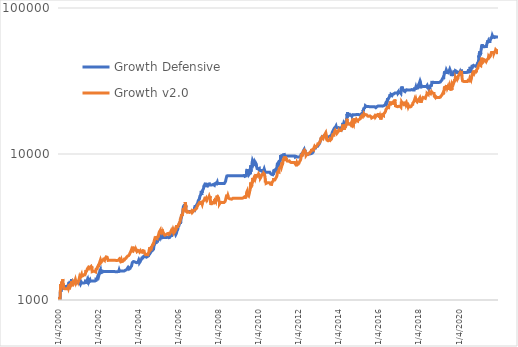
| Category | Growth Defensive | Growth v2.0  |
|---|---|---|
| 1/4/00 | 1000 | 1000 |
| 1/5/00 | 1003.036 | 1003.036 |
| 1/6/00 | 1005.294 | 1005.294 |
| 1/7/00 | 1005.06 | 1005.06 |
| 1/10/00 | 1019.551 | 1019.551 |
| 1/11/00 | 1037.263 | 1037.263 |
| 1/12/00 | 1026.501 | 1026.501 |
| 1/13/00 | 1026.954 | 1022.115 |
| 1/14/00 | 1032.608 | 1022.93 |
| 1/17/00 | 1023.44 | 1013.852 |
| 1/18/00 | 1015.754 | 1007.795 |
| 1/19/00 | 1015.568 | 1010.783 |
| 1/20/00 | 1034.936 | 1025.202 |
| 1/21/00 | 1020.52 | 1012.515 |
| 1/24/00 | 1007.949 | 1003.256 |
| 1/25/00 | 1000.638 | 992.846 |
| 1/27/00 | 1003.962 | 986.482 |
| 1/28/00 | 1035.877 | 1004.851 |
| 1/31/00 | 1011.681 | 998.544 |
| 2/1/00 | 998.548 | 999.983 |
| 2/2/00 | 1000.964 | 1006.538 |
| 2/3/00 | 988.775 | 1005.307 |
| 2/4/00 | 981.664 | 1000.814 |
| 2/7/00 | 991.341 | 1007.833 |
| 2/8/00 | 988.443 | 1011.024 |
| 2/9/00 | 997.393 | 1023.704 |
| 2/10/00 | 995.479 | 1020.842 |
| 2/11/00 | 1031.614 | 1053.531 |
| 2/14/00 | 1025.096 | 1057.264 |
| 2/15/00 | 1061.849 | 1082.846 |
| 2/16/00 | 1054.399 | 1080.925 |
| 2/17/00 | 1256.015 | 1285.806 |
| 2/18/00 | 1254.443 | 1290.288 |
| 2/21/00 | 1247.055 | 1284.836 |
| 2/22/00 | 1235.045 | 1266.466 |
| 2/23/00 | 1219.403 | 1268.23 |
| 2/24/00 | 1215.129 | 1256.827 |
| 2/25/00 | 1160.608 | 1237.536 |
| 2/28/00 | 1140.042 | 1223.905 |
| 2/29/00 | 1143.473 | 1225.102 |
| 3/1/00 | 1164.226 | 1245.711 |
| 3/2/00 | 1160.19 | 1244.124 |
| 3/3/00 | 1164.266 | 1252.529 |
| 3/6/00 | 1174.266 | 1259.044 |
| 3/7/00 | 1172.549 | 1259.177 |
| 3/8/00 | 1185.238 | 1274.489 |
| 3/9/00 | 1248.823 | 1338.648 |
| 3/10/00 | 1239.998 | 1320.71 |
| 3/13/00 | 1221.336 | 1329.579 |
| 3/14/00 | 1202.146 | 1308.362 |
| 3/15/00 | 1179.975 | 1270.431 |
| 3/16/00 | 1212.049 | 1302.504 |
| 3/17/00 | 1217.064 | 1314.364 |
| 3/20/00 | 1192.43 | 1296.609 |
| 3/21/00 | 1190.42 | 1315.158 |
| 3/22/00 | 1210.834 | 1329.492 |
| 3/23/00 | 1212.535 | 1324.609 |
| 3/24/00 | 1204.83 | 1317.545 |
| 3/27/00 | 1207.393 | 1333.15 |
| 3/28/00 | 1230.353 | 1364.961 |
| 3/29/00 | 1255.274 | 1389.19 |
| 3/30/00 | 1261.876 | 1392.548 |
| 3/31/00 | 1236.577 | 1378.398 |
| 4/3/00 | 1230.364 | 1359.225 |
| 4/4/00 | 1232.441 | 1298.787 |
| 4/5/00 | 1236.101 | 1270.415 |
| 4/6/00 | 1238.698 | 1276.308 |
| 4/7/00 | 1238.698 | 1283.265 |
| 4/10/00 | 1238.698 | 1298.486 |
| 4/11/00 | 1238.698 | 1279.275 |
| 4/12/00 | 1238.508 | 1251.778 |
| 4/13/00 | 1237.01 | 1226.87 |
| 4/14/00 | 1237.01 | 1227.103 |
| 4/17/00 | 1237.01 | 1199.176 |
| 4/18/00 | 1237.01 | 1197.257 |
| 4/19/00 | 1237.01 | 1204.24 |
| 4/20/00 | 1237.01 | 1200.465 |
| 4/26/00 | 1237.01 | 1197.986 |
| 4/27/00 | 1237.01 | 1195.097 |
| 4/28/00 | 1237.01 | 1196.443 |
| 5/1/00 | 1237.01 | 1193.445 |
| 5/2/00 | 1237.01 | 1194.721 |
| 5/3/00 | 1237.01 | 1197.196 |
| 5/4/00 | 1237.01 | 1194.197 |
| 5/5/00 | 1237.01 | 1196.743 |
| 5/8/00 | 1237.01 | 1194.568 |
| 5/9/00 | 1237.01 | 1192.698 |
| 5/10/00 | 1237.01 | 1192.998 |
| 5/11/00 | 1237.01 | 1191.952 |
| 5/12/00 | 1237.01 | 1192.475 |
| 5/15/00 | 1237.01 | 1192.475 |
| 5/16/00 | 1237.01 | 1192.475 |
| 5/17/00 | 1237.01 | 1191.428 |
| 5/18/00 | 1237.01 | 1192.998 |
| 5/19/00 | 1237.01 | 1193.521 |
| 5/22/00 | 1237.01 | 1192.475 |
| 5/23/00 | 1237.01 | 1192.475 |
| 5/24/00 | 1237.01 | 1192.998 |
| 5/25/00 | 1237.01 | 1192.998 |
| 5/26/00 | 1237.01 | 1192.475 |
| 5/29/00 | 1237.01 | 1192.998 |
| 5/30/00 | 1237.01 | 1192.475 |
| 5/31/00 | 1237.01 | 1193.521 |
| 6/1/00 | 1237.01 | 1192.998 |
| 6/2/00 | 1237.01 | 1192.998 |
| 6/5/00 | 1237.01 | 1192.998 |
| 6/6/00 | 1237.01 | 1192.998 |
| 6/7/00 | 1237.01 | 1192.998 |
| 6/8/00 | 1237.01 | 1192.998 |
| 6/9/00 | 1237.01 | 1192.998 |
| 6/13/00 | 1237.01 | 1192.998 |
| 6/14/00 | 1237.01 | 1192.998 |
| 6/15/00 | 1237.01 | 1192.998 |
| 6/16/00 | 1237.01 | 1192.998 |
| 6/19/00 | 1237.01 | 1192.998 |
| 6/20/00 | 1237.01 | 1192.998 |
| 6/21/00 | 1237.01 | 1192.998 |
| 6/22/00 | 1237.01 | 1192.998 |
| 6/23/00 | 1237.01 | 1192.998 |
| 6/26/00 | 1237.01 | 1192.998 |
| 6/27/00 | 1240.075 | 1195.947 |
| 6/28/00 | 1238.99 | 1194.901 |
| 6/29/00 | 1242.245 | 1198.04 |
| 6/30/00 | 1246.864 | 1202.488 |
| 7/3/00 | 1242.157 | 1197.942 |
| 7/4/00 | 1244.269 | 1199.971 |
| 7/5/00 | 1247.542 | 1203.126 |
| 7/6/00 | 1266.322 | 1221.223 |
| 7/7/00 | 1264.223 | 1219.195 |
| 7/10/00 | 1252.246 | 1207.647 |
| 7/11/00 | 1253.798 | 1209.146 |
| 7/12/00 | 1245.251 | 1200.907 |
| 7/13/00 | 1239.687 | 1195.544 |
| 7/14/00 | 1239.986 | 1195.827 |
| 7/17/00 | 1247.714 | 1203.273 |
| 7/18/00 | 1262.194 | 1217.234 |
| 7/19/00 | 1271.851 | 1226.546 |
| 7/20/00 | 1271.096 | 1225.82 |
| 7/21/00 | 1277.903 | 1232.383 |
| 7/24/00 | 1284.601 | 1238.841 |
| 7/25/00 | 1299.286 | 1253.004 |
| 7/26/00 | 1326.992 | 1279.725 |
| 7/27/00 | 1266.879 | 1221.741 |
| 7/28/00 | 1230.012 | 1186.176 |
| 7/31/00 | 1217.394 | 1174.006 |
| 8/1/00 | 1235.591 | 1191.56 |
| 8/2/00 | 1233.73 | 1189.764 |
| 8/3/00 | 1247.96 | 1203.483 |
| 8/4/00 | 1253.269 | 1208.603 |
| 8/7/00 | 1256.778 | 1211.985 |
| 8/8/00 | 1270.35 | 1225.072 |
| 8/9/00 | 1272.594 | 1227.24 |
| 8/10/00 | 1268.276 | 1223.073 |
| 8/11/00 | 1273.795 | 1228.399 |
| 8/14/00 | 1275.058 | 1229.62 |
| 8/15/00 | 1265.306 | 1220.215 |
| 8/16/00 | 1277.36 | 1231.839 |
| 8/17/00 | 1281.381 | 1235.714 |
| 8/18/00 | 1290.311 | 1244.315 |
| 8/21/00 | 1304.238 | 1257.746 |
| 8/22/00 | 1325.046 | 1277.805 |
| 8/23/00 | 1340.667 | 1292.867 |
| 8/24/00 | 1355.38 | 1307.062 |
| 8/25/00 | 1350.375 | 1302.24 |
| 8/28/00 | 1363.19 | 1314.608 |
| 8/29/00 | 1349.432 | 1301.339 |
| 8/30/00 | 1348.451 | 1300.393 |
| 8/31/00 | 1330.579 | 1283.16 |
| 9/1/00 | 1337.648 | 1289.985 |
| 9/4/00 | 1352.81 | 1304.606 |
| 9/5/00 | 1369.145 | 1320.359 |
| 9/6/00 | 1391.26 | 1341.686 |
| 9/7/00 | 1389.524 | 1340.018 |
| 9/8/00 | 1404.104 | 1354.085 |
| 9/11/00 | 1388.962 | 1339.478 |
| 9/12/00 | 1384.996 | 1333.801 |
| 9/13/00 | 1368.891 | 1318.822 |
| 9/14/00 | 1377.664 | 1327.652 |
| 9/15/00 | 1377.02 | 1325.082 |
| 9/18/00 | 1376.121 | 1328.111 |
| 9/19/00 | 1340.773 | 1295.185 |
| 9/20/00 | 1339.113 | 1300.618 |
| 9/21/00 | 1339.113 | 1281.749 |
| 9/22/00 | 1339.113 | 1262.334 |
| 9/25/00 | 1339.113 | 1241.358 |
| 9/26/00 | 1339.113 | 1255.956 |
| 9/27/00 | 1339.113 | 1257.59 |
| 9/28/00 | 1339.113 | 1275.503 |
| 9/29/00 | 1333.774 | 1273.13 |
| 10/2/00 | 1335.766 | 1285.334 |
| 10/3/00 | 1329.993 | 1296.278 |
| 10/4/00 | 1328.205 | 1305.65 |
| 10/5/00 | 1314.857 | 1299.66 |
| 10/6/00 | 1326.141 | 1324.797 |
| 10/9/00 | 1321.618 | 1329.645 |
| 10/10/00 | 1321.618 | 1327.309 |
| 10/11/00 | 1321.618 | 1333.831 |
| 10/12/00 | 1321.618 | 1326.594 |
| 10/13/00 | 1321.618 | 1327.752 |
| 10/16/00 | 1321.618 | 1328.826 |
| 10/17/00 | 1321.618 | 1332.28 |
| 10/18/00 | 1321.618 | 1323.485 |
| 10/19/00 | 1321.618 | 1303.222 |
| 10/20/00 | 1321.618 | 1319.859 |
| 10/23/00 | 1321.618 | 1317.955 |
| 10/24/00 | 1321.618 | 1310.437 |
| 10/25/00 | 1321.618 | 1321.753 |
| 10/26/00 | 1321.618 | 1307.59 |
| 10/27/00 | 1321.618 | 1314.051 |
| 10/30/00 | 1321.618 | 1309.943 |
| 10/31/00 | 1321.618 | 1317.461 |
| 11/1/00 | 1321.618 | 1315.053 |
| 11/2/00 | 1321.618 | 1320.443 |
| 11/3/00 | 1321.618 | 1329.46 |
| 11/6/00 | 1321.618 | 1336.368 |
| 11/7/00 | 1321.618 | 1348.137 |
| 11/8/00 | 1321.618 | 1348.714 |
| 11/9/00 | 1321.618 | 1352.863 |
| 11/10/00 | 1318.451 | 1353.385 |
| 11/13/00 | 1313.041 | 1358.533 |
| 11/14/00 | 1312.635 | 1350.425 |
| 11/15/00 | 1312.635 | 1359.847 |
| 11/16/00 | 1312.635 | 1380.058 |
| 11/17/00 | 1315.738 | 1373.664 |
| 11/20/00 | 1315.136 | 1367.486 |
| 11/21/00 | 1310.986 | 1364.129 |
| 11/22/00 | 1309.782 | 1352.387 |
| 11/23/00 | 1309.782 | 1330.084 |
| 11/24/00 | 1309.782 | 1326.635 |
| 11/27/00 | 1309.782 | 1307.399 |
| 11/28/00 | 1309.782 | 1302.211 |
| 11/29/00 | 1309.782 | 1301.442 |
| 11/30/00 | 1309.782 | 1301.151 |
| 12/1/00 | 1309.782 | 1308.731 |
| 12/4/00 | 1309.782 | 1310.097 |
| 12/5/00 | 1309.782 | 1317.244 |
| 12/6/00 | 1303.165 | 1310.802 |
| 12/7/00 | 1308.353 | 1331.808 |
| 12/8/00 | 1310.931 | 1333.527 |
| 12/11/00 | 1314.386 | 1342.311 |
| 12/12/00 | 1314.386 | 1349.482 |
| 12/13/00 | 1314.386 | 1343.883 |
| 12/14/00 | 1314.386 | 1350.309 |
| 12/15/00 | 1314.386 | 1327.373 |
| 12/18/00 | 1314.386 | 1337.944 |
| 12/19/00 | 1314.386 | 1342.663 |
| 12/20/00 | 1314.386 | 1338.064 |
| 12/21/00 | 1314.386 | 1328.605 |
| 12/22/00 | 1314.386 | 1328.047 |
| 12/27/00 | 1314.386 | 1338.446 |
| 12/28/00 | 1314.386 | 1350.651 |
| 12/29/00 | 1314.386 | 1355.938 |
| 1/2/01 | 1314.386 | 1372.54 |
| 1/3/01 | 1314.386 | 1370.428 |
| 1/4/01 | 1314.386 | 1371.98 |
| 1/5/01 | 1309.308 | 1361.367 |
| 1/8/01 | 1303.499 | 1353.46 |
| 1/9/01 | 1300.698 | 1339.861 |
| 1/10/01 | 1300.698 | 1338.699 |
| 1/11/01 | 1300.698 | 1347.287 |
| 1/12/01 | 1300.698 | 1343.675 |
| 1/15/01 | 1300.698 | 1335.371 |
| 1/16/01 | 1300.698 | 1344.322 |
| 1/17/01 | 1300.698 | 1351.952 |
| 1/18/01 | 1300.698 | 1370.916 |
| 1/19/01 | 1300.698 | 1376.613 |
| 1/22/01 | 1300.698 | 1375.755 |
| 1/23/01 | 1300.698 | 1379.633 |
| 1/24/01 | 1300.922 | 1385.025 |
| 1/25/01 | 1298.437 | 1389.675 |
| 1/29/01 | 1298.851 | 1389.753 |
| 1/30/01 | 1302.993 | 1435.679 |
| 1/31/01 | 1307.964 | 1446.406 |
| 2/1/01 | 1309.206 | 1442.849 |
| 2/2/01 | 1303.822 | 1419.131 |
| 2/5/01 | 1303.398 | 1413.413 |
| 2/6/01 | 1308.881 | 1416.126 |
| 2/7/01 | 1301.757 | 1410.354 |
| 2/8/01 | 1309.634 | 1417.1 |
| 2/9/01 | 1293.25 | 1407.412 |
| 2/12/01 | 1289.591 | 1411.898 |
| 2/13/01 | 1293.212 | 1427.592 |
| 2/14/01 | 1291.383 | 1431.896 |
| 2/15/01 | 1280.877 | 1395.801 |
| 2/16/01 | 1295.522 | 1401.455 |
| 2/19/01 | 1280.529 | 1414.266 |
| 2/20/01 | 1268.828 | 1425.463 |
| 2/21/01 | 1275.913 | 1433.589 |
| 2/22/01 | 1277.774 | 1439.523 |
| 2/23/01 | 1303.233 | 1450.902 |
| 2/26/01 | 1302.328 | 1467.644 |
| 2/27/01 | 1306.194 | 1466.026 |
| 2/28/01 | 1330.742 | 1487.233 |
| 3/1/01 | 1323.424 | 1482.493 |
| 3/2/01 | 1334.798 | 1486.464 |
| 3/5/01 | 1334.94 | 1482.485 |
| 3/6/01 | 1326.283 | 1480.206 |
| 3/7/01 | 1340.32 | 1495.391 |
| 3/8/01 | 1334.277 | 1489.213 |
| 3/9/01 | 1347.844 | 1498.496 |
| 3/12/01 | 1333.972 | 1488.24 |
| 3/13/01 | 1305.086 | 1456.11 |
| 3/14/01 | 1309.292 | 1463.373 |
| 3/15/01 | 1309.292 | 1435.525 |
| 3/16/01 | 1309.292 | 1447.426 |
| 3/19/01 | 1309.292 | 1446.092 |
| 3/20/01 | 1309.292 | 1461.99 |
| 3/21/01 | 1309.292 | 1470.641 |
| 3/22/01 | 1309.292 | 1466.742 |
| 3/23/01 | 1309.292 | 1460.32 |
| 3/26/01 | 1309.292 | 1458.419 |
| 3/27/01 | 1309.292 | 1462.575 |
| 3/28/01 | 1309.292 | 1455.722 |
| 3/29/01 | 1309.292 | 1453.483 |
| 3/30/01 | 1309.292 | 1452.38 |
| 4/2/01 | 1309.292 | 1465.615 |
| 4/3/01 | 1309.292 | 1459.121 |
| 4/4/01 | 1309.292 | 1452.22 |
| 4/5/01 | 1309.292 | 1457.365 |
| 4/6/01 | 1309.292 | 1468.305 |
| 4/9/01 | 1309.292 | 1471.857 |
| 4/10/01 | 1309.292 | 1470.098 |
| 4/11/01 | 1309.292 | 1462.996 |
| 4/12/01 | 1309.292 | 1463.84 |
| 4/17/01 | 1309.292 | 1456.772 |
| 4/18/01 | 1309.292 | 1473.61 |
| 4/19/01 | 1311.584 | 1490.897 |
| 4/20/01 | 1310.343 | 1490.769 |
| 4/23/01 | 1308.172 | 1477.579 |
| 4/24/01 | 1313.632 | 1476.159 |
| 4/26/01 | 1314.687 | 1483.552 |
| 4/27/01 | 1313.59 | 1484.03 |
| 4/30/01 | 1314.975 | 1475.445 |
| 5/1/01 | 1316.407 | 1471.961 |
| 5/2/01 | 1312.063 | 1483.899 |
| 5/3/01 | 1306.016 | 1491.19 |
| 5/4/01 | 1300.548 | 1485.486 |
| 5/7/01 | 1303.691 | 1501.116 |
| 5/8/01 | 1312.994 | 1488.914 |
| 5/9/01 | 1314.952 | 1492.649 |
| 5/10/01 | 1317.179 | 1499.043 |
| 5/11/01 | 1319.824 | 1497.177 |
| 5/14/01 | 1320.261 | 1492.661 |
| 5/15/01 | 1324.788 | 1488.771 |
| 5/16/01 | 1325.189 | 1497.256 |
| 5/17/01 | 1323.923 | 1515.977 |
| 5/18/01 | 1348.323 | 1537.899 |
| 5/21/01 | 1376.376 | 1551.297 |
| 5/22/01 | 1354.679 | 1540.837 |
| 5/23/01 | 1356.314 | 1556.921 |
| 5/24/01 | 1343.72 | 1558.285 |
| 5/25/01 | 1355.726 | 1561.789 |
| 5/28/01 | 1375.208 | 1570.099 |
| 5/29/01 | 1373.089 | 1600.323 |
| 5/30/01 | 1351.006 | 1580.917 |
| 5/31/01 | 1323.093 | 1566.208 |
| 6/1/01 | 1322.196 | 1564.46 |
| 6/4/01 | 1317.818 | 1577.559 |
| 6/5/01 | 1288.22 | 1565.592 |
| 6/6/01 | 1276.171 | 1554.445 |
| 6/7/01 | 1291.949 | 1576.502 |
| 6/8/01 | 1291.431 | 1576.414 |
| 6/12/01 | 1289.204 | 1580.913 |
| 6/13/01 | 1307.534 | 1596.02 |
| 6/14/01 | 1320.31 | 1610.503 |
| 6/15/01 | 1346.865 | 1612.983 |
| 6/18/01 | 1343.999 | 1610.941 |
| 6/19/01 | 1331.624 | 1616.364 |
| 6/20/01 | 1338.076 | 1620.479 |
| 6/21/01 | 1332.011 | 1634.561 |
| 6/22/01 | 1334.098 | 1647.986 |
| 6/25/01 | 1338.686 | 1643.207 |
| 6/26/01 | 1350.339 | 1638.09 |
| 6/27/01 | 1345.521 | 1635.508 |
| 6/28/01 | 1383.821 | 1635.599 |
| 6/29/01 | 1398.873 | 1641.277 |
| 7/2/01 | 1359.407 | 1631.919 |
| 7/3/01 | 1344.576 | 1630.17 |
| 7/4/01 | 1397.971 | 1646.4 |
| 7/5/01 | 1397.755 | 1651.338 |
| 7/6/01 | 1389.229 | 1657.873 |
| 7/9/01 | 1399.9 | 1672.208 |
| 7/10/01 | 1410.226 | 1690.708 |
| 7/11/01 | 1401.531 | 1687.513 |
| 7/12/01 | 1404.393 | 1683.47 |
| 7/13/01 | 1402.645 | 1685.021 |
| 7/16/01 | 1398.414 | 1681.337 |
| 7/17/01 | 1395.718 | 1696.731 |
| 7/18/01 | 1398.271 | 1689.712 |
| 7/19/01 | 1391.737 | 1677.013 |
| 7/20/01 | 1391.718 | 1662.218 |
| 7/23/01 | 1381.543 | 1645.893 |
| 7/24/01 | 1358.283 | 1638.83 |
| 7/25/01 | 1335.796 | 1638.519 |
| 7/26/01 | 1334.37 | 1630.027 |
| 7/27/01 | 1334.37 | 1628.636 |
| 7/30/01 | 1334.37 | 1625.78 |
| 7/31/01 | 1334.37 | 1632.934 |
| 8/1/01 | 1334.37 | 1656.513 |
| 8/2/01 | 1333.99 | 1662.524 |
| 8/3/01 | 1332.799 | 1662.824 |
| 8/6/01 | 1340.943 | 1667.034 |
| 8/7/01 | 1338.888 | 1669.992 |
| 8/8/01 | 1347.691 | 1676.81 |
| 8/9/01 | 1367.244 | 1682.806 |
| 8/10/01 | 1354.158 | 1678.845 |
| 8/13/01 | 1358.99 | 1683.201 |
| 8/14/01 | 1345.006 | 1676.815 |
| 8/15/01 | 1347.877 | 1667.527 |
| 8/16/01 | 1347.877 | 1660.028 |
| 8/17/01 | 1347.877 | 1667.387 |
| 8/20/01 | 1347.877 | 1665.108 |
| 8/21/01 | 1347.877 | 1679.702 |
| 8/22/01 | 1347.877 | 1671.66 |
| 8/23/01 | 1347.877 | 1678.099 |
| 8/24/01 | 1347.877 | 1689.847 |
| 8/27/01 | 1347.877 | 1699.877 |
| 8/28/01 | 1347.877 | 1708.915 |
| 8/29/01 | 1347.877 | 1721.714 |
| 8/30/01 | 1347.877 | 1716.641 |
| 8/31/01 | 1347.877 | 1693.862 |
| 9/3/01 | 1347.877 | 1668.836 |
| 9/4/01 | 1347.877 | 1646.278 |
| 9/5/01 | 1347.877 | 1660.765 |
| 9/6/01 | 1347.877 | 1685.831 |
| 9/7/01 | 1347.877 | 1684.85 |
| 9/10/01 | 1347.877 | 1677.031 |
| 9/11/01 | 1347.877 | 1702.46 |
| 9/12/01 | 1347.877 | 1652.372 |
| 9/13/01 | 1347.877 | 1658.72 |
| 9/14/01 | 1347.877 | 1627.751 |
| 9/17/01 | 1347.877 | 1564.245 |
| 9/18/01 | 1347.877 | 1574.69 |
| 9/19/01 | 1347.877 | 1574.69 |
| 9/20/01 | 1347.877 | 1574.69 |
| 9/21/01 | 1347.877 | 1574.69 |
| 9/24/01 | 1347.877 | 1574.69 |
| 9/25/01 | 1347.877 | 1574.69 |
| 9/26/01 | 1347.877 | 1574.69 |
| 9/27/01 | 1347.877 | 1574.69 |
| 9/28/01 | 1347.877 | 1574.69 |
| 10/1/01 | 1347.877 | 1574.69 |
| 10/2/01 | 1347.877 | 1574.69 |
| 10/3/01 | 1347.877 | 1574.69 |
| 10/4/01 | 1347.877 | 1574.69 |
| 10/5/01 | 1347.877 | 1574.69 |
| 10/8/01 | 1347.877 | 1574.69 |
| 10/9/01 | 1347.877 | 1574.69 |
| 10/10/01 | 1347.877 | 1574.69 |
| 10/11/01 | 1347.877 | 1574.69 |
| 10/12/01 | 1347.877 | 1574.69 |
| 10/15/01 | 1347.877 | 1574.69 |
| 10/16/01 | 1347.877 | 1574.69 |
| 10/17/01 | 1347.877 | 1574.69 |
| 10/18/01 | 1347.877 | 1574.69 |
| 10/19/01 | 1347.877 | 1574.69 |
| 10/22/01 | 1347.877 | 1574.69 |
| 10/23/01 | 1347.877 | 1574.69 |
| 10/24/01 | 1347.877 | 1574.69 |
| 10/25/01 | 1347.877 | 1574.69 |
| 10/26/01 | 1347.877 | 1574.69 |
| 10/29/01 | 1347.877 | 1574.69 |
| 10/30/01 | 1347.877 | 1574.69 |
| 10/31/01 | 1347.877 | 1574.69 |
| 11/1/01 | 1347.877 | 1574.69 |
| 11/2/01 | 1347.877 | 1574.69 |
| 11/5/01 | 1347.877 | 1574.69 |
| 11/6/01 | 1347.877 | 1574.69 |
| 11/7/01 | 1346.86 | 1573.534 |
| 11/8/01 | 1342.269 | 1571.602 |
| 11/9/01 | 1337.475 | 1571.602 |
| 11/12/01 | 1338.013 | 1571.602 |
| 11/13/01 | 1345.485 | 1575.323 |
| 11/14/01 | 1342.355 | 1571.647 |
| 11/15/01 | 1347.279 | 1568.619 |
| 11/16/01 | 1332.997 | 1556.539 |
| 11/19/01 | 1333.118 | 1557.755 |
| 11/20/01 | 1340.951 | 1573.237 |
| 11/21/01 | 1339.003 | 1569.764 |
| 11/22/01 | 1349.669 | 1583.453 |
| 11/23/01 | 1343.135 | 1573.959 |
| 11/26/01 | 1359.98 | 1595.612 |
| 11/27/01 | 1390.872 | 1625.439 |
| 11/28/01 | 1384.314 | 1616.526 |
| 11/29/01 | 1386.331 | 1617.005 |
| 11/30/01 | 1393.896 | 1627.847 |
| 12/3/01 | 1404.571 | 1643.378 |
| 12/4/01 | 1409.387 | 1640.256 |
| 12/5/01 | 1394.75 | 1627.13 |
| 12/6/01 | 1392.236 | 1626.14 |
| 12/7/01 | 1389.385 | 1625.962 |
| 12/10/01 | 1393.905 | 1630.639 |
| 12/11/01 | 1402.572 | 1639.862 |
| 12/12/01 | 1404.536 | 1647.03 |
| 12/13/01 | 1404.319 | 1643.337 |
| 12/14/01 | 1396.54 | 1635.486 |
| 12/17/01 | 1388 | 1634.312 |
| 12/18/01 | 1405.464 | 1642.572 |
| 12/19/01 | 1415.263 | 1658.484 |
| 12/20/01 | 1427.064 | 1673.364 |
| 12/21/01 | 1435.656 | 1685.784 |
| 12/24/01 | 1433.285 | 1672.673 |
| 12/27/01 | 1447.658 | 1679.278 |
| 12/28/01 | 1452.075 | 1690.515 |
| 12/31/01 | 1462.24 | 1697.174 |
| 1/2/02 | 1473.65 | 1709.026 |
| 1/3/02 | 1475.764 | 1705.273 |
| 1/4/02 | 1464.636 | 1690.083 |
| 1/7/02 | 1454.422 | 1680.972 |
| 1/8/02 | 1468.285 | 1696.987 |
| 1/9/02 | 1472.557 | 1698.297 |
| 1/10/02 | 1488.286 | 1704.762 |
| 1/11/02 | 1497.113 | 1715.211 |
| 1/14/02 | 1486.824 | 1709.181 |
| 1/15/02 | 1478.312 | 1709.681 |
| 1/16/02 | 1479.196 | 1719.183 |
| 1/17/02 | 1472.915 | 1703.461 |
| 1/18/02 | 1479.963 | 1714.872 |
| 1/21/02 | 1490.55 | 1729.25 |
| 1/22/02 | 1497.452 | 1726.128 |
| 1/23/02 | 1510.857 | 1746.721 |
| 1/24/02 | 1515.588 | 1765.075 |
| 1/25/02 | 1511.891 | 1752.542 |
| 1/29/02 | 1514.527 | 1754.869 |
| 1/30/02 | 1529.444 | 1770.268 |
| 1/31/02 | 1549.849 | 1804.306 |
| 2/1/02 | 1549.605 | 1810.011 |
| 2/4/02 | 1583.329 | 1832.47 |
| 2/5/02 | 1584.73 | 1825.443 |
| 2/6/02 | 1601.314 | 1833.688 |
| 2/7/02 | 1598.502 | 1842.545 |
| 2/8/02 | 1592.158 | 1834.249 |
| 2/11/02 | 1596.029 | 1838.1 |
| 2/12/02 | 1606.541 | 1855.876 |
| 2/13/02 | 1604.446 | 1845.698 |
| 2/14/02 | 1608.02 | 1859.203 |
| 2/15/02 | 1614.709 | 1877.648 |
| 2/18/02 | 1602.5 | 1896.767 |
| 2/19/02 | 1595.427 | 1877.184 |
| 2/20/02 | 1563.706 | 1855.722 |
| 2/21/02 | 1547.389 | 1844.691 |
| 2/22/02 | 1552.57 | 1840.509 |
| 2/25/02 | 1540.43 | 1834.028 |
| 2/26/02 | 1538.075 | 1834.808 |
| 2/27/02 | 1531.57 | 1811.343 |
| 2/28/02 | 1543.738 | 1831.657 |
| 3/1/02 | 1537.364 | 1819.546 |
| 3/4/02 | 1547.528 | 1817.924 |
| 3/5/02 | 1532.237 | 1811.93 |
| 3/6/02 | 1527.172 | 1816.945 |
| 3/7/02 | 1520.789 | 1824.28 |
| 3/8/02 | 1520.863 | 1818.208 |
| 3/11/02 | 1530.079 | 1819.637 |
| 3/12/02 | 1529.897 | 1818.385 |
| 3/13/02 | 1536.381 | 1840.363 |
| 3/14/02 | 1533.08 | 1836.793 |
| 3/15/02 | 1539.996 | 1826.794 |
| 3/18/02 | 1549.502 | 1832.915 |
| 3/19/02 | 1548.762 | 1845.647 |
| 3/20/02 | 1549.672 | 1857.508 |
| 3/21/02 | 1554.211 | 1863.473 |
| 3/22/02 | 1562.158 | 1870.472 |
| 3/25/02 | 1576.325 | 1888.477 |
| 3/26/02 | 1562.248 | 1884.476 |
| 3/27/02 | 1567.353 | 1880.819 |
| 3/28/02 | 1563.726 | 1887.165 |
| 4/2/02 | 1567.391 | 1876.58 |
| 4/3/02 | 1565.091 | 1885.677 |
| 4/4/02 | 1565.091 | 1886.122 |
| 4/5/02 | 1565.091 | 1888.784 |
| 4/8/02 | 1565.091 | 1877.407 |
| 4/9/02 | 1565.091 | 1901.091 |
| 4/10/02 | 1565.091 | 1906.551 |
| 4/11/02 | 1565.091 | 1911.788 |
| 4/12/02 | 1565.091 | 1904.886 |
| 4/15/02 | 1565.091 | 1901.906 |
| 4/16/02 | 1565.091 | 1903.414 |
| 4/17/02 | 1565.091 | 1890.677 |
| 4/18/02 | 1565.091 | 1886.782 |
| 4/19/02 | 1565.091 | 1886.004 |
| 4/22/02 | 1565.091 | 1893.071 |
| 4/23/02 | 1565.091 | 1899.732 |
| 4/24/02 | 1565.091 | 1899.538 |
| 4/26/02 | 1565.091 | 1890.799 |
| 4/29/02 | 1565.091 | 1870.658 |
| 4/30/02 | 1565.091 | 1875.389 |
| 5/1/02 | 1565.091 | 1883.104 |
| 5/2/02 | 1565.091 | 1905.063 |
| 5/3/02 | 1565.091 | 1905.077 |
| 5/6/02 | 1565.091 | 1928.743 |
| 5/7/02 | 1565.091 | 1916.206 |
| 5/8/02 | 1565.091 | 1920.628 |
| 5/9/02 | 1565.091 | 1911.531 |
| 5/10/02 | 1565.091 | 1919.032 |
| 5/13/02 | 1565.091 | 1927.612 |
| 5/14/02 | 1565.091 | 1927.4 |
| 5/15/02 | 1565.091 | 1921.779 |
| 5/16/02 | 1565.091 | 1923.776 |
| 5/17/02 | 1565.091 | 1938.484 |
| 5/20/02 | 1566.256 | 1953.766 |
| 5/21/02 | 1566.256 | 1952.053 |
| 5/22/02 | 1566.256 | 1963.693 |
| 5/23/02 | 1566.256 | 1960.689 |
| 5/24/02 | 1566.256 | 1960.894 |
| 5/27/02 | 1566.256 | 1968.212 |
| 5/28/02 | 1566.256 | 1951.045 |
| 5/29/02 | 1566.256 | 1973.501 |
| 5/30/02 | 1566.256 | 1973.946 |
| 5/31/02 | 1566.256 | 1968.212 |
| 6/3/02 | 1566.256 | 1982.672 |
| 6/4/02 | 1566.256 | 1971.429 |
| 6/5/02 | 1566.256 | 1978.076 |
| 6/6/02 | 1566.256 | 1981.237 |
| 6/7/02 | 1566.256 | 1976.52 |
| 6/11/02 | 1566.256 | 1965.518 |
| 6/12/02 | 1566.256 | 1960.589 |
| 6/13/02 | 1566.256 | 1967.509 |
| 6/14/02 | 1566.256 | 1969.864 |
| 6/17/02 | 1566.256 | 1963.697 |
| 6/18/02 | 1566.256 | 1959.884 |
| 6/19/02 | 1566.256 | 1965.173 |
| 6/20/02 | 1566.256 | 1969.614 |
| 6/21/02 | 1566.256 | 1961.05 |
| 6/24/02 | 1566.256 | 1949.153 |
| 6/25/02 | 1566.256 | 1916.881 |
| 6/26/02 | 1566.256 | 1894.814 |
| 6/27/02 | 1566.256 | 1896.813 |
| 6/28/02 | 1566.256 | 1901.566 |
| 7/1/02 | 1566.256 | 1893.619 |
| 7/2/02 | 1566.256 | 1890.78 |
| 7/3/02 | 1566.256 | 1867.957 |
| 7/4/02 | 1566.256 | 1872.309 |
| 7/5/02 | 1566.256 | 1872.309 |
| 7/8/02 | 1566.256 | 1872.309 |
| 7/9/02 | 1566.256 | 1872.309 |
| 7/10/02 | 1566.256 | 1872.309 |
| 7/11/02 | 1566.256 | 1872.309 |
| 7/12/02 | 1566.256 | 1872.309 |
| 7/15/02 | 1566.256 | 1872.309 |
| 7/16/02 | 1566.256 | 1872.309 |
| 7/17/02 | 1566.256 | 1872.309 |
| 7/18/02 | 1566.256 | 1872.309 |
| 7/19/02 | 1566.256 | 1872.309 |
| 7/22/02 | 1566.256 | 1872.309 |
| 7/23/02 | 1566.256 | 1872.309 |
| 7/24/02 | 1566.256 | 1872.309 |
| 7/25/02 | 1566.256 | 1872.309 |
| 7/26/02 | 1566.256 | 1872.309 |
| 7/29/02 | 1566.256 | 1872.309 |
| 7/30/02 | 1566.256 | 1872.309 |
| 7/31/02 | 1566.256 | 1872.309 |
| 8/1/02 | 1566.256 | 1872.309 |
| 8/2/02 | 1566.256 | 1872.309 |
| 8/5/02 | 1566.256 | 1872.309 |
| 8/6/02 | 1566.256 | 1872.309 |
| 8/7/02 | 1566.256 | 1872.309 |
| 8/8/02 | 1566.256 | 1872.309 |
| 8/9/02 | 1566.256 | 1872.309 |
| 8/12/02 | 1566.256 | 1872.309 |
| 8/13/02 | 1566.256 | 1872.309 |
| 8/14/02 | 1566.256 | 1872.309 |
| 8/15/02 | 1566.256 | 1872.309 |
| 8/16/02 | 1566.256 | 1872.309 |
| 8/19/02 | 1566.256 | 1872.309 |
| 8/20/02 | 1566.256 | 1872.309 |
| 8/21/02 | 1566.256 | 1872.309 |
| 8/22/02 | 1566.256 | 1872.309 |
| 8/23/02 | 1566.256 | 1872.309 |
| 8/26/02 | 1566.256 | 1872.309 |
| 8/27/02 | 1566.256 | 1872.309 |
| 8/28/02 | 1566.256 | 1872.309 |
| 8/29/02 | 1566.256 | 1872.309 |
| 8/30/02 | 1566.256 | 1872.309 |
| 9/2/02 | 1566.256 | 1872.309 |
| 9/3/02 | 1566.256 | 1872.309 |
| 9/4/02 | 1566.256 | 1872.309 |
| 9/5/02 | 1566.256 | 1872.309 |
| 9/6/02 | 1566.256 | 1872.309 |
| 9/9/02 | 1566.256 | 1872.309 |
| 9/10/02 | 1566.256 | 1872.309 |
| 9/11/02 | 1566.256 | 1872.309 |
| 9/12/02 | 1566.256 | 1872.309 |
| 9/13/02 | 1566.256 | 1872.309 |
| 9/16/02 | 1566.256 | 1872.309 |
| 9/17/02 | 1566.256 | 1872.309 |
| 9/18/02 | 1566.256 | 1872.309 |
| 9/19/02 | 1566.256 | 1872.309 |
| 9/20/02 | 1566.256 | 1872.309 |
| 9/23/02 | 1566.256 | 1872.309 |
| 9/24/02 | 1566.256 | 1872.309 |
| 9/25/02 | 1566.256 | 1872.309 |
| 9/26/02 | 1566.256 | 1872.309 |
| 9/27/02 | 1566.256 | 1872.309 |
| 9/30/02 | 1566.256 | 1872.309 |
| 10/1/02 | 1566.256 | 1872.309 |
| 10/2/02 | 1566.256 | 1872.309 |
| 10/3/02 | 1566.256 | 1872.309 |
| 10/4/02 | 1566.256 | 1872.309 |
| 10/7/02 | 1566.256 | 1872.309 |
| 10/8/02 | 1566.256 | 1872.309 |
| 10/9/02 | 1566.256 | 1872.309 |
| 10/10/02 | 1566.256 | 1872.309 |
| 10/11/02 | 1566.256 | 1872.309 |
| 10/14/02 | 1566.256 | 1872.309 |
| 10/15/02 | 1566.256 | 1872.309 |
| 10/16/02 | 1566.256 | 1872.309 |
| 10/17/02 | 1566.256 | 1872.309 |
| 10/18/02 | 1566.256 | 1872.309 |
| 10/21/02 | 1566.256 | 1872.309 |
| 10/22/02 | 1566.256 | 1872.309 |
| 10/23/02 | 1566.256 | 1872.309 |
| 10/24/02 | 1566.256 | 1872.309 |
| 10/25/02 | 1566.256 | 1872.309 |
| 10/28/02 | 1566.256 | 1872.309 |
| 10/29/02 | 1566.256 | 1872.309 |
| 10/30/02 | 1566.256 | 1872.309 |
| 10/31/02 | 1566.256 | 1872.309 |
| 11/1/02 | 1566.256 | 1872.309 |
| 11/4/02 | 1566.256 | 1872.309 |
| 11/5/02 | 1566.256 | 1872.309 |
| 11/6/02 | 1566.256 | 1872.309 |
| 11/7/02 | 1562.783 | 1868.195 |
| 11/8/02 | 1563.252 | 1867.634 |
| 11/11/02 | 1563.252 | 1864.832 |
| 11/12/02 | 1563.252 | 1862.589 |
| 11/13/02 | 1563.252 | 1862.589 |
| 11/14/02 | 1563.252 | 1862.589 |
| 11/15/02 | 1563.252 | 1861.468 |
| 11/18/02 | 1563.252 | 1861.468 |
| 11/19/02 | 1563.252 | 1860.347 |
| 11/20/02 | 1563.252 | 1861.468 |
| 11/21/02 | 1563.252 | 1863.15 |
| 11/22/02 | 1563.252 | 1867.074 |
| 11/25/02 | 1563.252 | 1865.953 |
| 11/26/02 | 1563.252 | 1864.831 |
| 11/27/02 | 1563.252 | 1867.634 |
| 11/28/02 | 1563.252 | 1868.195 |
| 11/29/02 | 1563.252 | 1866.513 |
| 12/2/02 | 1563.252 | 1867.074 |
| 12/3/02 | 1563.252 | 1867.074 |
| 12/4/02 | 1563.252 | 1865.392 |
| 12/5/02 | 1563.252 | 1867.074 |
| 12/6/02 | 1563.252 | 1864.271 |
| 12/9/02 | 1563.252 | 1864.831 |
| 12/10/02 | 1563.252 | 1864.831 |
| 12/11/02 | 1563.252 | 1864.831 |
| 12/12/02 | 1563.252 | 1863.71 |
| 12/13/02 | 1563.252 | 1865.392 |
| 12/16/02 | 1563.252 | 1864.831 |
| 12/17/02 | 1563.252 | 1862.589 |
| 12/18/02 | 1563.252 | 1863.15 |
| 12/19/02 | 1563.252 | 1864.831 |
| 12/20/02 | 1563.252 | 1865.952 |
| 12/23/02 | 1563.252 | 1866.513 |
| 12/24/02 | 1560.629 | 1863.418 |
| 12/27/02 | 1563.062 | 1866.323 |
| 12/30/02 | 1558.283 | 1858.972 |
| 12/31/02 | 1557.814 | 1860.03 |
| 1/2/03 | 1557.814 | 1864.616 |
| 1/3/03 | 1560.204 | 1868.801 |
| 1/6/03 | 1560.402 | 1871.944 |
| 1/7/03 | 1559.182 | 1869.905 |
| 1/8/03 | 1559.732 | 1866.366 |
| 1/9/03 | 1567.244 | 1878.352 |
| 1/10/03 | 1563.894 | 1870.537 |
| 1/13/03 | 1566.128 | 1875.059 |
| 1/14/03 | 1563.118 | 1871.401 |
| 1/15/03 | 1554.347 | 1862.431 |
| 1/16/03 | 1553.554 | 1867.379 |
| 1/17/03 | 1560.998 | 1869.153 |
| 1/20/03 | 1573.457 | 1873.006 |
| 1/21/03 | 1604.195 | 1885.854 |
| 1/22/03 | 1607.12 | 1884.044 |
| 1/23/03 | 1613.628 | 1905.711 |
| 1/24/03 | 1607.25 | 1912.2 |
| 1/28/03 | 1574.477 | 1878.701 |
| 1/29/03 | 1579.681 | 1880.21 |
| 1/30/03 | 1579.681 | 1877.254 |
| 1/31/03 | 1579.681 | 1893.659 |
| 2/3/03 | 1579.681 | 1890.034 |
| 2/4/03 | 1579.681 | 1907.251 |
| 2/5/03 | 1579.681 | 1907.629 |
| 2/6/03 | 1579.681 | 1879.479 |
| 2/7/03 | 1579.681 | 1879.761 |
| 2/10/03 | 1579.681 | 1850.784 |
| 2/11/03 | 1579.681 | 1856.95 |
| 2/12/03 | 1579.681 | 1857.459 |
| 2/13/03 | 1579.681 | 1850.292 |
| 2/14/03 | 1579.681 | 1855.244 |
| 2/17/03 | 1579.681 | 1848.91 |
| 2/18/03 | 1579.681 | 1860.038 |
| 2/19/03 | 1579.681 | 1876.381 |
| 2/20/03 | 1579.681 | 1876.523 |
| 2/21/03 | 1579.681 | 1880.181 |
| 2/24/03 | 1579.681 | 1892.853 |
| 2/25/03 | 1579.681 | 1868.008 |
| 2/26/03 | 1579.681 | 1874.889 |
| 2/27/03 | 1579.681 | 1861.539 |
| 2/28/03 | 1579.681 | 1854.211 |
| 3/3/03 | 1579.681 | 1865.048 |
| 3/4/03 | 1579.681 | 1871.548 |
| 3/5/03 | 1579.681 | 1852.644 |
| 3/6/03 | 1579.681 | 1847.221 |
| 3/7/03 | 1579.681 | 1832.148 |
| 3/10/03 | 1579.681 | 1852.124 |
| 3/11/03 | 1579.681 | 1848.425 |
| 3/12/03 | 1579.681 | 1839.406 |
| 3/13/03 | 1579.681 | 1827.203 |
| 3/14/03 | 1579.681 | 1826.327 |
| 3/17/03 | 1579.681 | 1819.608 |
| 3/18/03 | 1579.681 | 1836.084 |
| 3/19/03 | 1579.681 | 1839.118 |
| 3/20/03 | 1579.681 | 1841.154 |
| 3/21/03 | 1579.681 | 1842.503 |
| 3/24/03 | 1579.681 | 1836.743 |
| 3/25/03 | 1579.681 | 1843.707 |
| 3/26/03 | 1579.681 | 1839.272 |
| 3/27/03 | 1579.681 | 1851.21 |
| 3/28/03 | 1579.681 | 1861.837 |
| 3/31/03 | 1579.681 | 1863.754 |
| 4/1/03 | 1579.681 | 1852.742 |
| 4/2/03 | 1579.681 | 1848.463 |
| 4/3/03 | 1579.681 | 1862.102 |
| 4/4/03 | 1579.681 | 1876.795 |
| 4/7/03 | 1579.681 | 1879.914 |
| 4/8/03 | 1579.293 | 1868.778 |
| 4/9/03 | 1576.529 | 1868.851 |
| 4/10/03 | 1578.749 | 1882.678 |
| 4/11/03 | 1578.951 | 1881.146 |
| 4/14/03 | 1576.933 | 1879.918 |
| 4/15/03 | 1577.942 | 1873.277 |
| 4/16/03 | 1577.942 | 1873.681 |
| 4/17/03 | 1578.749 | 1875.006 |
| 4/22/03 | 1579.165 | 1880.621 |
| 4/23/03 | 1578.543 | 1878.393 |
| 4/24/03 | 1573.248 | 1878.63 |
| 4/28/03 | 1580.19 | 1901.138 |
| 4/29/03 | 1582.797 | 1905.163 |
| 4/30/03 | 1582.204 | 1910.356 |
| 5/1/03 | 1587.099 | 1919.92 |
| 5/2/03 | 1586.787 | 1920.52 |
| 5/5/03 | 1586.953 | 1929.335 |
| 5/6/03 | 1599.311 | 1944.421 |
| 5/7/03 | 1593.051 | 1930.571 |
| 5/8/03 | 1586.124 | 1908.413 |
| 5/9/03 | 1587.671 | 1919.293 |
| 5/12/03 | 1595.735 | 1937.097 |
| 5/13/03 | 1595.25 | 1937.845 |
| 5/14/03 | 1597.935 | 1933.012 |
| 5/15/03 | 1582.5 | 1913.466 |
| 5/16/03 | 1575.801 | 1899.606 |
| 5/19/03 | 1586.099 | 1917.34 |
| 5/20/03 | 1583.312 | 1908.556 |
| 5/21/03 | 1574.653 | 1895.453 |
| 5/22/03 | 1579.538 | 1901.447 |
| 5/23/03 | 1593.531 | 1918.565 |
| 5/26/03 | 1598.105 | 1931.954 |
| 5/27/03 | 1605.132 | 1932.493 |
| 5/28/03 | 1618.205 | 1952.048 |
| 5/29/03 | 1610.573 | 1955.038 |
| 5/30/03 | 1612.455 | 1938.456 |
| 6/2/03 | 1609.021 | 1927.809 |
| 6/3/03 | 1608.631 | 1936.366 |
| 6/4/03 | 1622.468 | 1949.144 |
| 6/5/03 | 1626.884 | 1957.995 |
| 6/6/03 | 1626.3 | 1963.937 |
| 6/10/03 | 1614.776 | 1945.932 |
| 6/11/03 | 1623.633 | 1946.95 |
| 6/12/03 | 1625.593 | 1957.107 |
| 6/13/03 | 1617.333 | 1942.793 |
| 6/16/03 | 1631.285 | 1954.593 |
| 6/17/03 | 1638.621 | 1961.605 |
| 6/18/03 | 1641.783 | 1963.683 |
| 6/19/03 | 1647.284 | 1964.672 |
| 6/20/03 | 1638.839 | 1958.145 |
| 6/23/03 | 1637.902 | 1973.82 |
| 6/24/03 | 1635.969 | 1968.217 |
| 6/25/03 | 1660.491 | 1998.256 |
| 6/26/03 | 1636.931 | 1974.563 |
| 6/27/03 | 1641.05 | 1981.699 |
| 6/30/03 | 1631.122 | 1969.368 |
| 7/1/03 | 1641.001 | 1986.587 |
| 7/2/03 | 1654.452 | 1992.605 |
| 7/3/03 | 1672.328 | 2008.763 |
| 7/4/03 | 1658.309 | 2000.149 |
| 7/7/03 | 1662.618 | 2004.833 |
| 7/8/03 | 1680.314 | 2022.054 |
| 7/9/03 | 1667.623 | 2015.84 |
| 7/10/03 | 1663.126 | 2016.573 |
| 7/11/03 | 1646.426 | 2003.713 |
| 7/14/03 | 1671.728 | 2015.832 |
| 7/15/03 | 1671.59 | 2006.336 |
| 7/16/03 | 1674.817 | 2033.68 |
| 7/17/03 | 1661.442 | 2034.576 |
| 7/18/03 | 1664.448 | 2026.607 |
| 7/21/03 | 1628.7 | 2023.92 |
| 7/22/03 | 1625.491 | 2016.197 |
| 7/23/03 | 1626.928 | 2023.163 |
| 7/24/03 | 1625.99 | 2036.067 |
| 7/25/03 | 1624.288 | 2030.503 |
| 7/28/03 | 1626.594 | 2035.839 |
| 7/29/03 | 1628.401 | 2051.477 |
| 7/30/03 | 1634.805 | 2048.814 |
| 7/31/03 | 1643.624 | 2062.194 |
| 8/1/03 | 1645.869 | 2079.427 |
| 8/4/03 | 1644.467 | 2087.074 |
| 8/5/03 | 1643.056 | 2093.11 |
| 8/6/03 | 1644.387 | 2107.493 |
| 8/7/03 | 1644.691 | 2103.313 |
| 8/8/03 | 1644.737 | 2106.074 |
| 8/11/03 | 1648.823 | 2113.107 |
| 8/12/03 | 1644.617 | 2093.919 |
| 8/13/03 | 1660.789 | 2100.057 |
| 8/14/03 | 1651.333 | 2093.995 |
| 8/15/03 | 1656.96 | 2089.562 |
| 8/18/03 | 1678.493 | 2119.357 |
| 8/19/03 | 1682.994 | 2117.52 |
| 8/20/03 | 1688.872 | 2139.567 |
| 8/21/03 | 1693.973 | 2162.969 |
| 8/22/03 | 1692.037 | 2154.662 |
| 8/25/03 | 1690.278 | 2173.077 |
| 8/26/03 | 1667.75 | 2158.907 |
| 8/27/03 | 1677.265 | 2167.642 |
| 8/28/03 | 1682.988 | 2148.103 |
| 8/29/03 | 1683.357 | 2146.307 |
| 9/1/03 | 1683.572 | 2170.237 |
| 9/2/03 | 1702.812 | 2208.125 |
| 9/3/03 | 1693.287 | 2213.216 |
| 9/4/03 | 1709.956 | 2214.378 |
| 9/5/03 | 1714.932 | 2211.7 |
| 9/8/03 | 1718.094 | 2198.779 |
| 9/9/03 | 1722.354 | 2173.387 |
| 9/10/03 | 1751.722 | 2191.857 |
| 9/11/03 | 1727.471 | 2174.625 |
| 9/12/03 | 1733.301 | 2186.188 |
| 9/15/03 | 1731.994 | 2171.667 |
| 9/16/03 | 1740.016 | 2149.547 |
| 9/17/03 | 1751.787 | 2167.152 |
| 9/18/03 | 1766.905 | 2178.343 |
| 9/19/03 | 1806.014 | 2198.82 |
| 9/22/03 | 1813.877 | 2198.312 |
| 9/23/03 | 1811.586 | 2178.162 |
| 9/24/03 | 1808.8 | 2177.205 |
| 9/25/03 | 1810.845 | 2171.648 |
| 9/26/03 | 1802.244 | 2167.538 |
| 9/29/03 | 1793.421 | 2159.454 |
| 9/30/03 | 1800.494 | 2191.467 |
| 10/1/03 | 1787.444 | 2180.436 |
| 10/2/03 | 1807.865 | 2192.979 |
| 10/3/03 | 1799.695 | 2197.247 |
| 10/6/03 | 1796.135 | 2183.918 |
| 10/7/03 | 1800.351 | 2190.589 |
| 10/8/03 | 1832.791 | 2236.871 |
| 10/9/03 | 1830.21 | 2255.497 |
| 10/10/03 | 1839.189 | 2276.77 |
| 10/13/03 | 1848.426 | 2280.635 |
| 10/14/03 | 1845.462 | 2286.48 |
| 10/15/03 | 1851.959 | 2285.865 |
| 10/16/03 | 1844.346 | 2268.328 |
| 10/17/03 | 1844.243 | 2263.824 |
| 10/20/03 | 1845.357 | 2255.42 |
| 10/21/03 | 1839.973 | 2260.905 |
| 10/22/03 | 1842.294 | 2266.76 |
| 10/23/03 | 1844.247 | 2274.476 |
| 10/24/03 | 1843.929 | 2250.657 |
| 10/27/03 | 1828.639 | 2250.054 |
| 10/28/03 | 1828.407 | 2256.493 |
| 10/29/03 | 1830.589 | 2272.735 |
| 10/30/03 | 1833.107 | 2285.45 |
| 10/31/03 | 1825.989 | 2285.628 |
| 11/3/03 | 1829.196 | 2269.312 |
| 11/4/03 | 1827.484 | 2263.458 |
| 11/5/03 | 1819.891 | 2244.756 |
| 11/6/03 | 1822.455 | 2257.768 |
| 11/7/03 | 1814.952 | 2251.518 |
| 11/10/03 | 1821.334 | 2264.175 |
| 11/11/03 | 1815.977 | 2270.208 |
| 11/12/03 | 1805.324 | 2263.043 |
| 11/13/03 | 1813.296 | 2256.993 |
| 11/14/03 | 1819.245 | 2240.444 |
| 11/17/03 | 1812.353 | 2232.917 |
| 11/18/03 | 1806.901 | 2224.21 |
| 11/19/03 | 1806.901 | 2208.955 |
| 11/20/03 | 1806.901 | 2194.559 |
| 11/21/03 | 1806.901 | 2179.094 |
| 11/24/03 | 1806.901 | 2168.822 |
| 11/25/03 | 1806.901 | 2158.072 |
| 11/26/03 | 1806.901 | 2171.368 |
| 11/27/03 | 1806.901 | 2189.79 |
| 11/28/03 | 1806.901 | 2202.745 |
| 12/1/03 | 1806.901 | 2197.109 |
| 12/2/03 | 1806.901 | 2198.686 |
| 12/3/03 | 1806.901 | 2203.341 |
| 12/4/03 | 1806.044 | 2194.987 |
| 12/5/03 | 1800.432 | 2194.942 |
| 12/8/03 | 1801.768 | 2192.94 |
| 12/9/03 | 1799.867 | 2178.051 |
| 12/10/03 | 1801.2 | 2178.335 |
| 12/11/03 | 1801.2 | 2148.508 |
| 12/12/03 | 1801.2 | 2159.21 |
| 12/15/03 | 1801.2 | 2166.096 |
| 12/16/03 | 1801.009 | 2177.161 |
| 12/17/03 | 1804.036 | 2179.943 |
| 12/18/03 | 1804.036 | 2170.75 |
| 12/19/03 | 1805.244 | 2175.236 |
| 12/22/03 | 1810.837 | 2167.965 |
| 12/23/03 | 1815.03 | 2162.21 |
| 12/24/03 | 1817.388 | 2169.757 |
| 12/29/03 | 1816.796 | 2186.989 |
| 12/30/03 | 1827.573 | 2195.757 |
| 12/31/03 | 1830.809 | 2205.652 |
| 1/2/04 | 1840.178 | 2203.839 |
| 1/5/04 | 1816.765 | 2178.53 |
| 1/6/04 | 1828.536 | 2197.149 |
| 1/7/04 | 1823.335 | 2186.561 |
| 1/8/04 | 1821.038 | 2181.24 |
| 1/9/04 | 1821.654 | 2176.44 |
| 1/12/04 | 1830.933 | 2188.153 |
| 1/13/04 | 1835.672 | 2171.043 |
| 1/14/04 | 1845.301 | 2165.082 |
| 1/15/04 | 1885.85 | 2197.493 |
| 1/16/04 | 1878.102 | 2194.78 |
| 1/19/04 | 1858.458 | 2171.658 |
| 1/20/04 | 1859.947 | 2166.19 |
| 1/21/04 | 1856.416 | 2174.943 |
| 1/22/04 | 1857.505 | 2184.998 |
| 1/23/04 | 1858.444 | 2190.347 |
| 1/27/04 | 1841.926 | 2181.507 |
| 1/28/04 | 1826.854 | 2150.814 |
| 1/29/04 | 1805.077 | 2135.891 |
| 1/30/04 | 1810.024 | 2118.162 |
| 2/2/04 | 1814.194 | 2130.957 |
| 2/3/04 | 1820.036 | 2126.589 |
| 2/4/04 | 1813.262 | 2114.069 |
| 2/5/04 | 1808.835 | 2114.574 |
| 2/6/04 | 1821.672 | 2120.7 |
| 2/9/04 | 1818.079 | 2104.429 |
| 2/10/04 | 1832.034 | 2117.154 |
| 2/11/04 | 1835.309 | 2148.883 |
| 2/12/04 | 1842.251 | 2160.516 |
| 2/13/04 | 1852.002 | 2176.147 |
| 2/16/04 | 1864.643 | 2154.67 |
| 2/17/04 | 1880.561 | 2171.754 |
| 2/18/04 | 1881.772 | 2194.283 |
| 2/19/04 | 1861.961 | 2191.148 |
| 2/20/04 | 1864.192 | 2176.623 |
| 2/23/04 | 1867.967 | 2163.982 |
| 2/24/04 | 1876.304 | 2134.965 |
| 2/25/04 | 1883.773 | 2140.438 |
| 2/26/04 | 1877.921 | 2129.399 |
| 2/27/04 | 1884.549 | 2138.393 |
| 3/1/04 | 1895.495 | 2146.482 |
| 3/2/04 | 1899.063 | 2140.879 |
| 3/3/04 | 1894.133 | 2125.105 |
| 3/4/04 | 1904.551 | 2127.115 |
| 3/5/04 | 1906.689 | 2119.995 |
| 3/8/04 | 1916.785 | 2131.972 |
| 3/9/04 | 1925.623 | 2149.992 |
| 3/10/04 | 1939.037 | 2154.976 |
| 3/11/04 | 1937.956 | 2156.099 |
| 3/12/04 | 1919.775 | 2142.629 |
| 3/15/04 | 1921.877 | 2124.118 |
| 3/16/04 | 1914.583 | 2117.879 |
| 3/17/04 | 1918.202 | 2141.21 |
| 3/18/04 | 1923.415 | 2133.862 |
| 3/19/04 | 1934.479 | 2154.993 |
| 3/22/04 | 1919.085 | 2129.444 |
| 3/23/04 | 1923.944 | 2134.844 |
| 3/24/04 | 1917.058 | 2138.998 |
| 3/25/04 | 1926.004 | 2134.853 |
| 3/26/04 | 1936.285 | 2147.92 |
| 3/29/04 | 1941.706 | 2151.534 |
| 3/30/04 | 1946.235 | 2143.333 |
| 3/31/04 | 1935.492 | 2156.711 |
| 4/1/04 | 1975.871 | 2177.393 |
| 4/2/04 | 1967.998 | 2166.824 |
| 4/5/04 | 1986.689 | 2180.064 |
| 4/6/04 | 1981.513 | 2189.7 |
| 4/7/04 | 1973.699 | 2192.243 |
| 4/8/04 | 1973.512 | 2196.575 |
| 4/13/04 | 1967.853 | 2202.339 |
| 4/14/04 | 1973.026 | 2187.316 |
| 4/15/04 | 1966.932 | 2164.461 |
| 4/16/04 | 1981.336 | 2177.406 |
| 4/19/04 | 1989.213 | 2161.133 |
| 4/20/04 | 1999.847 | 2164.095 |
| 4/21/04 | 2006.119 | 2141.234 |
| 4/22/04 | 1995.564 | 2123.271 |
| 4/23/04 | 2003.374 | 2110.651 |
| 4/26/04 | 2007.778 | 2108.242 |
| 4/27/04 | 2020.356 | 2116.406 |
| 4/28/04 | 2031.55 | 2123.575 |
| 4/29/04 | 2025.006 | 2107.321 |
| 4/30/04 | 2017.495 | 2097.847 |
| 5/3/04 | 2002.629 | 2083.172 |
| 5/4/04 | 1992.654 | 2077.475 |
| 5/5/04 | 2001.276 | 2079.944 |
| 5/6/04 | 2013.029 | 2082.175 |
| 5/7/04 | 2013.01 | 2070.905 |
| 5/10/04 | 1984.286 | 2059.524 |
| 5/11/04 | 1966.013 | 2051.767 |
| 5/12/04 | 1966.013 | 2054.987 |
| 5/13/04 | 1966.013 | 2055.249 |
| 5/14/04 | 1966.013 | 2055.291 |
| 5/17/04 | 1966.013 | 2054.041 |
| 5/18/04 | 1966.013 | 2042.448 |
| 5/19/04 | 1966.013 | 2053.125 |
| 5/20/04 | 1965.823 | 2049.959 |
| 5/21/04 | 1965.823 | 2044.317 |
| 5/24/04 | 1965.823 | 2039.896 |
| 5/25/04 | 1965.823 | 2028.14 |
| 5/26/04 | 1965.823 | 2042.884 |
| 5/27/04 | 1965.964 | 2045.295 |
| 5/28/04 | 1964.309 | 2048.681 |
| 5/31/04 | 1964.971 | 2053.791 |
| 6/1/04 | 1963.978 | 2044.58 |
| 6/2/04 | 1959.412 | 2049.381 |
| 6/3/04 | 1955.128 | 2040.693 |
| 6/4/04 | 1956.237 | 2042.644 |
| 6/7/04 | 1964.807 | 2048.196 |
| 6/8/04 | 1969.368 | 2047.328 |
| 6/9/04 | 1974.92 | 2044.705 |
| 6/10/04 | 1966.218 | 2039.252 |
| 6/11/04 | 1968.079 | 2044.498 |
| 6/15/04 | 1960.654 | 2041.971 |
| 6/16/04 | 1976.092 | 2057.528 |
| 6/17/04 | 1983.928 | 2069.569 |
| 6/18/04 | 1985.05 | 2070.081 |
| 6/21/04 | 1986.413 | 2062.328 |
| 6/22/04 | 1975.511 | 2060.701 |
| 6/23/04 | 1965.984 | 2055.175 |
| 6/24/04 | 1969 | 2048.711 |
| 6/25/04 | 1958.029 | 2046.047 |
| 6/28/04 | 1956.528 | 2042.57 |
| 6/29/04 | 1969.914 | 2063.227 |
| 6/30/04 | 1982.246 | 2079.842 |
| 7/1/04 | 2006.617 | 2095.985 |
| 7/2/04 | 1997.143 | 2097.369 |
| 7/5/04 | 2002.219 | 2104.267 |
| 7/6/04 | 2002.899 | 2102.505 |
| 7/7/04 | 2008.92 | 2104.139 |
| 7/8/04 | 2017.107 | 2106.897 |
| 7/9/04 | 2006.789 | 2100.999 |
| 7/12/04 | 2008.884 | 2094.691 |
| 7/13/04 | 1999.162 | 2085.517 |
| 7/14/04 | 2009.611 | 2100.049 |
| 7/15/04 | 2023.66 | 2105.672 |
| 7/16/04 | 2033.203 | 2120.629 |
| 7/19/04 | 2063.606 | 2159.067 |
| 7/20/04 | 2046.042 | 2147.003 |
| 7/21/04 | 2084.575 | 2204.419 |
| 7/22/04 | 2082.014 | 2205.188 |
| 7/23/04 | 2080.415 | 2209.442 |
| 7/26/04 | 2104.158 | 2214.885 |
| 7/27/04 | 2104.774 | 2219.013 |
| 7/28/04 | 2126.969 | 2243.724 |
| 7/29/04 | 2123.779 | 2240.432 |
| 7/30/04 | 2140.34 | 2260.025 |
| 8/2/04 | 2145.183 | 2265.902 |
| 8/3/04 | 2142.152 | 2295.812 |
| 8/4/04 | 2151.848 | 2288.979 |
| 8/5/04 | 2159.756 | 2257.881 |
| 8/6/04 | 2146.046 | 2241.35 |
| 8/9/04 | 2119.241 | 2210.307 |
| 8/10/04 | 2126.329 | 2225.856 |
| 8/11/04 | 2125.773 | 2235.622 |
| 8/12/04 | 2126.791 | 2231.454 |
| 8/13/04 | 2104.827 | 2209.519 |
| 8/16/04 | 2103.664 | 2204.684 |
| 8/17/04 | 2101.247 | 2198.239 |
| 8/18/04 | 2085.039 | 2179.89 |
| 8/19/04 | 2103.014 | 2180.891 |
| 8/20/04 | 2099.25 | 2204.38 |
| 8/23/04 | 2099.266 | 2199.421 |
| 8/24/04 | 2101.086 | 2199.067 |
| 8/25/04 | 2119.769 | 2231.774 |
| 8/26/04 | 2127.276 | 2254.465 |
| 8/27/04 | 2146.19 | 2272.119 |
| 8/30/04 | 2153.152 | 2293.71 |
| 8/31/04 | 2193.367 | 2346.266 |
| 9/1/04 | 2205.088 | 2342.633 |
| 9/2/04 | 2198.288 | 2339.017 |
| 9/3/04 | 2185.067 | 2335.02 |
| 9/6/04 | 2177.28 | 2321.532 |
| 9/7/04 | 2183.479 | 2305.157 |
| 9/8/04 | 2172.135 | 2303.585 |
| 9/9/04 | 2172.412 | 2295.793 |
| 9/10/04 | 2166.82 | 2289.775 |
| 9/13/04 | 2172.167 | 2314.246 |
| 9/14/04 | 2200.771 | 2349.499 |
| 9/15/04 | 2183.651 | 2328.517 |
| 9/16/04 | 2196.493 | 2343.882 |
| 9/17/04 | 2189.993 | 2347.545 |
| 9/20/04 | 2187.006 | 2360.578 |
| 9/21/04 | 2199.287 | 2388.149 |
| 9/22/04 | 2198.041 | 2374.207 |
| 9/23/04 | 2214.452 | 2386.414 |
| 9/24/04 | 2202.194 | 2369.291 |
| 9/27/04 | 2207.213 | 2367.588 |
| 9/28/04 | 2197.819 | 2372.649 |
| 9/29/04 | 2213.755 | 2418.92 |
| 9/30/04 | 2218.21 | 2411.993 |
| 10/1/04 | 2198.323 | 2392.441 |
| 10/4/04 | 2218.393 | 2428.298 |
| 10/5/04 | 2217.094 | 2397.469 |
| 10/6/04 | 2216.68 | 2395.428 |
| 10/7/04 | 2218.83 | 2382.791 |
| 10/8/04 | 2226.994 | 2390.289 |
| 10/11/04 | 2236.753 | 2409.003 |
| 10/12/04 | 2275.181 | 2430.354 |
| 10/13/04 | 2296.035 | 2458.055 |
| 10/14/04 | 2311.25 | 2470.159 |
| 10/15/04 | 2336.537 | 2492.45 |
| 10/18/04 | 2320.95 | 2495.5 |
| 10/19/04 | 2357.211 | 2512.731 |
| 10/20/04 | 2374.189 | 2517.319 |
| 10/21/04 | 2371.719 | 2498.504 |
| 10/22/04 | 2386.182 | 2522.789 |
| 10/25/04 | 2342.271 | 2514.679 |
| 10/26/04 | 2368.559 | 2534.86 |
| 10/27/04 | 2400.627 | 2595.33 |
| 10/28/04 | 2394.279 | 2590.622 |
| 10/29/04 | 2384.573 | 2597.442 |
| 11/1/04 | 2405.911 | 2630.133 |
| 11/2/04 | 2416.706 | 2640.21 |
| 11/3/04 | 2436.961 | 2643.092 |
| 11/4/04 | 2441.962 | 2656.803 |
| 11/5/04 | 2453.458 | 2628.763 |
| 11/8/04 | 2488.17 | 2667.428 |
| 11/9/04 | 2502.602 | 2673.298 |
| 11/10/04 | 2518.52 | 2720.35 |
| 11/11/04 | 2496.1 | 2717.502 |
| 11/12/04 | 2512.032 | 2741.626 |
| 11/15/04 | 2536.812 | 2728.523 |
| 11/16/04 | 2480.062 | 2666.077 |
| 11/17/04 | 2466.836 | 2636.834 |
| 11/18/04 | 2458.463 | 2651.237 |
| 11/19/04 | 2429.886 | 2628.749 |
| 11/22/04 | 2398.936 | 2595.417 |
| 11/23/04 | 2432.552 | 2604.403 |
| 11/24/04 | 2484.928 | 2656.131 |
| 11/25/04 | 2533.412 | 2672.886 |
| 11/26/04 | 2542.491 | 2658.958 |
| 11/29/04 | 2571.916 | 2664.489 |
| 11/30/04 | 2538.349 | 2638.912 |
| 12/1/04 | 2537.434 | 2647.003 |
| 12/2/04 | 2578.938 | 2673.188 |
| 12/3/04 | 2573.667 | 2670.384 |
| 12/6/04 | 2622.33 | 2671.912 |
| 12/7/04 | 2608.386 | 2668.961 |
| 12/8/04 | 2566.911 | 2658.074 |
| 12/9/04 | 2554.397 | 2635.307 |
| 12/10/04 | 2545.413 | 2640.324 |
| 12/13/04 | 2561.465 | 2634.511 |
| 12/14/04 | 2488.282 | 2660.771 |
| 12/15/04 | 2498.308 | 2661.972 |
| 12/16/04 | 2486.911 | 2671.747 |
| 12/17/04 | 2504.392 | 2701.364 |
| 12/20/04 | 2527.044 | 2677.648 |
| 12/21/04 | 2521.904 | 2660.284 |
| 12/22/04 | 2535.934 | 2661.698 |
| 12/23/04 | 2539.569 | 2680.773 |
| 12/24/04 | 2551.511 | 2682.766 |
| 12/29/04 | 2565.908 | 2708.653 |
| 12/30/04 | 2559.553 | 2725.728 |
| 12/31/04 | 2564.212 | 2723.437 |
| 1/4/05 | 2547.963 | 2726.48 |
| 1/5/05 | 2543.877 | 2720.71 |
| 1/6/05 | 2550.322 | 2736.309 |
| 1/7/05 | 2569.304 | 2784.044 |
| 1/10/05 | 2595.273 | 2810.848 |
| 1/11/05 | 2572.932 | 2836.77 |
| 1/12/05 | 2580.4 | 2837.796 |
| 1/13/05 | 2599.458 | 2852.853 |
| 1/14/05 | 2620.43 | 2839.954 |
| 1/17/05 | 2631.255 | 2862.029 |
| 1/18/05 | 2622.583 | 2891.364 |
| 1/19/05 | 2627.375 | 2892.358 |
| 1/20/05 | 2641.678 | 2895.826 |
| 1/21/05 | 2641.115 | 2909.106 |
| 1/24/05 | 2634.453 | 2928.273 |
| 1/25/05 | 2649.726 | 2941.99 |
| 1/27/05 | 2672.613 | 2956.171 |
| 1/28/05 | 2675.808 | 2952.255 |
| 1/31/05 | 2747.377 | 2967.948 |
| 2/1/05 | 2779.553 | 2969.893 |
| 2/2/05 | 2790.789 | 2979.7 |
| 2/3/05 | 2802.994 | 2972.554 |
| 2/4/05 | 2781.627 | 2983.984 |
| 2/7/05 | 2800.954 | 2980.425 |
| 2/8/05 | 2814.274 | 3003.572 |
| 2/9/05 | 2802.084 | 2993.648 |
| 2/10/05 | 2775.54 | 2954.956 |
| 2/11/05 | 2793.168 | 2973.807 |
| 2/14/05 | 2804.496 | 2970.572 |
| 2/15/05 | 2806.817 | 2956.811 |
| 2/16/05 | 2787.353 | 2953.329 |
| 2/17/05 | 2763.481 | 2945.735 |
| 2/18/05 | 2746.236 | 2949.162 |
| 2/21/05 | 2770.313 | 2977.665 |
| 2/22/05 | 2748.826 | 2960.195 |
| 2/23/05 | 2689.667 | 2913.452 |
| 2/24/05 | 2706.403 | 2893.32 |
| 2/25/05 | 2696.885 | 2877.551 |
| 2/28/05 | 2691.487 | 2929.529 |
| 3/1/05 | 2698.666 | 2926.449 |
| 3/2/05 | 2715.758 | 2928.774 |
| 3/3/05 | 2714.425 | 2910.025 |
| 3/4/05 | 2734.497 | 2905.277 |
| 3/7/05 | 2764.849 | 2944.915 |
| 3/8/05 | 2782.214 | 2995.662 |
| 3/9/05 | 2776.556 | 3045.561 |
| 3/10/05 | 2781.683 | 3052.672 |
| 3/11/05 | 2788.575 | 3024.011 |
| 3/14/05 | 2798.147 | 3001.783 |
| 3/15/05 | 2800.915 | 2992.158 |
| 3/16/05 | 2817.754 | 3009.542 |
| 3/17/05 | 2804.883 | 2990.618 |
| 3/18/05 | 2824.858 | 3000.079 |
| 3/21/05 | 2831.026 | 3016.864 |
| 3/22/05 | 2811.513 | 2995.301 |
| 3/23/05 | 2743.114 | 2931.891 |
| 3/24/05 | 2754.908 | 2900.531 |
| 3/29/05 | 2723.55 | 2862.976 |
| 3/30/05 | 2674.925 | 2854.506 |
| 3/31/05 | 2682.724 | 2888.169 |
| 4/1/05 | 2682.724 | 2909.487 |
| 4/4/05 | 2682.724 | 2907.086 |
| 4/5/05 | 2682.724 | 2907.174 |
| 4/6/05 | 2685.145 | 2900.903 |
| 4/7/05 | 2679.923 | 2894.083 |
| 4/8/05 | 2687.103 | 2890.933 |
| 4/11/05 | 2679.271 | 2879.684 |
| 4/12/05 | 2681.229 | 2895.783 |
| 4/13/05 | 2682.534 | 2886.691 |
| 4/14/05 | 2681.881 | 2868.95 |
| 4/15/05 | 2681.881 | 2825.594 |
| 4/18/05 | 2681.881 | 2782.19 |
| 4/19/05 | 2681.881 | 2788.299 |
| 4/20/05 | 2681.881 | 2796.575 |
| 4/21/05 | 2681.881 | 2795.289 |
| 4/22/05 | 2681.881 | 2797.218 |
| 4/26/05 | 2681.881 | 2797.218 |
| 4/27/05 | 2681.881 | 2789.154 |
| 4/28/05 | 2681.881 | 2788.332 |
| 4/29/05 | 2681.881 | 2787.808 |
| 5/2/05 | 2681.881 | 2784.83 |
| 5/3/05 | 2681.881 | 2782.841 |
| 5/4/05 | 2681.881 | 2780.911 |
| 5/5/05 | 2681.881 | 2787.403 |
| 5/6/05 | 2681.881 | 2788.451 |
| 5/9/05 | 2681.881 | 2797.516 |
| 5/10/05 | 2681.881 | 2799.267 |
| 5/11/05 | 2681.881 | 2792.954 |
| 5/12/05 | 2681.881 | 2790.964 |
| 5/13/05 | 2681.881 | 2791.024 |
| 5/16/05 | 2681.881 | 2789.737 |
| 5/17/05 | 2681.881 | 2787.748 |
| 5/18/05 | 2681.881 | 2794.764 |
| 5/19/05 | 2681.881 | 2801.721 |
| 5/20/05 | 2681.881 | 2790.321 |
| 5/23/05 | 2681.881 | 2804.639 |
| 5/24/05 | 2681.881 | 2806.27 |
| 5/25/05 | 2681.881 | 2796.979 |
| 5/26/05 | 2681.881 | 2797.563 |
| 5/27/05 | 2681.881 | 2793.763 |
| 5/30/05 | 2681.881 | 2794.466 |
| 5/31/05 | 2681.881 | 2819.885 |
| 6/1/05 | 2681.881 | 2820.469 |
| 6/2/05 | 2681.881 | 2827.485 |
| 6/3/05 | 2681.881 | 2829.295 |
| 6/6/05 | 2681.881 | 2834.965 |
| 6/7/05 | 2681.881 | 2831.809 |
| 6/8/05 | 2681.881 | 2833.096 |
| 6/9/05 | 2681.881 | 2831.809 |
| 6/10/05 | 2681.881 | 2833.798 |
| 6/14/05 | 2681.881 | 2843.507 |
| 6/15/05 | 2681.388 | 2848.785 |
| 6/16/05 | 2685.933 | 2865.183 |
| 6/17/05 | 2688.358 | 2862.667 |
| 6/20/05 | 2688.358 | 2864.537 |
| 6/21/05 | 2688.66 | 2870.648 |
| 6/22/05 | 2695.072 | 2874.263 |
| 6/23/05 | 2683.766 | 2853.233 |
| 6/24/05 | 2675.173 | 2843.427 |
| 6/27/05 | 2677.15 | 2851.213 |
| 6/28/05 | 2683.081 | 2847.925 |
| 6/29/05 | 2699.329 | 2874.818 |
| 6/30/05 | 2699.949 | 2875.505 |
| 7/1/05 | 2694.928 | 2867.062 |
| 7/4/05 | 2689.574 | 2856.882 |
| 7/5/05 | 2686.065 | 2849.27 |
| 7/6/05 | 2683.1 | 2842.301 |
| 7/7/05 | 2674.267 | 2839.093 |
| 7/8/05 | 2667.793 | 2831.592 |
| 7/11/05 | 2670.074 | 2828.314 |
| 7/12/05 | 2667.489 | 2812.823 |
| 7/13/05 | 2655.5 | 2810.336 |
| 7/14/05 | 2662.691 | 2815.427 |
| 7/15/05 | 2670.209 | 2818.907 |
| 7/18/05 | 2662.15 | 2810.431 |
| 7/19/05 | 2669.713 | 2814.052 |
| 7/20/05 | 2662.052 | 2804.034 |
| 7/21/05 | 2658.849 | 2801.9 |
| 7/22/05 | 2658.625 | 2806.152 |
| 7/25/05 | 2668.113 | 2813.931 |
| 7/26/05 | 2679.161 | 2817.502 |
| 7/27/05 | 2688.263 | 2831.84 |
| 7/28/05 | 2701.678 | 2843.522 |
| 7/29/05 | 2698.71 | 2842.991 |
| 8/1/05 | 2685.912 | 2831.36 |
| 8/2/05 | 2688.75 | 2841.991 |
| 8/3/05 | 2680.431 | 2842.737 |
| 8/4/05 | 2673.429 | 2825.739 |
| 8/5/05 | 2686.711 | 2839.774 |
| 8/8/05 | 2688.608 | 2835.405 |
| 8/9/05 | 2717.161 | 2868.866 |
| 8/10/05 | 2721.002 | 2866.638 |
| 8/11/05 | 2750.176 | 2891.648 |
| 8/12/05 | 2747.656 | 2884.426 |
| 8/15/05 | 2777.101 | 2913.542 |
| 8/16/05 | 2793.398 | 2935.343 |
| 8/17/05 | 2776.932 | 2917.647 |
| 8/18/05 | 2762.55 | 2900.42 |
| 8/19/05 | 2781.277 | 2932.182 |
| 8/22/05 | 2799.766 | 2953.107 |
| 8/23/05 | 2789.542 | 2944.191 |
| 8/24/05 | 2777.079 | 2929.806 |
| 8/25/05 | 2765.561 | 2932.471 |
| 8/26/05 | 2748.414 | 2918.863 |
| 8/29/05 | 2703.791 | 2873.629 |
| 8/30/05 | 2737.181 | 2900.025 |
| 8/31/05 | 2741.645 | 2915.451 |
| 9/1/05 | 2766.617 | 2934.98 |
| 9/2/05 | 2769.165 | 2939.71 |
| 9/5/05 | 2767.583 | 2921.051 |
| 9/6/05 | 2772.426 | 2923.01 |
| 9/7/05 | 2779.743 | 2930.002 |
| 9/8/05 | 2769.042 | 2927.058 |
| 9/9/05 | 2779.455 | 2926.911 |
| 9/12/05 | 2795.831 | 2954.954 |
| 9/13/05 | 2794.948 | 2968.971 |
| 9/14/05 | 2782.515 | 2962.354 |
| 9/15/05 | 2787.463 | 2953.56 |
| 9/16/05 | 2824.127 | 2969.341 |
| 9/19/05 | 2831.497 | 2976.403 |
| 9/20/05 | 2829.881 | 2969.347 |
| 9/21/05 | 2823.888 | 2959.158 |
| 9/22/05 | 2854.344 | 2971.977 |
| 9/23/05 | 2892.774 | 3006.442 |
| 9/26/05 | 2907.962 | 3021.254 |
| 9/27/05 | 2892.549 | 3014.983 |
| 9/28/05 | 2900.974 | 3016.449 |
| 9/29/05 | 2919.749 | 3025.775 |
| 9/30/05 | 2945.112 | 3041.179 |
| 10/3/05 | 2957.902 | 3041.885 |
| 10/4/05 | 2929.549 | 3021.966 |
| 10/5/05 | 2898.851 | 2990.924 |
| 10/6/05 | 2835.609 | 2923.165 |
| 10/7/05 | 2871.307 | 2953.121 |
| 10/10/05 | 2858.507 | 2943.148 |
| 10/11/05 | 2869.998 | 2948.92 |
| 10/12/05 | 2878.91 | 2967.087 |
| 10/13/05 | 2868.359 | 2955.13 |
| 10/14/05 | 2857.002 | 2937.601 |
| 10/17/05 | 2891.434 | 3002.244 |
| 10/18/05 | 2884.001 | 2987.177 |
| 10/19/05 | 2879.555 | 2958.222 |
| 10/20/05 | 2887.886 | 2937.644 |
| 10/21/05 | 2887.886 | 2938.226 |
| 10/24/05 | 2887.886 | 2911.961 |
| 10/25/05 | 2887.886 | 2937.711 |
| 10/26/05 | 2887.886 | 2967.523 |
| 10/27/05 | 2887.886 | 2970.488 |
| 10/28/05 | 2887.886 | 2960.039 |
| 10/31/05 | 2887.886 | 3008.459 |
| 11/1/05 | 2887.886 | 3018.229 |
| 11/2/05 | 2869.402 | 2993.929 |
| 11/3/05 | 2869.15 | 2975.424 |
| 11/4/05 | 2852.868 | 2959.986 |
| 11/7/05 | 2850.714 | 2950.384 |
| 11/8/05 | 2847.893 | 2956.614 |
| 11/9/05 | 2842.236 | 2991.67 |
| 11/10/05 | 2824.801 | 2966.138 |
| 11/11/05 | 2815.069 | 2976.878 |
| 11/14/05 | 2811.155 | 2995.461 |
| 11/15/05 | 2809.319 | 3001.054 |
| 11/16/05 | 2796.796 | 2975.026 |
| 11/17/05 | 2805.51 | 2958.203 |
| 11/18/05 | 2811.874 | 2971.254 |
| 11/21/05 | 2832.426 | 3034.565 |
| 11/22/05 | 2822.617 | 3045.327 |
| 11/23/05 | 2816.097 | 3037.444 |
| 11/24/05 | 2833.298 | 3065.395 |
| 11/25/05 | 2827.467 | 3083.399 |
| 11/28/05 | 2858.38 | 3133.954 |
| 11/29/05 | 2859.105 | 3115.911 |
| 11/30/05 | 2885.661 | 3175.857 |
| 12/1/05 | 2862.843 | 3164.781 |
| 12/2/05 | 2897.712 | 3170.378 |
| 12/5/05 | 2930.044 | 3235.016 |
| 12/6/05 | 2892.922 | 3194.688 |
| 12/7/05 | 2900.444 | 3206.331 |
| 12/8/05 | 2898.503 | 3149.189 |
| 12/9/05 | 2964.565 | 3197.511 |
| 12/12/05 | 2988.38 | 3240.031 |
| 12/13/05 | 2952.069 | 3171.666 |
| 12/14/05 | 2966.908 | 3133.651 |
| 12/15/05 | 2969.411 | 3112.755 |
| 12/16/05 | 3017.539 | 3162.606 |
| 12/19/05 | 3002.193 | 3144.025 |
| 12/20/05 | 3003.653 | 3150.171 |
| 12/21/05 | 2974.681 | 3122.096 |
| 12/22/05 | 2996.616 | 3131.962 |
| 12/23/05 | 3043.054 | 3166.869 |
| 12/28/05 | 3113.303 | 3206.068 |
| 12/29/05 | 3166.968 | 3218.373 |
| 12/30/05 | 3195.75 | 3235.454 |
| 1/3/06 | 3178.102 | 3237.601 |
| 1/4/06 | 3179.302 | 3236.128 |
| 1/5/06 | 3130.176 | 3252.645 |
| 1/6/06 | 3138.102 | 3271.122 |
| 1/9/06 | 3173.444 | 3297.07 |
| 1/10/06 | 3198.982 | 3298.013 |
| 1/11/06 | 3181.639 | 3273.848 |
| 1/12/06 | 3203.823 | 3252.696 |
| 1/13/06 | 3209.008 | 3284.143 |
| 1/16/06 | 3235.058 | 3269.806 |
| 1/17/06 | 3281.262 | 3345.539 |
| 1/18/06 | 3204.626 | 3313.612 |
| 1/19/06 | 3242.876 | 3367.629 |
| 1/20/06 | 3308.645 | 3358.142 |
| 1/23/06 | 3286.628 | 3325.282 |
| 1/24/06 | 3326.186 | 3360.602 |
| 1/25/06 | 3299.405 | 3329.114 |
| 1/27/06 | 3338.161 | 3356.278 |
| 1/30/06 | 3351.901 | 3400.414 |
| 1/31/06 | 3373.997 | 3413.371 |
| 2/1/06 | 3357.803 | 3404.876 |
| 2/2/06 | 3367.725 | 3445.416 |
| 2/3/06 | 3355.328 | 3445.408 |
| 2/6/06 | 3407.854 | 3494.704 |
| 2/7/06 | 3444.151 | 3564.18 |
| 2/8/06 | 3328.09 | 3519.468 |
| 2/9/06 | 3350.358 | 3511.633 |
| 2/10/06 | 3423.025 | 3549.682 |
| 2/13/06 | 3404.004 | 3552.627 |
| 2/14/06 | 3361.071 | 3562.513 |
| 2/15/06 | 3433.699 | 3578.438 |
| 2/16/06 | 3449.049 | 3560.851 |
| 2/17/06 | 3457.289 | 3560.694 |
| 2/20/06 | 3529.357 | 3628.089 |
| 2/21/06 | 3541.539 | 3599.255 |
| 2/22/06 | 3521.611 | 3643.8 |
| 2/23/06 | 3640.034 | 3720.917 |
| 2/24/06 | 3642.383 | 3708.03 |
| 2/27/06 | 3700.64 | 3715.142 |
| 2/28/06 | 3673.154 | 3732.909 |
| 3/1/06 | 3634.351 | 3706.474 |
| 3/2/06 | 3665.257 | 3752.802 |
| 3/3/06 | 3711.734 | 3768.298 |
| 3/6/06 | 3812.906 | 3846.582 |
| 3/7/06 | 3808.496 | 3818.529 |
| 3/8/06 | 3783.447 | 3816.154 |
| 3/9/06 | 3777.645 | 3785.039 |
| 3/10/06 | 3777.919 | 3798.186 |
| 3/13/06 | 3839.014 | 3837.272 |
| 3/14/06 | 3807.604 | 3851.166 |
| 3/15/06 | 3778.027 | 3764.758 |
| 3/16/06 | 3814.536 | 3810.368 |
| 3/17/06 | 3841.98 | 3794.555 |
| 3/20/06 | 3912.014 | 3850.848 |
| 3/21/06 | 3889.642 | 3849.237 |
| 3/22/06 | 3911.119 | 3869.252 |
| 3/23/06 | 3923.257 | 3868.443 |
| 3/24/06 | 3980.254 | 3932.255 |
| 3/27/06 | 4086.164 | 3992.088 |
| 3/28/06 | 4120.784 | 4038.403 |
| 3/29/06 | 4112.714 | 4079.534 |
| 3/30/06 | 4173.52 | 4102.457 |
| 3/31/06 | 4181.627 | 4171.267 |
| 4/3/06 | 4149.566 | 4172.057 |
| 4/4/06 | 4120.927 | 4172.267 |
| 4/5/06 | 4129.37 | 4173.855 |
| 4/6/06 | 4110.39 | 4199.977 |
| 4/7/06 | 4140.81 | 4208.788 |
| 4/10/06 | 4100.601 | 4179.43 |
| 4/11/06 | 4235.819 | 4163.858 |
| 4/12/06 | 4254.314 | 4199.121 |
| 4/13/06 | 4250.602 | 4171.759 |
| 4/18/06 | 4310.116 | 4196.064 |
| 4/19/06 | 4376.346 | 4184.617 |
| 4/20/06 | 4413.761 | 4193.163 |
| 4/21/06 | 4364.559 | 4161.081 |
| 4/24/06 | 4390.449 | 4197.121 |
| 4/26/06 | 4495.55 | 4317.187 |
| 4/27/06 | 4491.312 | 4269.813 |
| 4/28/06 | 4403.83 | 4231.033 |
| 5/1/06 | 4541.166 | 4319.565 |
| 5/2/06 | 4535.626 | 4279.394 |
| 5/3/06 | 4512.925 | 4313.832 |
| 5/4/06 | 4412.699 | 4269.623 |
| 5/5/06 | 4470.567 | 4390.494 |
| 5/8/06 | 4534.577 | 4494.506 |
| 5/9/06 | 4534.804 | 4566.454 |
| 5/10/06 | 4604.377 | 4682.307 |
| 5/11/06 | 4602.528 | 4640.676 |
| 5/12/06 | 4605.878 | 4699.831 |
| 5/15/06 | 4473.927 | 4550.46 |
| 5/16/06 | 4309.299 | 4397.537 |
| 5/17/06 | 4399.245 | 4483.905 |
| 5/18/06 | 4246.217 | 4294.631 |
| 5/19/06 | 4253.304 | 4278.144 |
| 5/22/06 | 4088.942 | 4197.601 |
| 5/23/06 | 4047.67 | 3988.866 |
| 5/24/06 | 4047.67 | 3999.182 |
| 5/25/06 | 4047.67 | 4005.949 |
| 5/26/06 | 4047.67 | 3991.479 |
| 5/29/06 | 4047.67 | 4056.153 |
| 5/30/06 | 4047.67 | 4011.916 |
| 5/31/06 | 4050.091 | 4008.851 |
| 6/1/06 | 4054.269 | 4015.035 |
| 6/2/06 | 4054.269 | 4036.407 |
| 6/5/06 | 4052.451 | 4031.773 |
| 6/6/06 | 4052.451 | 4047.221 |
| 6/7/06 | 4052.451 | 4043.1 |
| 6/8/06 | 4052.451 | 4031.491 |
| 6/9/06 | 4042.623 | 4020.503 |
| 6/13/06 | 4042.623 | 4026.428 |
| 6/14/06 | 4042.623 | 3991.834 |
| 6/15/06 | 4042.623 | 4004.556 |
| 6/16/06 | 4042.623 | 4006.063 |
| 6/19/06 | 4042.623 | 4013.346 |
| 6/20/06 | 4042.623 | 4005.024 |
| 6/21/06 | 4042.623 | 3998.615 |
| 6/22/06 | 4042.623 | 4000.746 |
| 6/23/06 | 4042.623 | 4012.535 |
| 6/26/06 | 4042.623 | 4013.727 |
| 6/27/06 | 4042.623 | 4019.897 |
| 6/28/06 | 4042.623 | 4014.088 |
| 6/29/06 | 4042.623 | 4030.683 |
| 6/30/06 | 4042.623 | 4054.604 |
| 7/3/06 | 4042.623 | 4030.771 |
| 7/4/06 | 4042.623 | 3991.633 |
| 7/5/06 | 4042.623 | 4003.994 |
| 7/6/06 | 4042.623 | 4011.633 |
| 7/7/06 | 4042.623 | 4014.833 |
| 7/10/06 | 4042.623 | 4009.33 |
| 7/11/06 | 4042.623 | 4004.814 |
| 7/12/06 | 4042.623 | 3998.15 |
| 7/13/06 | 4042.623 | 4000.901 |
| 7/14/06 | 4042.623 | 3989.224 |
| 7/17/06 | 4042.623 | 3993.741 |
| 7/18/06 | 4042.623 | 3992.082 |
| 7/19/06 | 4042.623 | 4000.901 |
| 7/20/06 | 4042.623 | 3995.633 |
| 7/21/06 | 4042.623 | 3979.243 |
| 7/24/06 | 4042.623 | 3979.243 |
| 7/25/06 | 4042.623 | 3979.833 |
| 7/26/06 | 4042.623 | 3985.101 |
| 7/27/06 | 4042.623 | 3984.984 |
| 7/28/06 | 4042.623 | 3986.906 |
| 7/31/06 | 4042.623 | 3988.448 |
| 8/1/06 | 4042.623 | 4001.213 |
| 8/2/06 | 4042.623 | 4000.885 |
| 8/3/06 | 4042.623 | 3997.013 |
| 8/4/06 | 4042.623 | 4000.252 |
| 8/7/06 | 4042.623 | 4008.681 |
| 8/8/06 | 4042.623 | 4012.369 |
| 8/9/06 | 4042.623 | 4009.472 |
| 8/10/06 | 4042.623 | 4011.053 |
| 8/11/06 | 4042.623 | 4011.053 |
| 8/14/06 | 4042.623 | 4007.891 |
| 8/15/06 | 4042.623 | 4009.472 |
| 8/16/06 | 4042.623 | 4008.418 |
| 8/17/06 | 4042.623 | 4011.052 |
| 8/18/06 | 4049.148 | 4004.824 |
| 8/21/06 | 4054.156 | 4009.003 |
| 8/22/06 | 4078.085 | 4034.061 |
| 8/23/06 | 4044.731 | 4005.219 |
| 8/24/06 | 4018.134 | 3987.396 |
| 8/25/06 | 4029.927 | 4035.396 |
| 8/28/06 | 4029.927 | 4031.845 |
| 8/29/06 | 4029.927 | 4045.982 |
| 8/30/06 | 4029.927 | 4022.236 |
| 8/31/06 | 4029.927 | 4072.578 |
| 9/1/06 | 4029.927 | 4068.441 |
| 9/4/06 | 4029.927 | 4094.17 |
| 9/5/06 | 4007.708 | 4071.715 |
| 9/6/06 | 3993.021 | 4032.601 |
| 9/7/06 | 4015.058 | 4045.83 |
| 9/8/06 | 4029.22 | 4049.454 |
| 9/11/06 | 4039.316 | 4015.308 |
| 9/12/06 | 4032.927 | 3970.264 |
| 9/13/06 | 4034.28 | 3982.369 |
| 9/14/06 | 4034.28 | 4002.186 |
| 9/15/06 | 4034.28 | 3958.269 |
| 9/18/06 | 4030.774 | 3940.416 |
| 9/19/06 | 4032.984 | 3927.996 |
| 9/20/06 | 4034.25 | 3919.206 |
| 9/21/06 | 4030.761 | 3932.862 |
| 9/22/06 | 4030.761 | 3918.881 |
| 9/25/06 | 4030.761 | 3918.05 |
| 9/26/06 | 4030.761 | 3920.928 |
| 9/27/06 | 4030.761 | 3955.26 |
| 9/28/06 | 4030.571 | 3995.367 |
| 9/29/06 | 4041.781 | 4041.219 |
| 10/2/06 | 4065.265 | 4035.781 |
| 10/3/06 | 4041.13 | 4027.977 |
| 10/4/06 | 4040.444 | 4010.811 |
| 10/5/06 | 4046.115 | 4054.948 |
| 10/6/06 | 4062.482 | 4045.701 |
| 10/9/06 | 4076.037 | 4044.438 |
| 10/10/06 | 4095.118 | 4081.004 |
| 10/11/06 | 4109.794 | 4106.772 |
| 10/12/06 | 4131.503 | 4072.757 |
| 10/13/06 | 4107.143 | 4083.637 |
| 10/16/06 | 4102.599 | 4083.165 |
| 10/17/06 | 4106.42 | 4048.76 |
| 10/18/06 | 4125.608 | 4068.48 |
| 10/19/06 | 4150.435 | 4059.574 |
| 10/20/06 | 4142.664 | 4074.574 |
| 10/23/06 | 4169.694 | 4096.234 |
| 10/24/06 | 4217.869 | 4104.945 |
| 10/25/06 | 4207.958 | 4117.207 |
| 10/26/06 | 4283.62 | 4128.388 |
| 10/27/06 | 4303.599 | 4105.507 |
| 10/30/06 | 4329.937 | 4125.261 |
| 10/31/06 | 4318.955 | 4141.332 |
| 11/1/06 | 4341.586 | 4146.186 |
| 11/2/06 | 4332.397 | 4159.802 |
| 11/3/06 | 4337.026 | 4161.984 |
| 11/6/06 | 4378.219 | 4160.153 |
| 11/7/06 | 4452.873 | 4180.579 |
| 11/8/06 | 4421.552 | 4169.39 |
| 11/9/06 | 4398.602 | 4165.515 |
| 11/10/06 | 4372.493 | 4159.596 |
| 11/13/06 | 4324.353 | 4148.289 |
| 11/14/06 | 4303.96 | 4189.908 |
| 11/15/06 | 4294.36 | 4191.153 |
| 11/16/06 | 4273.602 | 4187.154 |
| 11/17/06 | 4329.186 | 4190.552 |
| 11/20/06 | 4315.79 | 4193.341 |
| 11/21/06 | 4379.201 | 4213.137 |
| 11/22/06 | 4371.156 | 4219.325 |
| 11/23/06 | 4381.37 | 4241.316 |
| 11/24/06 | 4392.697 | 4215.931 |
| 11/27/06 | 4441.75 | 4193.299 |
| 11/28/06 | 4428.593 | 4170.299 |
| 11/29/06 | 4464.216 | 4219.235 |
| 11/30/06 | 4462.33 | 4230.109 |
| 12/1/06 | 4474.323 | 4224.458 |
| 12/4/06 | 4490.311 | 4252.573 |
| 12/5/06 | 4465.567 | 4284.85 |
| 12/6/06 | 4473.58 | 4316.284 |
| 12/7/06 | 4487.089 | 4321.205 |
| 12/8/06 | 4428.61 | 4283.967 |
| 12/11/06 | 4419.406 | 4293.352 |
| 12/12/06 | 4460.869 | 4311.201 |
| 12/13/06 | 4481.488 | 4320.956 |
| 12/14/06 | 4497.722 | 4353.817 |
| 12/15/06 | 4493.326 | 4339.349 |
| 12/18/06 | 4587.688 | 4384.837 |
| 12/19/06 | 4546.007 | 4406.98 |
| 12/20/06 | 4560.627 | 4465.931 |
| 12/21/06 | 4565.693 | 4438.648 |
| 12/22/06 | 4559.558 | 4460.047 |
| 12/27/06 | 4624.71 | 4494.228 |
| 12/28/06 | 4656.319 | 4457.097 |
| 12/29/06 | 4726.764 | 4501.63 |
| 1/2/07 | 4805.27 | 4503.249 |
| 1/3/07 | 4844.549 | 4515.094 |
| 1/4/07 | 4804.469 | 4484.829 |
| 1/5/07 | 4805.665 | 4502.03 |
| 1/8/07 | 4821.238 | 4488.331 |
| 1/9/07 | 4825.949 | 4486.362 |
| 1/10/07 | 4753.503 | 4470.603 |
| 1/11/07 | 4733.673 | 4471.329 |
| 1/12/07 | 4758.025 | 4539.847 |
| 1/15/07 | 4809.605 | 4573.499 |
| 1/16/07 | 4860.574 | 4582.587 |
| 1/17/07 | 4842.708 | 4567.332 |
| 1/18/07 | 4861.393 | 4546.321 |
| 1/19/07 | 4845.587 | 4570.513 |
| 1/22/07 | 4917.79 | 4630.642 |
| 1/23/07 | 4920.312 | 4646.617 |
| 1/24/07 | 4958.197 | 4603.892 |
| 1/25/07 | 5012.718 | 4622.525 |
| 1/29/07 | 5066.961 | 4620.175 |
| 1/30/07 | 5084.217 | 4673.723 |
| 1/31/07 | 5090.688 | 4702.453 |
| 2/1/07 | 5091.243 | 4670.533 |
| 2/2/07 | 5159.166 | 4690.698 |
| 2/5/07 | 5160.151 | 4654.362 |
| 2/6/07 | 5143.408 | 4649.253 |
| 2/7/07 | 5106.995 | 4655.968 |
| 2/8/07 | 5109.135 | 4649.536 |
| 2/9/07 | 5170.698 | 4633.354 |
| 2/12/07 | 5126.642 | 4656.442 |
| 2/13/07 | 5167.495 | 4675.228 |
| 2/14/07 | 5216.953 | 4697.374 |
| 2/15/07 | 5258.563 | 4699.651 |
| 2/16/07 | 5252.559 | 4686.279 |
| 2/19/07 | 5308.062 | 4768.014 |
| 2/20/07 | 5331.104 | 4750.709 |
| 2/21/07 | 5267.687 | 4703.558 |
| 2/22/07 | 5287.174 | 4718.474 |
| 2/23/07 | 5313.017 | 4763.52 |
| 2/26/07 | 5315.897 | 4695.406 |
| 2/27/07 | 5584.136 | 4700.97 |
| 2/28/07 | 5428.138 | 4579.609 |
| 3/1/07 | 5487.035 | 4599.027 |
| 3/2/07 | 5511.18 | 4597.091 |
| 3/5/07 | 5244.854 | 4506.567 |
| 3/6/07 | 5341.074 | 4547.304 |
| 3/7/07 | 5464.214 | 4597.142 |
| 3/8/07 | 5456.53 | 4591.971 |
| 3/9/07 | 5457.967 | 4594.328 |
| 3/12/07 | 5506.077 | 4608.244 |
| 3/13/07 | 5564.011 | 4599.292 |
| 3/14/07 | 5448.263 | 4521.492 |
| 3/15/07 | 5536.274 | 4564.481 |
| 3/16/07 | 5595.575 | 4588.725 |
| 3/19/07 | 5553.829 | 4604.507 |
| 3/20/07 | 5621.639 | 4646.97 |
| 3/21/07 | 5606.27 | 4645.567 |
| 3/22/07 | 5651.58 | 4695.81 |
| 3/23/07 | 5649.714 | 4665.444 |
| 3/26/07 | 5677.967 | 4689.036 |
| 3/27/07 | 5716.759 | 4660.898 |
| 3/28/07 | 5693.751 | 4647.009 |
| 3/29/07 | 5695.692 | 4666.081 |
| 3/30/07 | 5694.829 | 4663.166 |
| 4/2/07 | 5700.279 | 4681.227 |
| 4/3/07 | 5749.088 | 4703.319 |
| 4/4/07 | 5781.339 | 4747.955 |
| 4/5/07 | 5828.891 | 4746.454 |
| 4/10/07 | 5871.741 | 4788.732 |
| 4/11/07 | 6001.895 | 4790.941 |
| 4/12/07 | 6037.83 | 4814.51 |
| 4/13/07 | 6026.299 | 4775.062 |
| 4/16/07 | 6035.814 | 4785.976 |
| 4/17/07 | 5987.411 | 4789.006 |
| 4/18/07 | 5967.583 | 4841.195 |
| 4/19/07 | 5968.972 | 4826.632 |
| 4/20/07 | 6041.096 | 4853.051 |
| 4/23/07 | 6090.596 | 4885.457 |
| 4/24/07 | 6045.492 | 4917.716 |
| 4/26/07 | 6137.057 | 4929.496 |
| 4/27/07 | 6111.668 | 4876.644 |
| 4/30/07 | 6211.319 | 4894.798 |
| 5/1/07 | 6159.767 | 4905.349 |
| 5/2/07 | 6214.413 | 4994.196 |
| 5/3/07 | 6219.517 | 4956.685 |
| 5/4/07 | 6235.497 | 4969.743 |
| 5/7/07 | 6310.822 | 4979.783 |
| 5/8/07 | 6262.741 | 4982.514 |
| 5/9/07 | 6274.023 | 4957.669 |
| 5/10/07 | 6297.71 | 4953.626 |
| 5/11/07 | 6256.944 | 4942.749 |
| 5/14/07 | 6258.355 | 4963.052 |
| 5/15/07 | 6179.022 | 4966.119 |
| 5/16/07 | 6229.043 | 4975.351 |
| 5/17/07 | 6166.992 | 4986.683 |
| 5/18/07 | 6142.172 | 4986.828 |
| 5/21/07 | 6154.966 | 4987.764 |
| 5/22/07 | 6248.541 | 4989.338 |
| 5/23/07 | 6224.612 | 5019.127 |
| 5/24/07 | 6181.492 | 4953.848 |
| 5/25/07 | 6141.894 | 4921.563 |
| 5/28/07 | 6159.339 | 4895.861 |
| 5/29/07 | 6241.652 | 4959.451 |
| 5/30/07 | 6245.051 | 4959.042 |
| 5/31/07 | 6224.4 | 4935.675 |
| 6/1/07 | 6177.324 | 4922.31 |
| 6/4/07 | 6131.517 | 4985.702 |
| 6/5/07 | 6025.312 | 4954.614 |
| 6/6/07 | 5996.46 | 4946.054 |
| 6/7/07 | 5938.277 | 4973.507 |
| 6/8/07 | 5923.699 | 4931.028 |
| 6/12/07 | 5984.524 | 5013.148 |
| 6/13/07 | 5964.917 | 4963.421 |
| 6/14/07 | 5982.088 | 4972.521 |
| 6/15/07 | 5964.021 | 4904.151 |
| 6/18/07 | 6017.036 | 4918.104 |
| 6/19/07 | 6017.553 | 4884.29 |
| 6/20/07 | 6111.939 | 4959.924 |
| 6/21/07 | 6119.308 | 4956.541 |
| 6/22/07 | 6147.992 | 5004.008 |
| 6/25/07 | 6083.391 | 4945.841 |
| 6/26/07 | 6123.167 | 4923.108 |
| 6/27/07 | 6127.825 | 4945.718 |
| 6/28/07 | 6163.316 | 5056.583 |
| 6/29/07 | 6194.544 | 5020.538 |
| 7/2/07 | 6125.411 | 4986.366 |
| 7/3/07 | 6185.63 | 4944.919 |
| 7/4/07 | 6195.618 | 4944.048 |
| 7/5/07 | 6204.38 | 4919.796 |
| 7/6/07 | 6225.014 | 4936.18 |
| 7/9/07 | 6187.182 | 5001.209 |
| 7/10/07 | 6196.446 | 5038.429 |
| 7/11/07 | 6163.254 | 4932.87 |
| 7/12/07 | 6180.852 | 4980.706 |
| 7/13/07 | 6236.85 | 5050.1 |
| 7/16/07 | 6223.914 | 5063.015 |
| 7/17/07 | 6195.315 | 5045.305 |
| 7/18/07 | 6191.731 | 5053.454 |
| 7/19/07 | 6259.84 | 5095.432 |
| 7/20/07 | 6323.355 | 5136.429 |
| 7/23/07 | 6305.348 | 5132.528 |
| 7/24/07 | 6301.208 | 5175.898 |
| 7/25/07 | 6242.884 | 5089.736 |
| 7/26/07 | 6261.483 | 5143.434 |
| 7/27/07 | 6193.212 | 5044.009 |
| 7/30/07 | 6128.713 | 5032.211 |
| 7/31/07 | 6128.713 | 5137.225 |
| 8/1/07 | 6128.713 | 5025.181 |
| 8/2/07 | 6128.713 | 5112.944 |
| 8/3/07 | 6128.713 | 5071.127 |
| 8/6/07 | 6128.713 | 4922.667 |
| 8/7/07 | 6128.713 | 4900.699 |
| 8/8/07 | 6128.713 | 4899.173 |
| 8/9/07 | 6128.713 | 4947.57 |
| 8/10/07 | 6128.713 | 4856.089 |
| 8/13/07 | 6128.713 | 4810.833 |
| 8/14/07 | 6128.713 | 4714.454 |
| 8/15/07 | 6128.713 | 4571.972 |
| 8/16/07 | 6128.713 | 4517.859 |
| 8/17/07 | 6128.713 | 4532.924 |
| 8/20/07 | 6128.713 | 4534.431 |
| 8/21/07 | 6128.713 | 4523.885 |
| 8/22/07 | 6128.713 | 4520.872 |
| 8/23/07 | 6128.713 | 4538.95 |
| 8/24/07 | 6128.713 | 4543.47 |
| 8/27/07 | 6128.713 | 4555.522 |
| 8/28/07 | 6128.713 | 4547.989 |
| 8/29/07 | 6128.713 | 4540.457 |
| 8/30/07 | 6128.713 | 4538.95 |
| 8/31/07 | 6128.713 | 4563.055 |
| 9/3/07 | 6128.713 | 4564.561 |
| 9/4/07 | 6147.536 | 4569.442 |
| 9/5/07 | 6169.41 | 4573.639 |
| 9/6/07 | 6141.829 | 4545.593 |
| 9/7/07 | 6143.384 | 4557.307 |
| 9/10/07 | 6142.429 | 4549.037 |
| 9/11/07 | 6160.419 | 4573.387 |
| 9/12/07 | 6160.419 | 4558.188 |
| 9/13/07 | 6160.419 | 4541.621 |
| 9/14/07 | 6160.419 | 4548.791 |
| 9/17/07 | 6160.419 | 4529.961 |
| 9/18/07 | 6167.476 | 4521.216 |
| 9/19/07 | 6174.724 | 4578.833 |
| 9/20/07 | 6174.724 | 4655.543 |
| 9/21/07 | 6174.724 | 4613.301 |
| 9/24/07 | 6174.724 | 4617.795 |
| 9/25/07 | 6174.724 | 4626.105 |
| 9/26/07 | 6164.243 | 4646.922 |
| 9/27/07 | 6159.685 | 4639.031 |
| 9/28/07 | 6166.918 | 4665.049 |
| 10/1/07 | 6182.354 | 4687.838 |
| 10/2/07 | 6215.217 | 4721.669 |
| 10/3/07 | 6194.926 | 4719.071 |
| 10/4/07 | 6187.342 | 4595.832 |
| 10/5/07 | 6182.067 | 4624.241 |
| 10/8/07 | 6163.563 | 4622.164 |
| 10/9/07 | 6190.24 | 4622.677 |
| 10/10/07 | 6179.853 | 4645.033 |
| 10/11/07 | 6204.282 | 4671.184 |
| 10/12/07 | 6175.147 | 4668.522 |
| 10/15/07 | 6180.554 | 4681.504 |
| 10/16/07 | 6213.921 | 4688.771 |
| 10/17/07 | 6195.649 | 4697.348 |
| 10/18/07 | 6155.383 | 4717.184 |
| 10/19/07 | 6155.578 | 4687.711 |
| 10/22/07 | 6105.841 | 4588.891 |
| 10/23/07 | 6122.633 | 4646.023 |
| 10/24/07 | 6105.91 | 4617.189 |
| 10/25/07 | 6140.562 | 4680.575 |
| 10/26/07 | 6156.735 | 4699.112 |
| 10/29/07 | 6254.506 | 4787.004 |
| 10/30/07 | 6240.998 | 4779.892 |
| 10/31/07 | 6247.041 | 4819.979 |
| 11/1/07 | 6279.694 | 4896.185 |
| 11/2/07 | 6221.882 | 4813.492 |
| 11/5/07 | 6226.241 | 4809.085 |
| 11/6/07 | 6208.948 | 4771.292 |
| 11/7/07 | 6219.859 | 4846.71 |
| 11/8/07 | 6256.892 | 4809.837 |
| 11/9/07 | 6265.434 | 4826.431 |
| 11/12/07 | 6224.971 | 4758.9 |
| 11/13/07 | 6183.639 | 4737.303 |
| 11/14/07 | 6218.485 | 4771.3 |
| 11/15/07 | 6295.909 | 4846.625 |
| 11/16/07 | 6182.217 | 4778.454 |
| 11/19/07 | 6315.513 | 4869.941 |
| 11/20/07 | 6235.1 | 4784.23 |
| 11/21/07 | 6248.545 | 4779.268 |
| 11/22/07 | 6123.665 | 4737.015 |
| 11/23/07 | 6154.957 | 4774.926 |
| 11/26/07 | 6176.873 | 4859.082 |
| 11/27/07 | 6170.376 | 4817.399 |
| 11/28/07 | 6136.199 | 4797.107 |
| 11/29/07 | 6122.33 | 4859.825 |
| 11/30/07 | 6125.271 | 4888.235 |
| 12/3/07 | 6140.838 | 4878.687 |
| 12/4/07 | 6300.191 | 4988.69 |
| 12/5/07 | 6315.895 | 5073.811 |
| 12/6/07 | 6315.842 | 5093.14 |
| 12/7/07 | 6314.698 | 5101.591 |
| 12/10/07 | 6362.308 | 5095.994 |
| 12/11/07 | 6384.843 | 5124.409 |
| 12/12/07 | 6375.022 | 5147.064 |
| 12/13/07 | 6411.286 | 5183.985 |
| 12/14/07 | 6381.387 | 5166.283 |
| 12/17/07 | 6327.072 | 4962.848 |
| 12/18/07 | 6289.576 | 4934.76 |
| 12/19/07 | 6289.576 | 4952.917 |
| 12/20/07 | 6289.576 | 4948.495 |
| 12/21/07 | 6289.576 | 4944.398 |
| 12/24/07 | 6289.576 | 5033.865 |
| 12/27/07 | 6289.576 | 5064.007 |
| 12/28/07 | 6289.576 | 5045.918 |
| 12/31/07 | 6289.576 | 5072.892 |
| 1/2/08 | 6289.576 | 5091.41 |
| 1/3/08 | 6289.576 | 5083.42 |
| 1/4/08 | 6289.576 | 5072.471 |
| 1/7/08 | 6289.576 | 4984.225 |
| 1/8/08 | 6289.576 | 4934.862 |
| 1/9/08 | 6289.576 | 4840.246 |
| 1/10/08 | 6289.576 | 4823.957 |
| 1/11/08 | 6289.576 | 4789.349 |
| 1/14/08 | 6289.576 | 4760.503 |
| 1/15/08 | 6289.576 | 4773.529 |
| 1/16/08 | 6289.576 | 4709.116 |
| 1/17/08 | 6289.576 | 4709.19 |
| 1/18/08 | 6289.576 | 4687.221 |
| 1/21/08 | 6289.576 | 4670.196 |
| 1/22/08 | 6289.576 | 4545.114 |
| 1/23/08 | 6289.576 | 4590.764 |
| 1/24/08 | 6289.576 | 4597.845 |
| 1/25/08 | 6289.576 | 4597.845 |
| 1/29/08 | 6289.576 | 4597.845 |
| 1/30/08 | 6289.576 | 4597.845 |
| 1/31/08 | 6289.576 | 4597.845 |
| 2/1/08 | 6289.576 | 4600.205 |
| 2/4/08 | 6289.576 | 4602.566 |
| 2/5/08 | 6289.576 | 4607.286 |
| 2/6/08 | 6289.576 | 4600.205 |
| 2/7/08 | 6289.576 | 4600.205 |
| 2/8/08 | 6289.576 | 4604.926 |
| 2/11/08 | 6289.576 | 4673.374 |
| 2/12/08 | 6289.576 | 4680.456 |
| 2/13/08 | 6289.576 | 4678.095 |
| 2/14/08 | 6289.576 | 4675.735 |
| 2/15/08 | 6289.576 | 4656.853 |
| 2/18/08 | 6289.576 | 4656.853 |
| 2/19/08 | 6289.576 | 4656.853 |
| 2/20/08 | 6289.576 | 4656.853 |
| 2/21/08 | 6289.576 | 4656.853 |
| 2/22/08 | 6289.576 | 4659.213 |
| 2/25/08 | 6289.576 | 4656.853 |
| 2/26/08 | 6289.576 | 4659.213 |
| 2/27/08 | 6289.576 | 4656.853 |
| 2/28/08 | 6289.576 | 4656.853 |
| 2/29/08 | 6289.576 | 4659.213 |
| 3/3/08 | 6289.576 | 4656.852 |
| 3/4/08 | 6289.576 | 4656.852 |
| 3/5/08 | 6289.576 | 4656.852 |
| 3/6/08 | 6289.576 | 4659.212 |
| 3/7/08 | 6289.576 | 4656.852 |
| 3/10/08 | 6289.576 | 4656.852 |
| 3/11/08 | 6289.576 | 4633.249 |
| 3/12/08 | 6289.576 | 4633.249 |
| 3/13/08 | 6289.576 | 4654.492 |
| 3/14/08 | 6289.576 | 4652.131 |
| 3/17/08 | 6289.576 | 4654.492 |
| 3/18/08 | 6289.576 | 4654.492 |
| 3/19/08 | 6289.576 | 4654.492 |
| 3/20/08 | 6289.576 | 4654.492 |
| 3/25/08 | 6289.576 | 4654.492 |
| 3/26/08 | 6289.576 | 4654.492 |
| 3/27/08 | 6289.576 | 4654.492 |
| 3/28/08 | 6289.576 | 4654.492 |
| 3/31/08 | 6289.576 | 4654.492 |
| 4/1/08 | 6289.576 | 4654.492 |
| 4/2/08 | 6289.576 | 4654.492 |
| 4/3/08 | 6289.576 | 4654.492 |
| 4/4/08 | 6289.576 | 4654.492 |
| 4/7/08 | 6289.576 | 4654.492 |
| 4/8/08 | 6289.576 | 4654.492 |
| 4/9/08 | 6289.576 | 4654.492 |
| 4/10/08 | 6289.576 | 4654.492 |
| 4/11/08 | 6289.576 | 4654.492 |
| 4/14/08 | 6289.576 | 4654.492 |
| 4/15/08 | 6289.576 | 4654.492 |
| 4/16/08 | 6289.576 | 4654.492 |
| 4/17/08 | 6289.576 | 4654.492 |
| 4/18/08 | 6289.576 | 4654.492 |
| 4/21/08 | 6289.576 | 4654.492 |
| 4/22/08 | 6289.576 | 4654.492 |
| 4/23/08 | 6289.576 | 4654.492 |
| 4/24/08 | 6293.673 | 4657.425 |
| 4/28/08 | 6296.906 | 4658.672 |
| 4/29/08 | 6304.212 | 4665.163 |
| 4/30/08 | 6289.22 | 4664.531 |
| 5/1/08 | 6274.228 | 4664.16 |
| 5/2/08 | 6253.774 | 4661.719 |
| 5/5/08 | 6374.952 | 4741.71 |
| 5/6/08 | 6422.853 | 4780.91 |
| 5/7/08 | 6378.949 | 4751.802 |
| 5/8/08 | 6375.456 | 4751.61 |
| 5/9/08 | 6359.266 | 4738.52 |
| 5/12/08 | 6345.425 | 4729.615 |
| 5/13/08 | 6386.005 | 4759.763 |
| 5/14/08 | 6532.528 | 4867.107 |
| 5/15/08 | 6524.346 | 4860.772 |
| 5/16/08 | 6547.189 | 4879.284 |
| 5/19/08 | 6679.734 | 4975.614 |
| 5/20/08 | 6688.4 | 4981.915 |
| 5/21/08 | 6640.378 | 4944.168 |
| 5/22/08 | 6661.449 | 4958.215 |
| 5/23/08 | 6684.4 | 4976.727 |
| 5/26/08 | 6643.198 | 4946.179 |
| 5/27/08 | 6723.313 | 4987.145 |
| 5/28/08 | 6619.568 | 4917.786 |
| 5/29/08 | 6733.529 | 4996.681 |
| 5/30/08 | 6955.706 | 5154.882 |
| 6/2/08 | 6987.086 | 5172.999 |
| 6/3/08 | 6944.647 | 5137.039 |
| 6/4/08 | 7025.309 | 5201.92 |
| 6/5/08 | 7003.07 | 5178.478 |
| 6/6/08 | 7081.431 | 5219.814 |
| 6/10/08 | 7050.259 | 5173.47 |
| 6/11/08 | 7083.21 | 5182.02 |
| 6/12/08 | 7085.034 | 5117.568 |
| 6/13/08 | 7085.034 | 5129.498 |
| 6/16/08 | 7085.034 | 5135.929 |
| 6/17/08 | 7085.034 | 5133.327 |
| 6/18/08 | 7085.034 | 5130.635 |
| 6/19/08 | 7085.034 | 5138.23 |
| 6/20/08 | 7085.034 | 5207.507 |
| 6/23/08 | 7085.034 | 5206.241 |
| 6/24/08 | 7085.034 | 5215.961 |
| 6/25/08 | 7085.034 | 5255.383 |
| 6/26/08 | 7085.034 | 5273.375 |
| 6/27/08 | 7085.034 | 5232.221 |
| 6/30/08 | 7085.034 | 5206.834 |
| 7/1/08 | 7085.034 | 5117.159 |
| 7/2/08 | 7085.034 | 5078.537 |
| 7/3/08 | 7085.034 | 4997.002 |
| 7/4/08 | 7085.034 | 5007.504 |
| 7/7/08 | 7085.034 | 4999.938 |
| 7/8/08 | 7085.034 | 4985.133 |
| 7/9/08 | 7085.034 | 4954.484 |
| 7/10/08 | 7085.034 | 4981.426 |
| 7/11/08 | 7085.034 | 4966.97 |
| 7/14/08 | 7085.034 | 4969.795 |
| 7/15/08 | 7085.034 | 4975.576 |
| 7/16/08 | 7085.034 | 4948.138 |
| 7/17/08 | 7085.034 | 4945.792 |
| 7/18/08 | 7085.034 | 4949.589 |
| 7/21/08 | 7085.034 | 4932.776 |
| 7/22/08 | 7085.034 | 4942.628 |
| 7/23/08 | 7085.034 | 4936.772 |
| 7/24/08 | 7085.034 | 4931.502 |
| 7/25/08 | 7085.034 | 4929.092 |
| 7/28/08 | 7085.034 | 4929.945 |
| 7/29/08 | 7085.034 | 4939.212 |
| 7/30/08 | 7085.034 | 4934.72 |
| 7/31/08 | 7085.034 | 4931.14 |
| 8/1/08 | 7085.034 | 4925.62 |
| 8/4/08 | 7085.034 | 4915.343 |
| 8/5/08 | 7085.034 | 4926.137 |
| 8/6/08 | 7085.034 | 4928.188 |
| 8/7/08 | 7085.034 | 4929.992 |
| 8/8/08 | 7085.034 | 4932.151 |
| 8/11/08 | 7085.034 | 4926.33 |
| 8/12/08 | 7085.034 | 4933.655 |
| 8/13/08 | 7085.034 | 4922.421 |
| 8/14/08 | 7085.034 | 4923.924 |
| 8/15/08 | 7085.034 | 4930.84 |
| 8/18/08 | 7085.034 | 4925.729 |
| 8/19/08 | 7085.034 | 4923.924 |
| 8/20/08 | 7085.034 | 4923.924 |
| 8/21/08 | 7085.034 | 4922.861 |
| 8/22/08 | 7085.034 | 4911.664 |
| 8/25/08 | 7085.034 | 4908.109 |
| 8/26/08 | 7085.034 | 4908.41 |
| 8/27/08 | 7085.034 | 4894.879 |
| 8/28/08 | 7085.034 | 4904.501 |
| 8/29/08 | 7085.034 | 4898.186 |
| 9/1/08 | 7085.034 | 4904.802 |
| 9/2/08 | 7085.034 | 4899.69 |
| 9/3/08 | 7085.034 | 4890.068 |
| 9/4/08 | 7085.034 | 4886.158 |
| 9/5/08 | 7085.034 | 4873.229 |
| 9/8/08 | 7085.034 | 4878.641 |
| 9/9/08 | 7085.034 | 4876.536 |
| 9/10/08 | 7085.034 | 4869.62 |
| 9/11/08 | 7085.034 | 4971.858 |
| 9/12/08 | 7085.034 | 4973.061 |
| 9/15/08 | 7085.034 | 4974.264 |
| 9/16/08 | 7085.034 | 4970.655 |
| 9/17/08 | 7085.034 | 4973.963 |
| 9/18/08 | 7085.034 | 4973.362 |
| 9/19/08 | 7085.034 | 4973.362 |
| 9/22/08 | 7085.034 | 4972.46 |
| 9/23/08 | 7085.034 | 4974.565 |
| 9/24/08 | 7085.034 | 4973.362 |
| 9/25/08 | 7085.034 | 4975.166 |
| 9/26/08 | 7085.034 | 4974.865 |
| 9/29/08 | 7085.034 | 4974.865 |
| 9/30/08 | 7085.034 | 4977.872 |
| 10/1/08 | 7085.034 | 4976.369 |
| 10/2/08 | 7085.034 | 4974.865 |
| 10/3/08 | 7085.034 | 4977.572 |
| 10/6/08 | 7085.034 | 4974.865 |
| 10/7/08 | 7085.034 | 4973.362 |
| 10/8/08 | 7085.034 | 4972.159 |
| 10/9/08 | 7085.034 | 4971.858 |
| 10/10/08 | 7085.034 | 4968.851 |
| 10/13/08 | 7085.034 | 4969.152 |
| 10/14/08 | 7085.034 | 4974.263 |
| 10/15/08 | 7085.034 | 4980.879 |
| 10/16/08 | 7085.034 | 4978.173 |
| 10/17/08 | 7085.034 | 4977.872 |
| 10/20/08 | 7085.034 | 4977.872 |
| 10/21/08 | 7085.034 | 4977.571 |
| 10/22/08 | 7085.034 | 4977.271 |
| 10/23/08 | 7085.034 | 4977.571 |
| 10/24/08 | 7085.034 | 4977.271 |
| 10/27/08 | 7085.034 | 4980.879 |
| 10/28/08 | 7085.034 | 4982.382 |
| 10/29/08 | 7085.034 | 4983.886 |
| 10/30/08 | 7085.034 | 4983.886 |
| 10/31/08 | 7085.034 | 4983.886 |
| 11/3/08 | 7085.034 | 4974.865 |
| 11/4/08 | 7085.034 | 4972.459 |
| 11/5/08 | 7085.034 | 4969.452 |
| 11/6/08 | 7085.034 | 4974.865 |
| 11/7/08 | 7085.034 | 4974.865 |
| 11/10/08 | 7085.034 | 4971.858 |
| 11/11/08 | 7085.034 | 4971.858 |
| 11/12/08 | 7085.034 | 4971.858 |
| 11/13/08 | 7085.034 | 4971.858 |
| 11/14/08 | 7085.034 | 4971.858 |
| 11/17/08 | 7085.034 | 4971.858 |
| 11/18/08 | 7085.034 | 4971.858 |
| 11/19/08 | 7085.034 | 4971.858 |
| 11/20/08 | 7085.034 | 4971.858 |
| 11/21/08 | 7085.034 | 4971.858 |
| 11/24/08 | 7085.034 | 4971.858 |
| 11/25/08 | 7085.034 | 4971.858 |
| 11/26/08 | 7085.034 | 4971.858 |
| 11/27/08 | 7085.034 | 4971.858 |
| 11/28/08 | 7085.034 | 4971.858 |
| 12/1/08 | 7085.034 | 4971.858 |
| 12/2/08 | 7085.034 | 4971.858 |
| 12/3/08 | 7085.034 | 4971.858 |
| 12/4/08 | 7085.034 | 4971.858 |
| 12/5/08 | 7085.034 | 4971.858 |
| 12/8/08 | 7085.034 | 4971.858 |
| 12/9/08 | 7085.034 | 4971.858 |
| 12/10/08 | 7085.034 | 4971.858 |
| 12/11/08 | 7085.034 | 4971.858 |
| 12/12/08 | 7085.034 | 4971.858 |
| 12/15/08 | 7085.034 | 4971.858 |
| 12/16/08 | 7085.034 | 4971.858 |
| 12/17/08 | 7085.034 | 4971.858 |
| 12/18/08 | 7085.034 | 4971.858 |
| 12/19/08 | 7085.034 | 4971.858 |
| 12/22/08 | 7085.034 | 4971.858 |
| 12/23/08 | 7085.034 | 4971.858 |
| 12/24/08 | 7085.034 | 4971.858 |
| 12/29/08 | 7085.034 | 4971.858 |
| 12/30/08 | 7085.034 | 4971.858 |
| 12/31/08 | 7085.034 | 4971.858 |
| 1/2/09 | 7085.034 | 4971.858 |
| 1/5/09 | 7085.034 | 4971.858 |
| 1/6/09 | 7085.034 | 4971.858 |
| 1/7/09 | 7085.034 | 4971.858 |
| 1/8/09 | 7085.034 | 4971.858 |
| 1/9/09 | 7085.034 | 4971.858 |
| 1/12/09 | 7085.034 | 4971.858 |
| 1/13/09 | 7085.034 | 4971.858 |
| 1/14/09 | 7085.034 | 4971.858 |
| 1/15/09 | 7085.034 | 4971.858 |
| 1/16/09 | 7085.034 | 4971.858 |
| 1/19/09 | 7085.034 | 4971.858 |
| 1/20/09 | 7085.034 | 4971.858 |
| 1/21/09 | 7085.034 | 4971.858 |
| 1/22/09 | 7085.034 | 4971.858 |
| 1/23/09 | 7085.034 | 4971.858 |
| 1/27/09 | 7085.034 | 4971.858 |
| 1/28/09 | 7085.034 | 4971.858 |
| 1/29/09 | 7085.034 | 4971.858 |
| 1/30/09 | 7085.034 | 4971.858 |
| 2/2/09 | 7085.034 | 4971.858 |
| 2/3/09 | 7085.034 | 4971.858 |
| 2/4/09 | 7085.034 | 4971.858 |
| 2/5/09 | 7085.034 | 4971.858 |
| 2/6/09 | 7085.034 | 4971.858 |
| 2/9/09 | 7085.034 | 4971.858 |
| 2/10/09 | 7085.034 | 4971.858 |
| 2/11/09 | 7085.034 | 4971.858 |
| 2/12/09 | 7085.034 | 4971.858 |
| 2/13/09 | 7085.034 | 4971.858 |
| 2/16/09 | 7085.034 | 4971.858 |
| 2/17/09 | 7085.034 | 4971.858 |
| 2/18/09 | 7085.034 | 4971.858 |
| 2/19/09 | 7085.034 | 4971.858 |
| 2/20/09 | 7085.034 | 4971.858 |
| 2/23/09 | 7085.034 | 4971.858 |
| 2/24/09 | 7085.034 | 4971.858 |
| 2/25/09 | 7085.034 | 4971.858 |
| 2/26/09 | 7085.034 | 4971.858 |
| 2/27/09 | 7085.034 | 4971.858 |
| 3/2/09 | 7085.034 | 4971.858 |
| 3/3/09 | 7085.034 | 4971.858 |
| 3/4/09 | 7085.034 | 4971.858 |
| 3/5/09 | 7085.034 | 4971.858 |
| 3/6/09 | 7085.034 | 4971.858 |
| 3/9/09 | 7085.034 | 4971.858 |
| 3/10/09 | 7085.034 | 4971.858 |
| 3/11/09 | 7085.034 | 4971.858 |
| 3/12/09 | 7085.034 | 4971.858 |
| 3/13/09 | 7085.034 | 4971.858 |
| 3/16/09 | 7085.034 | 4971.858 |
| 3/17/09 | 7085.034 | 4971.858 |
| 3/18/09 | 7085.034 | 4971.858 |
| 3/19/09 | 7085.034 | 4971.858 |
| 3/20/09 | 7085.034 | 4971.858 |
| 3/23/09 | 7085.034 | 4971.858 |
| 3/24/09 | 7085.034 | 4971.858 |
| 3/25/09 | 7113.023 | 4991.442 |
| 3/26/09 | 7129.125 | 5002.742 |
| 3/27/09 | 7156.985 | 5022.236 |
| 3/30/09 | 7138.913 | 5009.554 |
| 3/31/09 | 7140.968 | 5010.996 |
| 4/1/09 | 7096.097 | 4979.452 |
| 4/2/09 | 7113.35 | 4991.501 |
| 4/3/09 | 7129.71 | 5002.981 |
| 4/6/09 | 7065.046 | 4957.604 |
| 4/7/09 | 7057.925 | 4952.607 |
| 4/8/09 | 7068.195 | 4959.814 |
| 4/9/09 | 7078.101 | 4966.766 |
| 4/14/09 | 7097.852 | 4980.627 |
| 4/15/09 | 7095.695 | 4979.114 |
| 4/16/09 | 7208.457 | 5058.243 |
| 4/17/09 | 7239.318 | 5079.898 |
| 4/20/09 | 7218.447 | 5065.196 |
| 4/21/09 | 7165.883 | 5028.31 |
| 4/22/09 | 7144.702 | 5013.448 |
| 4/23/09 | 7160.992 | 5024.879 |
| 4/24/09 | 7046.279 | 4944.381 |
| 4/27/09 | 7081.711 | 4969.246 |
| 4/28/09 | 7138.46 | 5008.898 |
| 4/29/09 | 7077.234 | 4965.937 |
| 4/30/09 | 7233.358 | 5069.077 |
| 5/1/09 | 7226.099 | 5092.793 |
| 5/4/09 | 7172.22 | 5122.312 |
| 5/5/09 | 7044.589 | 5055.183 |
| 5/6/09 | 6980.719 | 5008.318 |
| 5/7/09 | 7142.531 | 5121.539 |
| 5/8/09 | 7069.261 | 5068.788 |
| 5/11/09 | 7048.22 | 5050.197 |
| 5/12/09 | 6984.595 | 5004.68 |
| 5/13/09 | 7081.379 | 5073.658 |
| 5/14/09 | 6963.733 | 4990.867 |
| 5/15/09 | 6986.814 | 5009.081 |
| 5/18/09 | 6973.054 | 5000.225 |
| 5/19/09 | 7059.132 | 5061.286 |
| 5/20/09 | 7076.465 | 5072.081 |
| 5/21/09 | 7137.145 | 5115.05 |
| 5/22/09 | 7130.385 | 5108.753 |
| 5/25/09 | 7091.559 | 5076.933 |
| 5/26/09 | 7120.967 | 5099.698 |
| 5/27/09 | 7186.628 | 5148.558 |
| 5/28/09 | 7237.137 | 5170.636 |
| 5/29/09 | 7554.602 | 5376.963 |
| 6/1/09 | 7698.672 | 5462.178 |
| 6/2/09 | 7668.182 | 5477.674 |
| 6/3/09 | 7789.075 | 5539.087 |
| 6/4/09 | 7728.685 | 5491.073 |
| 6/5/09 | 7654.611 | 5442.137 |
| 6/9/09 | 7649.728 | 5457.907 |
| 6/10/09 | 7718.429 | 5484.279 |
| 6/11/09 | 7893.65 | 5573.457 |
| 6/12/09 | 7914.993 | 5650.342 |
| 6/15/09 | 7829.816 | 5568.02 |
| 6/16/09 | 7625.014 | 5382.907 |
| 6/17/09 | 7535.524 | 5312.682 |
| 6/18/09 | 7639.811 | 5370.755 |
| 6/19/09 | 7706.072 | 5423.608 |
| 6/22/09 | 7614.783 | 5330.466 |
| 6/23/09 | 7355.045 | 5171.686 |
| 6/24/09 | 7368.003 | 5215.461 |
| 6/25/09 | 7405.858 | 5223.181 |
| 6/26/09 | 7481.27 | 5274.987 |
| 6/29/09 | 7449.666 | 5284.401 |
| 6/30/09 | 7474.158 | 5302.349 |
| 7/1/09 | 7491.99 | 5329.015 |
| 7/2/09 | 7473.133 | 5331.065 |
| 7/3/09 | 7389.157 | 5267.143 |
| 7/6/09 | 7392.14 | 5278.913 |
| 7/7/09 | 7411.11 | 5300.676 |
| 7/8/09 | 7190.579 | 5193.934 |
| 7/9/09 | 7217.654 | 5190.679 |
| 7/10/09 | 7224.42 | 5179.389 |
| 7/13/09 | 7221.444 | 5117.867 |
| 7/14/09 | 7200.654 | 5204.098 |
| 7/15/09 | 7240.96 | 5226.505 |
| 7/16/09 | 7277.602 | 5311.22 |
| 7/17/09 | 7240.96 | 5273.782 |
| 7/20/09 | 7277.602 | 5323.472 |
| 7/21/09 | 7306.916 | 5401.788 |
| 7/22/09 | 7332.375 | 5427.808 |
| 7/23/09 | 7382.412 | 5491.017 |
| 7/24/09 | 7369.017 | 5472.75 |
| 7/27/09 | 7358.057 | 5504.961 |
| 7/28/09 | 7378.813 | 5490.053 |
| 7/29/09 | 7365.354 | 5448.376 |
| 7/30/09 | 7450.132 | 5551.541 |
| 7/31/09 | 7470.067 | 5614.461 |
| 8/3/09 | 7485.212 | 5663.173 |
| 8/4/09 | 7433.268 | 5743.742 |
| 8/5/09 | 7392.6 | 5737.474 |
| 8/6/09 | 7347.704 | 5713.045 |
| 8/7/09 | 7280.709 | 5694.945 |
| 8/10/09 | 7436.471 | 5778.43 |
| 8/11/09 | 7601.587 | 5861.956 |
| 8/12/09 | 7817.862 | 6053.466 |
| 8/13/09 | 8212.292 | 6230.793 |
| 8/14/09 | 8355.76 | 6379.762 |
| 8/17/09 | 7805.254 | 6111.168 |
| 8/18/09 | 7573.845 | 5917.424 |
| 8/19/09 | 7883.424 | 5880.214 |
| 8/20/09 | 7916.044 | 5893.808 |
| 8/21/09 | 7835.952 | 5869.955 |
| 8/24/09 | 8081.738 | 6028.073 |
| 8/25/09 | 8126.351 | 6042.712 |
| 8/26/09 | 8074.209 | 6112.896 |
| 8/27/09 | 8040.907 | 6128.91 |
| 8/28/09 | 8179.086 | 6157.361 |
| 8/31/09 | 8334.647 | 6197.939 |
| 9/1/09 | 8278.827 | 6082.345 |
| 9/2/09 | 8118.29 | 6021.639 |
| 9/3/09 | 8154.731 | 6121.85 |
| 9/4/09 | 8326.043 | 6154.423 |
| 9/7/09 | 8626.63 | 6218.35 |
| 9/8/09 | 8732.31 | 6316.611 |
| 9/9/09 | 8741.385 | 6400.84 |
| 9/10/09 | 8795.046 | 6452.776 |
| 9/11/09 | 8852.183 | 6481.117 |
| 9/14/09 | 8823.361 | 6484.904 |
| 9/15/09 | 8875.529 | 6479.826 |
| 9/16/09 | 9058.176 | 6502.841 |
| 9/17/09 | 9075.317 | 6564.462 |
| 9/18/09 | 9170.07 | 6677.832 |
| 9/21/09 | 9057.865 | 6662.535 |
| 9/22/09 | 9034.157 | 6637.524 |
| 9/23/09 | 9161.526 | 6782.036 |
| 9/24/09 | 8976.72 | 6860.332 |
| 9/25/09 | 8903.586 | 6798.514 |
| 9/28/09 | 8766.22 | 6694.841 |
| 9/29/09 | 8901.699 | 6788.892 |
| 9/30/09 | 8934.311 | 6841.72 |
| 10/1/09 | 8871.714 | 6828.206 |
| 10/2/09 | 8620.437 | 6736.002 |
| 10/5/09 | 8516.551 | 6729.051 |
| 10/6/09 | 8613.493 | 6757.975 |
| 10/7/09 | 8706.678 | 6742.843 |
| 10/8/09 | 8653.839 | 6752.222 |
| 10/9/09 | 8769.54 | 6834.386 |
| 10/12/09 | 8725.987 | 6841.065 |
| 10/13/09 | 8586.033 | 6935.953 |
| 10/14/09 | 8596.776 | 6915.562 |
| 10/15/09 | 8640.489 | 6923.183 |
| 10/16/09 | 8691.923 | 6919.377 |
| 10/19/09 | 8651.381 | 6843.254 |
| 10/20/09 | 8744.983 | 6874.233 |
| 10/21/09 | 8853.91 | 6868.454 |
| 10/22/09 | 8713.86 | 6816.724 |
| 10/23/09 | 8790.09 | 6816.913 |
| 10/26/09 | 8760.261 | 6839.661 |
| 10/27/09 | 8549.538 | 6801.796 |
| 10/28/09 | 8513.882 | 6796.89 |
| 10/29/09 | 8259.915 | 6665.769 |
| 10/30/09 | 8366.384 | 6734.893 |
| 11/2/09 | 8197.962 | 6607.349 |
| 11/3/09 | 8223.871 | 6696.795 |
| 11/4/09 | 8318.659 | 6765.373 |
| 11/5/09 | 8337.828 | 6809.986 |
| 11/6/09 | 8369.79 | 6813.425 |
| 11/9/09 | 8390.449 | 6967.025 |
| 11/10/09 | 8469.692 | 7109.446 |
| 11/11/09 | 8533.895 | 7089.256 |
| 11/12/09 | 8549.58 | 7127.356 |
| 11/13/09 | 8545.998 | 7148.125 |
| 11/16/09 | 8619.956 | 7198.856 |
| 11/17/09 | 8583.408 | 7285.579 |
| 11/18/09 | 8534.272 | 7290.789 |
| 11/19/09 | 8544.296 | 7284.613 |
| 11/20/09 | 8572.233 | 7292.673 |
| 11/23/09 | 8541.295 | 7304.782 |
| 11/24/09 | 8526.663 | 7267.34 |
| 11/25/09 | 8478.856 | 7234.988 |
| 11/26/09 | 8374.712 | 7216.146 |
| 11/27/09 | 8251.096 | 7062.21 |
| 11/30/09 | 8184.163 | 7141.349 |
| 12/1/09 | 8183.973 | 7210.435 |
| 12/2/09 | 8195.834 | 7251.048 |
| 12/3/09 | 8143.124 | 7317.187 |
| 12/4/09 | 8101.363 | 7215.846 |
| 12/7/09 | 8046.975 | 7178.336 |
| 12/8/09 | 8045.686 | 7159.512 |
| 12/9/09 | 7944.08 | 7155.319 |
| 12/10/09 | 7936.136 | 7058.822 |
| 12/11/09 | 7936.136 | 7124.038 |
| 12/14/09 | 7936.136 | 7123.456 |
| 12/15/09 | 7936.136 | 7103.374 |
| 12/16/09 | 7931.586 | 7102.713 |
| 12/17/09 | 7926.354 | 7120.834 |
| 12/18/09 | 7904.079 | 7053.044 |
| 12/21/09 | 7897.119 | 7034.519 |
| 12/22/09 | 7903.933 | 7038.769 |
| 12/23/09 | 7903.933 | 6998.942 |
| 12/24/09 | 7891.667 | 7023.382 |
| 12/29/09 | 7881.991 | 7181.173 |
| 12/30/09 | 7851.698 | 7134.263 |
| 12/31/09 | 7887.177 | 7232.813 |
| 1/4/10 | 7863.708 | 7222.857 |
| 1/5/10 | 7900.401 | 7300.575 |
| 1/6/10 | 7910.263 | 7346.411 |
| 1/7/10 | 7899.873 | 7345.27 |
| 1/8/10 | 7866.1 | 7302.301 |
| 1/11/10 | 7877.446 | 7310.645 |
| 1/12/10 | 7847.218 | 7297.009 |
| 1/13/10 | 7829.047 | 7295.505 |
| 1/14/10 | 7890.686 | 7280.937 |
| 1/15/10 | 7910.316 | 7304.725 |
| 1/18/10 | 7964.549 | 7337.755 |
| 1/19/10 | 7964.958 | 7244.732 |
| 1/20/10 | 8016.18 | 7321.191 |
| 1/21/10 | 7877.065 | 7214.138 |
| 1/22/10 | 7745.215 | 7127.293 |
| 1/25/10 | 7699.089 | 7083.79 |
| 1/27/10 | 7686.824 | 6963.874 |
| 1/28/10 | 7686.824 | 6965.15 |
| 1/29/10 | 7686.824 | 6900.62 |
| 2/1/10 | 7686.824 | 6818.345 |
| 2/2/10 | 7686.824 | 6919.308 |
| 2/3/10 | 7686.824 | 6951.907 |
| 2/4/10 | 7686.824 | 6909.693 |
| 2/5/10 | 7686.824 | 6836.768 |
| 2/8/10 | 7686.824 | 6739.984 |
| 2/9/10 | 7686.824 | 6772.046 |
| 2/10/10 | 7686.824 | 6776.778 |
| 2/11/10 | 7686.824 | 6848.968 |
| 2/12/10 | 7686.824 | 6868.141 |
| 2/15/10 | 7686.824 | 6846.688 |
| 2/16/10 | 7686.824 | 6875.056 |
| 2/17/10 | 7686.824 | 6958.421 |
| 2/18/10 | 7686.824 | 6963.273 |
| 2/19/10 | 7686.824 | 6976.343 |
| 2/22/10 | 7686.824 | 7043.558 |
| 2/23/10 | 7675.22 | 7058.954 |
| 2/24/10 | 7699.572 | 7102.602 |
| 2/25/10 | 7698.81 | 7141.717 |
| 2/26/10 | 7698.81 | 7130.596 |
| 3/1/10 | 7698.81 | 7141.849 |
| 3/2/10 | 7698.81 | 7129.074 |
| 3/3/10 | 7698.81 | 7198.631 |
| 3/4/10 | 7702.82 | 7152.029 |
| 3/5/10 | 7669.139 | 7146.493 |
| 3/8/10 | 7715.043 | 7228.894 |
| 3/9/10 | 7671.754 | 7234.681 |
| 3/10/10 | 7723.381 | 7262.733 |
| 3/11/10 | 7696.901 | 7254.782 |
| 3/12/10 | 7715.021 | 7268.385 |
| 3/15/10 | 7600.53 | 7213.951 |
| 3/16/10 | 7577.742 | 7217.705 |
| 3/17/10 | 7617.003 | 7300.27 |
| 3/18/10 | 7669.439 | 7339.237 |
| 3/19/10 | 7705.05 | 7342.981 |
| 3/22/10 | 7684.215 | 7316.092 |
| 3/23/10 | 7712.161 | 7316.227 |
| 3/24/10 | 7689.533 | 7297.693 |
| 3/25/10 | 7713.642 | 7293.989 |
| 3/26/10 | 7631.687 | 7186.034 |
| 3/29/10 | 7634.075 | 7198.19 |
| 3/30/10 | 7626.473 | 7212.022 |
| 3/31/10 | 7661.411 | 7207.495 |
| 4/1/10 | 7660.462 | 7255.445 |
| 4/6/10 | 7746.256 | 7396.178 |
| 4/7/10 | 7750.979 | 7399.648 |
| 4/8/10 | 7712.316 | 7351.972 |
| 4/9/10 | 7726.323 | 7339.682 |
| 4/12/10 | 7794.215 | 7402.603 |
| 4/13/10 | 7766.306 | 7398.879 |
| 4/14/10 | 7812.497 | 7408.351 |
| 4/15/10 | 7828.961 | 7408.971 |
| 4/16/10 | 7914.802 | 7479.837 |
| 4/19/10 | 7833.245 | 7416.065 |
| 4/20/10 | 7927.103 | 7365.098 |
| 4/21/10 | 7919.393 | 7363.04 |
| 4/22/10 | 7867.517 | 7269.054 |
| 4/23/10 | 7864.856 | 7288.79 |
| 4/27/10 | 7828.836 | 7255.583 |
| 4/28/10 | 7637.53 | 7107.231 |
| 4/29/10 | 7608.146 | 7052.427 |
| 4/30/10 | 7565.262 | 7035.499 |
| 5/3/10 | 7470.532 | 6900.671 |
| 5/4/10 | 7509.528 | 6723.68 |
| 5/5/10 | 7509.528 | 6635.452 |
| 5/6/10 | 7509.528 | 6533.825 |
| 5/7/10 | 7509.528 | 6394.222 |
| 5/10/10 | 7509.528 | 6436.819 |
| 5/11/10 | 7509.528 | 6447.956 |
| 5/12/10 | 7509.528 | 6511.126 |
| 5/13/10 | 7509.528 | 6561.197 |
| 5/14/10 | 7509.528 | 6563.386 |
| 5/17/10 | 7509.528 | 6461.216 |
| 5/18/10 | 7509.528 | 6460.638 |
| 5/19/10 | 7509.528 | 6391.131 |
| 5/20/10 | 7509.528 | 6352.199 |
| 5/21/10 | 7509.528 | 6287.956 |
| 5/24/10 | 7509.528 | 6323.192 |
| 5/25/10 | 7509.528 | 6330.417 |
| 5/26/10 | 7509.528 | 6330.417 |
| 5/27/10 | 7509.528 | 6326.804 |
| 5/28/10 | 7509.528 | 6337.641 |
| 5/31/10 | 7509.528 | 6341.253 |
| 6/1/10 | 7509.528 | 6326.804 |
| 6/2/10 | 7509.528 | 6323.192 |
| 6/3/10 | 7509.528 | 6330.416 |
| 6/4/10 | 7509.528 | 6334.029 |
| 6/7/10 | 7509.528 | 6326.804 |
| 6/8/10 | 7509.528 | 6334.029 |
| 6/9/10 | 7509.528 | 6337.641 |
| 6/10/10 | 7509.528 | 6348.477 |
| 6/11/10 | 7509.528 | 6352.089 |
| 6/15/10 | 7509.528 | 6352.089 |
| 6/16/10 | 7509.528 | 6352.089 |
| 6/17/10 | 7509.528 | 6344.864 |
| 6/18/10 | 7509.528 | 6355.701 |
| 6/21/10 | 7509.528 | 6352.089 |
| 6/22/10 | 7509.528 | 6355.701 |
| 6/23/10 | 7509.528 | 6348.477 |
| 6/24/10 | 7509.528 | 6353.359 |
| 6/25/10 | 7509.528 | 6349.674 |
| 6/28/10 | 7509.528 | 6349.674 |
| 6/29/10 | 7509.528 | 6353.359 |
| 6/30/10 | 7509.528 | 6349.674 |
| 7/1/10 | 7509.528 | 6342.304 |
| 7/2/10 | 7509.528 | 6342.304 |
| 7/5/10 | 7509.528 | 6338.619 |
| 7/6/10 | 7509.528 | 6338.619 |
| 7/7/10 | 7509.528 | 6338.619 |
| 7/8/10 | 7509.528 | 6342.305 |
| 7/9/10 | 7509.528 | 6345.989 |
| 7/12/10 | 7509.528 | 6342.304 |
| 7/13/10 | 7509.528 | 6345.989 |
| 7/14/10 | 7509.528 | 6349.674 |
| 7/15/10 | 7509.528 | 6345.99 |
| 7/16/10 | 7509.528 | 6345.99 |
| 7/19/10 | 7509.528 | 6345.99 |
| 7/20/10 | 7509.528 | 6342.304 |
| 7/21/10 | 7509.528 | 6342.304 |
| 7/22/10 | 7509.528 | 6342.304 |
| 7/23/10 | 7509.528 | 6342.304 |
| 7/26/10 | 7509.528 | 6342.304 |
| 7/27/10 | 7509.528 | 6342.304 |
| 7/28/10 | 7509.528 | 6342.304 |
| 7/29/10 | 7509.528 | 6342.304 |
| 7/30/10 | 7509.528 | 6342.304 |
| 8/2/10 | 7509.528 | 6342.304 |
| 8/3/10 | 7509.528 | 6342.304 |
| 8/4/10 | 7480.081 | 6317.404 |
| 8/5/10 | 7499.586 | 6333.878 |
| 8/6/10 | 7480.081 | 6317.404 |
| 8/9/10 | 7493.565 | 6328.763 |
| 8/10/10 | 7404.486 | 6253.502 |
| 8/11/10 | 7349.703 | 6207.234 |
| 8/12/10 | 7292.273 | 6179.153 |
| 8/13/10 | 7292.273 | 6247.393 |
| 8/16/10 | 7292.273 | 6214.732 |
| 8/17/10 | 7292.273 | 6263.046 |
| 8/18/10 | 7292.273 | 6230.973 |
| 8/19/10 | 7282.939 | 6241.681 |
| 8/20/10 | 7260.08 | 6255.727 |
| 8/23/10 | 7254.365 | 6233.722 |
| 8/24/10 | 7254.365 | 6146.21 |
| 8/25/10 | 7254.365 | 6190.744 |
| 8/26/10 | 7254.365 | 6172.141 |
| 8/27/10 | 7254.365 | 6198.805 |
| 8/30/10 | 7254.365 | 6190.568 |
| 8/31/10 | 7254.365 | 6174.094 |
| 9/1/10 | 7254.365 | 6199.358 |
| 9/2/10 | 7231.403 | 6192.405 |
| 9/3/10 | 7276.946 | 6300.701 |
| 9/6/10 | 7263.933 | 6314.973 |
| 9/7/10 | 7296.463 | 6340.819 |
| 9/8/10 | 7293.21 | 6413.829 |
| 9/9/10 | 7309.476 | 6452.438 |
| 9/10/10 | 7289.958 | 6410.072 |
| 9/13/10 | 7286.705 | 6460.196 |
| 9/14/10 | 7285.648 | 6447.086 |
| 9/15/10 | 7304.341 | 6479.189 |
| 9/16/10 | 7260.31 | 6429.151 |
| 9/17/10 | 7240.923 | 6425.865 |
| 9/20/10 | 7213.938 | 6405.342 |
| 9/21/10 | 7218.243 | 6416.705 |
| 9/22/10 | 7228.277 | 6413.531 |
| 9/23/10 | 7185.524 | 6378.406 |
| 9/24/10 | 7219.753 | 6434.601 |
| 9/27/10 | 7299.737 | 6530.406 |
| 9/28/10 | 7304.203 | 6549.78 |
| 9/29/10 | 7350.698 | 6616.089 |
| 9/30/10 | 7314.205 | 6593.022 |
| 10/1/10 | 7276.458 | 6578.657 |
| 10/4/10 | 7219.45 | 6532.066 |
| 10/5/10 | 7168.79 | 6474.306 |
| 10/6/10 | 7413.523 | 6636.475 |
| 10/7/10 | 7633.986 | 6806.302 |
| 10/8/10 | 7630.058 | 6845.423 |
| 10/11/10 | 7740.471 | 6893.199 |
| 10/12/10 | 7595.04 | 6666.858 |
| 10/13/10 | 7667.744 | 6732.7 |
| 10/14/10 | 7811.49 | 6825.136 |
| 10/15/10 | 7787.817 | 6854.944 |
| 10/18/10 | 7668.294 | 6714.796 |
| 10/19/10 | 7653.825 | 6647.578 |
| 10/20/10 | 7504.152 | 6551.218 |
| 10/21/10 | 7594.597 | 6571.822 |
| 10/22/10 | 7620.018 | 6566.387 |
| 10/25/10 | 7722.774 | 6625.775 |
| 10/26/10 | 7723.395 | 6575.401 |
| 10/27/10 | 7651.411 | 6585.439 |
| 10/28/10 | 7666.754 | 6612.841 |
| 10/29/10 | 7709.905 | 6677.859 |
| 11/1/10 | 7769.984 | 6706.329 |
| 11/2/10 | 7761.028 | 6757.44 |
| 11/3/10 | 7743.534 | 6738.964 |
| 11/4/10 | 7674.397 | 6654.549 |
| 11/5/10 | 7716.286 | 6704.493 |
| 11/8/10 | 7741.836 | 6722.379 |
| 11/9/10 | 7744.278 | 6729.165 |
| 11/10/10 | 7641.782 | 6667.344 |
| 11/11/10 | 7842.393 | 6807.377 |
| 11/12/10 | 7854.479 | 6844.013 |
| 11/15/10 | 7769.933 | 6813.364 |
| 11/16/10 | 7790.006 | 6869.558 |
| 11/17/10 | 7550.915 | 6783.686 |
| 11/18/10 | 7550.382 | 6788.945 |
| 11/19/10 | 7594.385 | 6791.602 |
| 11/22/10 | 7673.296 | 6869.527 |
| 11/23/10 | 7568.266 | 6800.038 |
| 11/24/10 | 7600.357 | 6858.721 |
| 11/25/10 | 7582.919 | 6870.444 |
| 11/26/10 | 7658.558 | 6887.867 |
| 11/29/10 | 7723.579 | 6981.455 |
| 11/30/10 | 7704.725 | 6984.036 |
| 12/1/10 | 7717.604 | 6915.648 |
| 12/2/10 | 7841.702 | 6927.801 |
| 12/3/10 | 7843.884 | 6902.862 |
| 12/6/10 | 7983.668 | 6987.524 |
| 12/7/10 | 8063.288 | 7035.881 |
| 12/8/10 | 8347.291 | 7213.938 |
| 12/9/10 | 8507.541 | 7437.571 |
| 12/10/10 | 8383.312 | 7333.042 |
| 12/13/10 | 8482.054 | 7437.048 |
| 12/14/10 | 8464.535 | 7417.673 |
| 12/15/10 | 8405.592 | 7439.938 |
| 12/16/10 | 8404.563 | 7409.888 |
| 12/17/10 | 8435.438 | 7457.947 |
| 12/20/10 | 8463.254 | 7521.034 |
| 12/21/10 | 8537.832 | 7533.172 |
| 12/22/10 | 8587.144 | 7500.007 |
| 12/23/10 | 8664.06 | 7571.799 |
| 12/24/10 | 8612.277 | 7544.344 |
| 12/29/10 | 8614.644 | 7587.359 |
| 12/30/10 | 8610.087 | 7582.099 |
| 12/31/10 | 8703.97 | 7601.562 |
| 1/4/11 | 8800.964 | 7613.345 |
| 1/5/11 | 8667.127 | 7574.015 |
| 1/6/11 | 8563.43 | 7559.584 |
| 1/7/11 | 8493.144 | 7512.215 |
| 1/10/11 | 8449.43 | 7493.842 |
| 1/11/11 | 8465.895 | 7522.396 |
| 1/12/11 | 8591.661 | 7664.206 |
| 1/13/11 | 8896.638 | 7879.541 |
| 1/14/11 | 9000.09 | 7900.717 |
| 1/17/11 | 8958.16 | 7993.009 |
| 1/18/11 | 8926.129 | 7999.579 |
| 1/19/11 | 9049.298 | 7995.507 |
| 1/20/11 | 9010.117 | 8005.216 |
| 1/21/11 | 8934.288 | 7982.122 |
| 1/24/11 | 8857.755 | 7991.99 |
| 1/25/11 | 8912.824 | 8044.409 |
| 1/27/11 | 8935.291 | 8068.237 |
| 1/28/11 | 8744.898 | 8021.302 |
| 1/31/11 | 8747.702 | 7991.105 |
| 2/1/11 | 8837.536 | 8032.33 |
| 2/2/11 | 8955.901 | 8048.117 |
| 2/3/11 | 9029.604 | 8061.954 |
| 2/4/11 | 9077.067 | 8049.79 |
| 2/7/11 | 9279.257 | 8160.696 |
| 2/8/11 | 9369.715 | 8249.242 |
| 2/9/11 | 9441.187 | 8280.109 |
| 2/10/11 | 9837.471 | 8328.419 |
| 2/11/11 | 9686.469 | 8320.977 |
| 2/14/11 | 9684.016 | 8390.087 |
| 2/15/11 | 9778.529 | 8400.546 |
| 2/16/11 | 9678.963 | 8442.427 |
| 2/17/11 | 9677.305 | 8428.531 |
| 2/18/11 | 9685.353 | 8394.491 |
| 2/21/11 | 9605.472 | 8283.163 |
| 2/22/11 | 9555.561 | 8206.589 |
| 2/23/11 | 9448.668 | 8069.804 |
| 2/24/11 | 9466.898 | 8101.569 |
| 2/25/11 | 9490.922 | 8137.166 |
| 2/28/11 | 9545.045 | 8177.303 |
| 3/1/11 | 9568.713 | 8189.936 |
| 3/2/11 | 9593.225 | 8242.369 |
| 3/3/11 | 9616.271 | 8325.319 |
| 3/4/11 | 9928.589 | 8613.276 |
| 3/7/11 | 10009.813 | 8755.145 |
| 3/8/11 | 10002.252 | 8757.346 |
| 3/9/11 | 9929.886 | 8634.909 |
| 3/10/11 | 9717.816 | 8526.842 |
| 3/11/11 | 9621.293 | 8506.327 |
| 3/14/11 | 9621.293 | 8393.398 |
| 3/15/11 | 9621.293 | 8351.602 |
| 3/16/11 | 9621.293 | 8471.748 |
| 3/17/11 | 9621.293 | 8365.23 |
| 3/18/11 | 9621.293 | 8557.233 |
| 3/21/11 | 9621.293 | 8659.513 |
| 3/22/11 | 9621.293 | 8682.601 |
| 3/23/11 | 9621.293 | 8788.553 |
| 3/24/11 | 9621.293 | 8846.887 |
| 3/25/11 | 9621.293 | 9030.345 |
| 3/28/11 | 9621.293 | 9056.527 |
| 3/29/11 | 9621.293 | 9140.72 |
| 3/30/11 | 9621.293 | 9091.01 |
| 3/31/11 | 9709.357 | 8998.744 |
| 4/1/11 | 9708.187 | 9039.38 |
| 4/4/11 | 9693.987 | 9219.952 |
| 4/5/11 | 9781.284 | 9274.555 |
| 4/6/11 | 9768.737 | 9193.375 |
| 4/7/11 | 9858.426 | 9165.49 |
| 4/8/11 | 10087.698 | 9260.165 |
| 4/11/11 | 10157.135 | 9291.467 |
| 4/12/11 | 9969.476 | 9208.801 |
| 4/13/11 | 9943.329 | 9238.748 |
| 4/14/11 | 10014.508 | 9203.43 |
| 4/15/11 | 9960.593 | 9133.745 |
| 4/18/11 | 9892.51 | 9176.59 |
| 4/19/11 | 9676.793 | 8989.025 |
| 4/20/11 | 9751.553 | 9167.93 |
| 4/21/11 | 9759.628 | 9240.777 |
| 4/27/11 | 9725.844 | 9147.532 |
| 4/28/11 | 9708.114 | 9092.103 |
| 4/29/11 | 9653.98 | 8966.925 |
| 5/2/11 | 9651.978 | 8952.094 |
| 5/3/11 | 9696.947 | 8928.417 |
| 5/4/11 | 9696.947 | 9085.643 |
| 5/5/11 | 9696.947 | 9308.598 |
| 5/6/11 | 9696.947 | 9276.365 |
| 5/9/11 | 9696.947 | 9416.723 |
| 5/10/11 | 9696.947 | 9458.972 |
| 5/11/11 | 9696.947 | 9619.675 |
| 5/12/11 | 9696.947 | 9411.623 |
| 5/13/11 | 9696.947 | 9239.994 |
| 5/16/11 | 9696.947 | 9124.284 |
| 5/17/11 | 9696.947 | 9156.093 |
| 5/18/11 | 9696.947 | 9281.641 |
| 5/19/11 | 9696.947 | 9381.504 |
| 5/20/11 | 9696.947 | 9422.847 |
| 5/23/11 | 9696.947 | 9170.355 |
| 5/24/11 | 9696.947 | 9118.369 |
| 5/25/11 | 9696.947 | 9112.164 |
| 5/26/11 | 9696.947 | 9123.902 |
| 5/27/11 | 9696.947 | 9140.145 |
| 5/30/11 | 9696.947 | 9175.444 |
| 5/31/11 | 9696.947 | 9164.929 |
| 6/1/11 | 9696.947 | 9194.228 |
| 6/2/11 | 9696.947 | 9093.282 |
| 6/3/11 | 9696.947 | 9056.814 |
| 6/6/11 | 9696.947 | 9027.613 |
| 6/7/11 | 9696.947 | 9029.921 |
| 6/8/11 | 9696.947 | 8955.871 |
| 6/9/11 | 9696.947 | 8928.733 |
| 6/10/11 | 9696.947 | 8959.624 |
| 6/14/11 | 9696.947 | 9005.238 |
| 6/15/11 | 9696.947 | 9031.881 |
| 6/16/11 | 9696.947 | 9007.698 |
| 6/17/11 | 9696.947 | 9019.186 |
| 6/20/11 | 9696.947 | 8962.376 |
| 6/21/11 | 9696.947 | 8978.062 |
| 6/22/11 | 9696.947 | 8978.593 |
| 6/23/11 | 9696.947 | 8964.836 |
| 6/24/11 | 9696.947 | 8943.405 |
| 6/27/11 | 9696.947 | 8931.675 |
| 6/28/11 | 9696.947 | 8943.55 |
| 6/29/11 | 9696.947 | 8943.55 |
| 6/30/11 | 9696.947 | 8929.649 |
| 7/1/11 | 9696.947 | 8938.916 |
| 7/4/11 | 9696.947 | 8952.817 |
| 7/5/11 | 9696.947 | 8962.084 |
| 7/6/11 | 9696.947 | 8999.153 |
| 7/7/11 | 9696.947 | 9045.49 |
| 7/8/11 | 9696.947 | 9073.293 |
| 7/11/11 | 9696.947 | 9064.025 |
| 7/12/11 | 9696.947 | 9031.589 |
| 7/13/11 | 9696.947 | 8999.153 |
| 7/14/11 | 9696.947 | 8975.985 |
| 7/15/11 | 9696.947 | 8975.985 |
| 7/18/11 | 9696.947 | 8975.985 |
| 7/19/11 | 9696.947 | 8957.45 |
| 7/20/11 | 9696.947 | 8975.984 |
| 7/21/11 | 9696.947 | 8989.886 |
| 7/22/11 | 9696.947 | 9026.955 |
| 7/25/11 | 9696.947 | 9040.857 |
| 7/26/11 | 9696.947 | 9045.49 |
| 7/27/11 | 9696.947 | 9026.955 |
| 7/28/11 | 9696.947 | 9008.42 |
| 7/29/11 | 9696.947 | 9022.321 |
| 8/1/11 | 9696.947 | 9050.123 |
| 8/2/11 | 9696.947 | 9031.589 |
| 8/3/11 | 9696.947 | 8971.35 |
| 8/4/11 | 9696.947 | 8962.083 |
| 8/5/11 | 9696.947 | 8799.904 |
| 8/8/11 | 9696.947 | 8732.715 |
| 8/9/11 | 9696.947 | 8732.715 |
| 8/10/11 | 9696.947 | 8732.715 |
| 8/11/11 | 9696.947 | 8732.715 |
| 8/12/11 | 9696.947 | 8732.715 |
| 8/15/11 | 9696.947 | 8732.715 |
| 8/16/11 | 9696.947 | 8732.715 |
| 8/17/11 | 9696.947 | 8732.715 |
| 8/18/11 | 9696.947 | 8732.715 |
| 8/19/11 | 9696.947 | 8732.715 |
| 8/22/11 | 9696.947 | 8732.715 |
| 8/23/11 | 9696.947 | 8732.715 |
| 8/24/11 | 9696.947 | 8732.715 |
| 8/25/11 | 9696.947 | 8732.715 |
| 8/26/11 | 9696.947 | 8732.715 |
| 8/29/11 | 9696.947 | 8732.715 |
| 8/30/11 | 9696.947 | 8732.715 |
| 8/31/11 | 9696.947 | 8732.715 |
| 9/1/11 | 9696.947 | 8732.715 |
| 9/2/11 | 9696.947 | 8732.715 |
| 9/5/11 | 9696.947 | 8732.715 |
| 9/6/11 | 9696.947 | 8732.715 |
| 9/7/11 | 9696.947 | 8732.715 |
| 9/8/11 | 9696.947 | 8732.715 |
| 9/9/11 | 9696.947 | 8732.715 |
| 9/12/11 | 9696.947 | 8732.715 |
| 9/13/11 | 9696.947 | 8732.715 |
| 9/14/11 | 9696.947 | 8732.715 |
| 9/15/11 | 9696.947 | 8732.715 |
| 9/16/11 | 9696.947 | 8732.715 |
| 9/19/11 | 9696.947 | 8732.715 |
| 9/20/11 | 9696.947 | 8732.715 |
| 9/21/11 | 9696.947 | 8732.715 |
| 9/22/11 | 9696.947 | 8732.715 |
| 9/23/11 | 9696.947 | 8732.715 |
| 9/26/11 | 9696.947 | 8732.715 |
| 9/27/11 | 9696.947 | 8732.715 |
| 9/28/11 | 9696.947 | 8732.715 |
| 9/29/11 | 9696.947 | 8732.715 |
| 9/30/11 | 9696.947 | 8732.715 |
| 10/3/11 | 9696.947 | 8732.715 |
| 10/4/11 | 9696.947 | 8732.715 |
| 10/5/11 | 9696.947 | 8732.715 |
| 10/6/11 | 9696.947 | 8732.715 |
| 10/7/11 | 9696.947 | 8732.715 |
| 10/10/11 | 9696.947 | 8732.715 |
| 10/11/11 | 9696.947 | 8732.715 |
| 10/12/11 | 9696.947 | 8732.715 |
| 10/13/11 | 9696.947 | 8732.715 |
| 10/14/11 | 9696.947 | 8732.715 |
| 10/17/11 | 9696.947 | 8732.715 |
| 10/18/11 | 9696.947 | 8732.715 |
| 10/19/11 | 9696.947 | 8732.715 |
| 10/20/11 | 9696.947 | 8732.715 |
| 10/21/11 | 9696.947 | 8732.715 |
| 10/24/11 | 9696.947 | 8732.715 |
| 10/25/11 | 9671.868 | 8710.092 |
| 10/26/11 | 9661.741 | 8704.416 |
| 10/27/11 | 9661.741 | 8732.335 |
| 10/28/11 | 9668.676 | 8727.167 |
| 10/31/11 | 9626.603 | 8700.031 |
| 11/1/11 | 9550.224 | 8615.622 |
| 11/2/11 | 9522.301 | 8581.821 |
| 11/3/11 | 9512.723 | 8556.315 |
| 11/4/11 | 9512.723 | 8587.027 |
| 11/7/11 | 9499.125 | 8612.981 |
| 11/8/11 | 9532.36 | 8609.138 |
| 11/9/11 | 9534.848 | 8649.389 |
| 11/10/11 | 9454.299 | 8535.79 |
| 11/11/11 | 9520.751 | 8590.641 |
| 11/14/11 | 9564.109 | 8603.415 |
| 11/15/11 | 9575.44 | 8629.696 |
| 11/16/11 | 9569.424 | 8587.169 |
| 11/17/11 | 9591.927 | 8596.586 |
| 11/18/11 | 9602.132 | 8575.058 |
| 11/21/11 | 9621.302 | 8655.284 |
| 11/22/11 | 9549.609 | 8684.834 |
| 11/23/11 | 9549.609 | 8557.251 |
| 11/24/11 | 9549.609 | 8451.143 |
| 11/25/11 | 9549.609 | 8431.047 |
| 11/28/11 | 9549.609 | 8245.007 |
| 11/29/11 | 9549.609 | 8266.415 |
| 11/30/11 | 9549.609 | 8354.161 |
| 12/1/11 | 9549.609 | 8495.631 |
| 12/2/11 | 9549.609 | 8588.417 |
| 12/5/11 | 9549.609 | 8665.578 |
| 12/6/11 | 9549.609 | 8634.755 |
| 12/7/11 | 9549.609 | 8641.995 |
| 12/8/11 | 9549.609 | 8661.142 |
| 12/9/11 | 9549.609 | 8584.543 |
| 12/12/11 | 9549.609 | 8584.692 |
| 12/13/11 | 9549.609 | 8527.978 |
| 12/14/11 | 9549.609 | 8563.753 |
| 12/15/11 | 9539.674 | 8517.496 |
| 12/16/11 | 9539.674 | 8522.119 |
| 12/19/11 | 9539.674 | 8390.291 |
| 12/20/11 | 9539.674 | 8380.349 |
| 12/21/11 | 9539.674 | 8491.038 |
| 12/22/11 | 9539.674 | 8516.138 |
| 12/23/11 | 9539.674 | 8568.24 |
| 12/28/11 | 9539.674 | 8527.324 |
| 12/29/11 | 9539.674 | 8514.077 |
| 12/30/11 | 9539.674 | 8476.952 |
| 1/3/12 | 9539.674 | 8526.345 |
| 1/4/12 | 9539.674 | 8605.877 |
| 1/5/12 | 9535.002 | 8534.305 |
| 1/6/12 | 9539.638 | 8530.35 |
| 1/9/12 | 9539.638 | 8530.064 |
| 1/10/12 | 9539.638 | 8651.729 |
| 1/11/12 | 9539.638 | 8659.566 |
| 1/12/12 | 9539.638 | 8661.798 |
| 1/13/12 | 9539.638 | 8676.992 |
| 1/16/12 | 9539.638 | 8679.644 |
| 1/17/12 | 9539.638 | 8750.97 |
| 1/18/12 | 9539.638 | 8761.173 |
| 1/19/12 | 9550.955 | 8788.668 |
| 1/20/12 | 9531.74 | 8854.995 |
| 1/23/12 | 9530.323 | 8801.252 |
| 1/24/12 | 9563.699 | 8766.411 |
| 1/25/12 | 9562.251 | 8897.498 |
| 1/27/12 | 9554.883 | 8935.398 |
| 1/30/12 | 9525.429 | 8889.662 |
| 1/31/12 | 9427.838 | 8918.998 |
| 2/1/12 | 9495.368 | 8849.538 |
| 2/2/12 | 9550.246 | 8878.293 |
| 2/3/12 | 9518.158 | 8975.877 |
| 2/6/12 | 9605.79 | 9085.813 |
| 2/7/12 | 9629.029 | 9134.923 |
| 2/8/12 | 9655.2 | 9179.069 |
| 2/9/12 | 9669.397 | 9202.954 |
| 2/10/12 | 9699.839 | 9193.675 |
| 2/13/12 | 9751.789 | 9271.931 |
| 2/14/12 | 9846.95 | 9175.828 |
| 2/15/12 | 9927.796 | 9321.764 |
| 2/16/12 | 9848.208 | 9282.635 |
| 2/17/12 | 9947.76 | 9386.575 |
| 2/20/12 | 9947.76 | 9642.448 |
| 2/21/12 | 9947.76 | 9723 |
| 2/22/12 | 9947.76 | 9816.802 |
| 2/23/12 | 9947.76 | 9821.933 |
| 2/24/12 | 9924.67 | 9899.032 |
| 2/27/12 | 9947.379 | 9914.384 |
| 2/28/12 | 9916.541 | 9955.967 |
| 2/29/12 | 9930.765 | 10025.892 |
| 3/1/12 | 9998.522 | 10024.936 |
| 3/2/12 | 10041.91 | 10146.407 |
| 3/5/12 | 10091.42 | 10133.202 |
| 3/6/12 | 10027.281 | 9903.441 |
| 3/7/12 | 9875.887 | 9631.667 |
| 3/8/12 | 9872.743 | 9800.501 |
| 3/9/12 | 9872.743 | 9833.753 |
| 3/12/12 | 9872.743 | 9763.224 |
| 3/13/12 | 9872.743 | 9875.871 |
| 3/14/12 | 9870.344 | 9977.278 |
| 3/15/12 | 9812.243 | 10072.93 |
| 3/16/12 | 9895.777 | 10141.066 |
| 3/19/12 | 9864.049 | 10175.188 |
| 3/20/12 | 9927.348 | 10194.728 |
| 3/21/12 | 10058.43 | 10143.587 |
| 3/22/12 | 10042.328 | 10176.249 |
| 3/23/12 | 10110.907 | 10207.071 |
| 3/26/12 | 10241.562 | 10208.932 |
| 3/27/12 | 10383.316 | 10368.281 |
| 3/28/12 | 10474.994 | 10438.933 |
| 3/29/12 | 10528.877 | 10456.746 |
| 3/30/12 | 10562.547 | 10529.125 |
| 4/2/12 | 10542.853 | 10552.791 |
| 4/3/12 | 10536.509 | 10570.268 |
| 4/4/12 | 10544.141 | 10537.47 |
| 4/5/12 | 10499.33 | 10369.677 |
| 4/10/12 | 10462.124 | 10363.23 |
| 4/11/12 | 10486.077 | 10244.412 |
| 4/12/12 | 10609.279 | 10371.47 |
| 4/13/12 | 10734.466 | 10392.384 |
| 4/16/12 | 10604.263 | 10399.532 |
| 4/17/12 | 10578.145 | 10341.662 |
| 4/18/12 | 10543.456 | 10485.939 |
| 4/19/12 | 10605.732 | 10479.817 |
| 4/20/12 | 10732.031 | 10600.731 |
| 4/23/12 | 10735.729 | 10570.491 |
| 4/24/12 | 10659.727 | 10583.877 |
| 4/26/12 | 10646.113 | 10581.066 |
| 4/27/12 | 10618.441 | 10598.858 |
| 4/30/12 | 10673.469 | 10668.527 |
| 5/1/12 | 10684.455 | 10655.797 |
| 5/2/12 | 10752.845 | 10677.906 |
| 5/3/12 | 10705.304 | 10640.031 |
| 5/4/12 | 10422.724 | 10433.781 |
| 5/7/12 | 10121.068 | 10193.328 |
| 5/8/12 | 10218.281 | 10251.533 |
| 5/9/12 | 10119.048 | 10124.601 |
| 5/10/12 | 10094.533 | 10230.649 |
| 5/11/12 | 10055.153 | 10203.79 |
| 5/14/12 | 10055.153 | 10225.896 |
| 5/15/12 | 10025.618 | 10137.554 |
| 5/16/12 | 10015.773 | 9978.309 |
| 5/17/12 | 10015.773 | 9974.348 |
| 5/18/12 | 10015.773 | 9778.946 |
| 5/21/12 | 10015.773 | 9763.322 |
| 5/22/12 | 10015.773 | 9844.117 |
| 5/23/12 | 10015.773 | 9813.451 |
| 5/24/12 | 10015.773 | 9775.98 |
| 5/25/12 | 10015.773 | 9786.282 |
| 5/28/12 | 10015.773 | 9800.761 |
| 5/29/12 | 10015.773 | 9824.903 |
| 5/30/12 | 10015.773 | 9820.043 |
| 5/31/12 | 10015.773 | 9936.765 |
| 6/1/12 | 10015.773 | 9924.83 |
| 6/4/12 | 10015.773 | 9802.543 |
| 6/5/12 | 10015.773 | 9857.606 |
| 6/6/12 | 10015.773 | 9897.39 |
| 6/7/12 | 10015.773 | 9938.94 |
| 6/8/12 | 10015.773 | 9926.33 |
| 6/12/12 | 10015.773 | 9881.349 |
| 6/13/12 | 10015.773 | 9873.411 |
| 6/14/12 | 10015.773 | 9841.927 |
| 6/15/12 | 10015.773 | 9898.612 |
| 6/18/12 | 10015.773 | 9960.109 |
| 6/19/12 | 10015.773 | 9913.44 |
| 6/20/12 | 10015.773 | 9998.637 |
| 6/21/12 | 10015.773 | 9996.937 |
| 6/22/12 | 10015.773 | 9958.343 |
| 6/25/12 | 10015.773 | 10003.282 |
| 6/26/12 | 10015.773 | 9962.512 |
| 6/27/12 | 10015.773 | 10012.288 |
| 6/28/12 | 10015.773 | 10008.787 |
| 6/29/12 | 10015.773 | 10067.035 |
| 7/2/12 | 10015.773 | 10068.801 |
| 7/3/12 | 10015.773 | 10106.202 |
| 7/4/12 | 10015.773 | 10105.712 |
| 7/5/12 | 10015.773 | 10117.348 |
| 7/6/12 | 10015.773 | 10125.746 |
| 7/9/12 | 10015.773 | 10153.029 |
| 7/10/12 | 10015.773 | 10142.548 |
| 7/11/12 | 10015.773 | 10133.947 |
| 7/12/12 | 10015.773 | 10147.156 |
| 7/13/12 | 10015.773 | 10169.048 |
| 7/16/12 | 10015.773 | 10169.031 |
| 7/17/12 | 10015.773 | 10170.804 |
| 7/18/12 | 10015.773 | 10129.263 |
| 7/19/12 | 10015.773 | 10157.569 |
| 7/20/12 | 10015.773 | 10167.724 |
| 7/23/12 | 10015.773 | 10144.666 |
| 7/24/12 | 10015.773 | 10156.702 |
| 7/25/12 | 10015.773 | 10157.211 |
| 7/26/12 | 10015.773 | 10202.893 |
| 7/27/12 | 10015.773 | 10266.304 |
| 7/30/12 | 10015.773 | 10280.451 |
| 7/31/12 | 10015.773 | 10278.023 |
| 8/1/12 | 10015.773 | 10306.694 |
| 8/2/12 | 10015.773 | 10334.122 |
| 8/3/12 | 10015.773 | 10336.555 |
| 8/6/12 | 10015.773 | 10354.499 |
| 8/7/12 | 10015.773 | 10355.858 |
| 8/8/12 | 9967.122 | 10369.909 |
| 8/9/12 | 9992.018 | 10328.531 |
| 8/10/12 | 9943.276 | 10257.407 |
| 8/13/12 | 9945.889 | 10273.377 |
| 8/14/12 | 9940.045 | 10265.869 |
| 8/15/12 | 9902.039 | 10265.748 |
| 8/16/12 | 9979.575 | 10355.703 |
| 8/17/12 | 10006.607 | 10402.335 |
| 8/20/12 | 10064.853 | 10436.062 |
| 8/21/12 | 10080.01 | 10436.11 |
| 8/22/12 | 10079.108 | 10431.522 |
| 8/23/12 | 10067.041 | 10449.493 |
| 8/24/12 | 10002.617 | 10643.174 |
| 8/27/12 | 10047.656 | 10687.025 |
| 8/28/12 | 10040.597 | 10713.86 |
| 8/29/12 | 10039.137 | 10710.487 |
| 8/30/12 | 10010.796 | 10638.07 |
| 8/31/12 | 9998.907 | 10648.577 |
| 9/3/12 | 10012.469 | 10654.632 |
| 9/4/12 | 10098.765 | 10663.396 |
| 9/5/12 | 10052.701 | 10629.012 |
| 9/6/12 | 10119.896 | 10706.435 |
| 9/7/12 | 10123.334 | 10696.221 |
| 9/10/12 | 10154.256 | 10677.993 |
| 9/11/12 | 10150.157 | 10698.668 |
| 9/12/12 | 10176.658 | 10732.972 |
| 9/13/12 | 10152.962 | 10705.124 |
| 9/14/12 | 10166.256 | 10724.086 |
| 9/17/12 | 10172.391 | 10719.299 |
| 9/18/12 | 10097.468 | 10675.663 |
| 9/19/12 | 10110.575 | 10646.748 |
| 9/20/12 | 10115.42 | 10664.961 |
| 9/21/12 | 10210.513 | 10636.429 |
| 9/24/12 | 10201.519 | 10658.466 |
| 9/25/12 | 10156.233 | 10588.165 |
| 9/26/12 | 10229.267 | 10582.546 |
| 9/27/12 | 10282.906 | 10598.857 |
| 9/28/12 | 10378.457 | 10658.183 |
| 10/1/12 | 10481.419 | 10672.934 |
| 10/2/12 | 10603.271 | 10844.393 |
| 10/3/12 | 10540.933 | 10855.034 |
| 10/4/12 | 10659.987 | 10939.244 |
| 10/5/12 | 10754.297 | 10985.135 |
| 10/8/12 | 10733.173 | 10952.249 |
| 10/9/12 | 10743.347 | 10993.511 |
| 10/10/12 | 10747.066 | 10987.13 |
| 10/11/12 | 10803.394 | 11052.713 |
| 10/12/12 | 10881.034 | 11063 |
| 10/15/12 | 10880.992 | 11097.138 |
| 10/16/12 | 10877.742 | 11116.895 |
| 10/17/12 | 10995.965 | 11129.615 |
| 10/18/12 | 11092.638 | 11194.702 |
| 10/19/12 | 11155.174 | 11242.88 |
| 10/22/12 | 11162.192 | 11202.481 |
| 10/23/12 | 11133.356 | 11200.453 |
| 10/24/12 | 11109.099 | 11113.525 |
| 10/25/12 | 11039.081 | 11075.289 |
| 10/26/12 | 10927.287 | 11093.42 |
| 10/29/12 | 10902.775 | 11065.921 |
| 10/30/12 | 10965.608 | 11136.264 |
| 10/31/12 | 11116.982 | 11196.165 |
| 11/1/12 | 11098.323 | 11141.15 |
| 11/2/12 | 11054.083 | 11090.169 |
| 11/5/12 | 10994.242 | 11051.5 |
| 11/6/12 | 11101.836 | 11132.869 |
| 11/7/12 | 11189.763 | 11162.615 |
| 11/8/12 | 11154.184 | 11120.293 |
| 11/9/12 | 11281.084 | 11172.412 |
| 11/12/12 | 11289.775 | 11238.214 |
| 11/13/12 | 11309.045 | 11235.019 |
| 11/14/12 | 11267.258 | 11174.891 |
| 11/15/12 | 11263.236 | 11209.575 |
| 11/16/12 | 11259.403 | 11181.422 |
| 11/19/12 | 11259.403 | 11183.223 |
| 11/20/12 | 11259.403 | 11125.745 |
| 11/21/12 | 11259.213 | 11107.67 |
| 11/22/12 | 11259.213 | 11157.851 |
| 11/23/12 | 11258.832 | 11148.097 |
| 11/26/12 | 11263.324 | 11241.092 |
| 11/27/12 | 11242.16 | 11220.093 |
| 11/28/12 | 11295.887 | 11294.724 |
| 11/29/12 | 11292.87 | 11311.706 |
| 11/30/12 | 11219.51 | 11314.161 |
| 12/3/12 | 11265.534 | 11387.489 |
| 12/4/12 | 11231.335 | 11371.753 |
| 12/5/12 | 11291.583 | 11416.125 |
| 12/6/12 | 11283.983 | 11414.632 |
| 12/7/12 | 11252.342 | 11439.894 |
| 12/10/12 | 11281.08 | 11464.306 |
| 12/11/12 | 11313.349 | 11507.063 |
| 12/12/12 | 11356.276 | 11505.421 |
| 12/13/12 | 11326.525 | 11515.692 |
| 12/14/12 | 11338.083 | 11568.862 |
| 12/17/12 | 11308.318 | 11613.74 |
| 12/18/12 | 11332.359 | 11594.874 |
| 12/19/12 | 11410.337 | 11761.705 |
| 12/20/12 | 11417.213 | 11688.933 |
| 12/21/12 | 11392.705 | 11615.652 |
| 12/24/12 | 11373.799 | 11654.862 |
| 12/27/12 | 11454.33 | 11733.931 |
| 12/28/12 | 11511.917 | 11796.559 |
| 12/31/12 | 11457.57 | 11815.916 |
| 1/2/13 | 11537.764 | 11889.463 |
| 1/3/13 | 11602.274 | 11912.341 |
| 1/4/13 | 11573.723 | 11851.558 |
| 1/7/13 | 11594.337 | 11802.797 |
| 1/8/13 | 11598.897 | 11782.898 |
| 1/9/13 | 11650.676 | 11805.189 |
| 1/10/13 | 11647.051 | 11819.843 |
| 1/11/13 | 11667.323 | 11849.864 |
| 1/14/13 | 11649.915 | 11888.411 |
| 1/15/13 | 11741.494 | 11962.341 |
| 1/16/13 | 11811.605 | 11939.336 |
| 1/17/13 | 11640.412 | 11904.144 |
| 1/18/13 | 11673.238 | 11941.78 |
| 1/21/13 | 11740.207 | 11997.98 |
| 1/22/13 | 11782.251 | 11983.828 |
| 1/23/13 | 11940.441 | 12033.915 |
| 1/24/13 | 12004.133 | 11944.58 |
| 1/25/13 | 12020.573 | 12157.606 |
| 1/29/13 | 12113.988 | 12225 |
| 1/30/13 | 12113.367 | 12174.249 |
| 1/31/13 | 12243.255 | 12239.278 |
| 2/1/13 | 12324.445 | 12258.901 |
| 2/4/13 | 12371.212 | 12227.556 |
| 2/5/13 | 12311.113 | 12220.798 |
| 2/6/13 | 12424.922 | 12339.85 |
| 2/7/13 | 12422.517 | 12388.356 |
| 2/8/13 | 12413.546 | 12477.011 |
| 2/11/13 | 12359.661 | 12399.843 |
| 2/12/13 | 12464.989 | 12526.552 |
| 2/13/13 | 12591.287 | 12496.321 |
| 2/14/13 | 12637.723 | 12601.656 |
| 2/15/13 | 12780.303 | 12734.302 |
| 2/18/13 | 12911.326 | 12805.362 |
| 2/19/13 | 12837.993 | 12853.197 |
| 2/20/13 | 12730.754 | 12970.081 |
| 2/21/13 | 12603.78 | 12741.673 |
| 2/22/13 | 12758.9 | 12818.054 |
| 2/25/13 | 12905.022 | 13033.442 |
| 2/26/13 | 12932.395 | 12899.235 |
| 2/27/13 | 12829.034 | 12871.106 |
| 2/28/13 | 12927.473 | 12967.341 |
| 3/1/13 | 12945.924 | 12767.638 |
| 3/4/13 | 12910.176 | 12832.042 |
| 3/5/13 | 12980.831 | 12900.796 |
| 3/6/13 | 13129.486 | 12974.11 |
| 3/7/13 | 13139.009 | 13027.61 |
| 3/8/13 | 13169.157 | 12956.06 |
| 3/11/13 | 13144.042 | 12982.146 |
| 3/12/13 | 13073.687 | 12938.68 |
| 3/13/13 | 12986.03 | 12828 |
| 3/14/13 | 13003.212 | 12847.176 |
| 3/15/13 | 13163.387 | 12979.214 |
| 3/18/13 | 13080.878 | 12847.764 |
| 3/19/13 | 13240.132 | 12789.872 |
| 3/20/13 | 13178.031 | 12776.055 |
| 3/21/13 | 13231.238 | 12823.494 |
| 3/22/13 | 13144.615 | 12821.118 |
| 3/25/13 | 13062.039 | 12756.088 |
| 3/26/13 | 13045.14 | 12795.169 |
| 3/27/13 | 13138.751 | 12862.618 |
| 3/28/13 | 13170.362 | 12941.029 |
| 4/2/13 | 13185.61 | 12989.695 |
| 4/3/13 | 13108.053 | 13039.769 |
| 4/4/13 | 13019.686 | 12955.43 |
| 4/5/13 | 13162.671 | 13010.35 |
| 4/8/13 | 13230.136 | 13140.587 |
| 4/9/13 | 13307.97 | 13236.977 |
| 4/10/13 | 13297.758 | 13324.429 |
| 4/11/13 | 13434.759 | 13292.082 |
| 4/12/13 | 13418.543 | 13414.121 |
| 4/15/13 | 13325.629 | 13395.454 |
| 4/16/13 | 13336.071 | 13196.466 |
| 4/17/13 | 13562.742 | 13455.762 |
| 4/18/13 | 13362.534 | 13469.919 |
| 4/19/13 | 13307.236 | 13456.065 |
| 4/22/13 | 13307.236 | 13432.303 |
| 4/23/13 | 13293.871 | 13551.149 |
| 4/24/13 | 13307.047 | 13625.915 |
| 4/26/13 | 13270.96 | 13669.217 |
| 4/29/13 | 13229.355 | 13702.036 |
| 4/30/13 | 13190.69 | 13852.852 |
| 5/1/13 | 13339.148 | 13869.639 |
| 5/2/13 | 13327.036 | 13606.616 |
| 5/3/13 | 13380.423 | 13689.226 |
| 5/6/13 | 13429.003 | 13699.188 |
| 5/7/13 | 13375.228 | 13662.323 |
| 5/8/13 | 13397.457 | 13805.395 |
| 5/9/13 | 13307.008 | 13848.87 |
| 5/10/13 | 13330.447 | 13812.932 |
| 5/13/13 | 13461.689 | 14002.959 |
| 5/14/13 | 13421.561 | 13892.889 |
| 5/15/13 | 13411.26 | 13967.428 |
| 5/16/13 | 13362.361 | 13788.9 |
| 5/17/13 | 13279.581 | 13878.511 |
| 5/20/13 | 13315.303 | 13956.902 |
| 5/21/13 | 13312.844 | 13972.366 |
| 5/22/13 | 13384.651 | 14106.118 |
| 5/23/13 | 13133.958 | 13463.688 |
| 5/24/13 | 13061.821 | 13075.481 |
| 5/27/13 | 13057.069 | 12656.207 |
| 5/28/13 | 13057.069 | 12657.219 |
| 5/29/13 | 13057.069 | 12776.35 |
| 5/30/13 | 13057.069 | 12470.217 |
| 5/31/13 | 13057.069 | 12503.212 |
| 6/3/13 | 13057.069 | 12450.211 |
| 6/4/13 | 13057.069 | 12488.655 |
| 6/5/13 | 13057.069 | 12484.584 |
| 6/6/13 | 13057.069 | 12409.205 |
| 6/7/13 | 13057.069 | 12317.921 |
| 6/11/13 | 13057.069 | 12364.88 |
| 6/12/13 | 13057.069 | 12361.726 |
| 6/13/13 | 13057.069 | 12308.631 |
| 6/14/13 | 13057.069 | 12266.795 |
| 6/17/13 | 13057.069 | 12344.038 |
| 6/18/13 | 13057.069 | 12331.128 |
| 6/19/13 | 13057.069 | 12350.771 |
| 6/20/13 | 13057.069 | 12336.713 |
| 6/21/13 | 13057.069 | 12295.665 |
| 6/24/13 | 13057.069 | 12314.64 |
| 6/25/13 | 13057.069 | 12288.979 |
| 6/26/13 | 13057.069 | 12323.802 |
| 6/27/13 | 13057.069 | 12358.013 |
| 6/28/13 | 13057.069 | 12368.714 |
| 7/1/13 | 13057.069 | 12368.134 |
| 7/2/13 | 13057.069 | 12416.266 |
| 7/3/13 | 13057.069 | 12403.139 |
| 7/4/13 | 13057.069 | 12412.135 |
| 7/5/13 | 13057.069 | 12437.439 |
| 7/8/13 | 13057.069 | 12399.491 |
| 7/9/13 | 13057.069 | 12431.039 |
| 7/10/13 | 13057.069 | 12430.523 |
| 7/11/13 | 13057.069 | 12427.153 |
| 7/12/13 | 13062.198 | 12422.874 |
| 7/15/13 | 13039.611 | 12400.22 |
| 7/16/13 | 13043.393 | 12391.486 |
| 7/17/13 | 13065.791 | 12407.652 |
| 7/18/13 | 13036.387 | 12391.233 |
| 7/19/13 | 13105.116 | 12477.635 |
| 7/22/13 | 13233.914 | 12567.727 |
| 7/23/13 | 13156.503 | 12507.956 |
| 7/24/13 | 13328.973 | 12660.99 |
| 7/25/13 | 13194.375 | 12554.725 |
| 7/26/13 | 13182.106 | 12548.392 |
| 7/29/13 | 13330.692 | 12720.627 |
| 7/30/13 | 13239.558 | 12671.001 |
| 7/31/13 | 13213.64 | 12561.385 |
| 8/1/13 | 13245.917 | 12612.783 |
| 8/2/13 | 13205.467 | 12545.958 |
| 8/5/13 | 13199.951 | 12491.109 |
| 8/6/13 | 13123.101 | 12456.772 |
| 8/7/13 | 13122.521 | 12484.002 |
| 8/8/13 | 13138.798 | 12458.481 |
| 8/9/13 | 13198.818 | 12484.141 |
| 8/12/13 | 13319.772 | 12561.276 |
| 8/13/13 | 13335.393 | 12520.883 |
| 8/14/13 | 13407.656 | 12526.699 |
| 8/15/13 | 13358.322 | 12473.612 |
| 8/16/13 | 13201.041 | 12332.806 |
| 8/19/13 | 13207.429 | 12347.821 |
| 8/20/13 | 13132.237 | 12347.327 |
| 8/21/13 | 13337.11 | 12503.365 |
| 8/22/13 | 13335.144 | 12537.08 |
| 8/23/13 | 13516.897 | 12664.494 |
| 8/26/13 | 13466.322 | 12667.49 |
| 8/27/13 | 13496.11 | 12762.737 |
| 8/28/13 | 13496.05 | 12748.025 |
| 8/29/13 | 13481.642 | 12721.155 |
| 8/30/13 | 13613.521 | 12809.276 |
| 9/2/13 | 13805.273 | 13003.664 |
| 9/3/13 | 13814.093 | 12998.73 |
| 9/4/13 | 13819.932 | 13024.727 |
| 9/5/13 | 13775.932 | 12947.528 |
| 9/6/13 | 14031.39 | 13136.926 |
| 9/9/13 | 14232.575 | 13307.267 |
| 9/10/13 | 14163.702 | 13279.139 |
| 9/11/13 | 14045.132 | 13213.753 |
| 9/12/13 | 14235.615 | 13361.303 |
| 9/13/13 | 14180.323 | 13305.068 |
| 9/16/13 | 14282.588 | 13424.519 |
| 9/17/13 | 14432.134 | 13557.309 |
| 9/18/13 | 14326.237 | 13517.357 |
| 9/19/13 | 14389.587 | 13571.108 |
| 9/20/13 | 14244.316 | 13437.795 |
| 9/23/13 | 14138.372 | 13413.232 |
| 9/24/13 | 14235.783 | 13475.495 |
| 9/25/13 | 14413.013 | 13611.992 |
| 9/26/13 | 14484.759 | 13679.838 |
| 9/27/13 | 14553.785 | 13700.908 |
| 9/30/13 | 14436.068 | 13607.011 |
| 10/1/13 | 14400.996 | 13546.849 |
| 10/2/13 | 14385.986 | 13632.268 |
| 10/3/13 | 14408.98 | 13669.437 |
| 10/4/13 | 14438.212 | 13724.051 |
| 10/7/13 | 14200.899 | 13488.856 |
| 10/8/13 | 14167.446 | 13412.964 |
| 10/9/13 | 14246.192 | 13555.329 |
| 10/10/13 | 14327.097 | 13647.126 |
| 10/11/13 | 14534.939 | 13853.645 |
| 10/14/13 | 14491.831 | 13842.67 |
| 10/15/13 | 14702.115 | 14046.094 |
| 10/16/13 | 14516.394 | 13909.885 |
| 10/17/13 | 14548.973 | 13992.073 |
| 10/18/13 | 14590.741 | 14011.463 |
| 10/21/13 | 14830.994 | 14251.637 |
| 10/22/13 | 14942.286 | 14325.733 |
| 10/23/13 | 14908.117 | 14306.863 |
| 10/24/13 | 14885.649 | 14300.929 |
| 10/25/13 | 14932.442 | 14251.804 |
| 10/28/13 | 14938.783 | 14258.549 |
| 10/29/13 | 14963.642 | 14251.535 |
| 10/30/13 | 15001.931 | 14334.649 |
| 10/31/13 | 14847.471 | 14114.299 |
| 11/1/13 | 15204.327 | 14497.057 |
| 11/4/13 | 15257.202 | 14645.549 |
| 11/5/13 | 15349.351 | 14689.446 |
| 11/6/13 | 15352.697 | 14692.846 |
| 11/7/13 | 15274.882 | 14558.634 |
| 11/8/13 | 15148.268 | 14410.208 |
| 11/11/13 | 15089.625 | 14285.466 |
| 11/12/13 | 15043.61 | 14239.224 |
| 11/13/13 | 15158.052 | 14370.663 |
| 11/14/13 | 15377.787 | 14367.778 |
| 11/15/13 | 15554.14 | 14539.662 |
| 11/18/13 | 15449.6 | 14415.139 |
| 11/19/13 | 15315.764 | 14230.361 |
| 11/20/13 | 15284.699 | 14181.515 |
| 11/21/13 | 15335.176 | 14253.793 |
| 11/22/13 | 15348.201 | 14230.934 |
| 11/25/13 | 15336.198 | 14131.591 |
| 11/26/13 | 15421.523 | 14272.854 |
| 11/27/13 | 15388.923 | 14214.764 |
| 11/28/13 | 15436.229 | 14196.532 |
| 11/29/13 | 15377.256 | 14103.021 |
| 12/2/13 | 15175.154 | 13871.778 |
| 12/3/13 | 15221.885 | 13933.047 |
| 12/4/13 | 15124.316 | 13893.218 |
| 12/5/13 | 15127.926 | 13952.424 |
| 12/6/13 | 15127.926 | 13932.218 |
| 12/9/13 | 15127.926 | 13921.352 |
| 12/10/13 | 15127.926 | 13916.803 |
| 12/11/13 | 15127.926 | 13945.442 |
| 12/12/13 | 15127.926 | 13887.543 |
| 12/13/13 | 15127.926 | 13907.15 |
| 12/16/13 | 15127.926 | 13958.281 |
| 12/17/13 | 15127.926 | 13916.76 |
| 12/18/13 | 15127.926 | 14055.612 |
| 12/19/13 | 15127.926 | 14163.488 |
| 12/20/13 | 15127.926 | 14140.759 |
| 12/23/13 | 15127.926 | 14304.58 |
| 12/24/13 | 15127.926 | 14345.355 |
| 12/27/13 | 15127.926 | 14313.216 |
| 12/30/13 | 15162.116 | 14375.414 |
| 12/31/13 | 15193.473 | 14472.322 |
| 1/2/14 | 15100.386 | 14380.201 |
| 1/3/14 | 15023.818 | 14334.403 |
| 1/6/14 | 15110.429 | 14244.784 |
| 1/7/14 | 15029.545 | 14269.747 |
| 1/8/14 | 15016.055 | 14340.418 |
| 1/9/14 | 15044.781 | 14496.806 |
| 1/10/14 | 15022.739 | 14472.406 |
| 1/13/14 | 15068.484 | 14530.047 |
| 1/14/14 | 14911.45 | 14260.591 |
| 1/15/14 | 14939.662 | 14439.127 |
| 1/16/14 | 14939.662 | 14594.789 |
| 1/17/14 | 14963.863 | 14614.215 |
| 1/20/14 | 15081.203 | 14689.819 |
| 1/21/14 | 15131.529 | 14839.777 |
| 1/22/14 | 15008.66 | 14740.491 |
| 1/23/14 | 15031.673 | 14734.763 |
| 1/24/14 | 15037.812 | 14786.71 |
| 1/28/14 | 15037.812 | 14469.905 |
| 1/29/14 | 15037.812 | 14568.303 |
| 1/30/14 | 15037.812 | 14424.321 |
| 1/31/14 | 15037.812 | 14412.483 |
| 2/3/14 | 15037.812 | 14428.908 |
| 2/4/14 | 15037.812 | 14162.08 |
| 2/5/14 | 15037.812 | 14179.277 |
| 2/6/14 | 15037.812 | 14233.248 |
| 2/7/14 | 15037.812 | 14425.765 |
| 2/10/14 | 15037.812 | 14469.349 |
| 2/11/14 | 15037.812 | 14487.882 |
| 2/12/14 | 15037.812 | 14448.917 |
| 2/13/14 | 15037.812 | 14510.72 |
| 2/14/14 | 14963.033 | 14449.486 |
| 2/17/14 | 14905.08 | 14430.886 |
| 2/18/14 | 14816.787 | 14335.171 |
| 2/19/14 | 14801.71 | 14452.586 |
| 2/20/14 | 14733.463 | 14333.606 |
| 2/21/14 | 14795.482 | 14446.827 |
| 2/24/14 | 15138.096 | 14567.836 |
| 2/25/14 | 15017.149 | 14644.991 |
| 2/26/14 | 15219.142 | 14665.627 |
| 2/27/14 | 14988.249 | 14628.293 |
| 2/28/14 | 15074.562 | 14647.989 |
| 3/3/14 | 15068.044 | 14811.709 |
| 3/4/14 | 15143.598 | 14855.845 |
| 3/5/14 | 15256.816 | 14979.689 |
| 3/6/14 | 15426.527 | 15152.57 |
| 3/7/14 | 15384.781 | 15094.942 |
| 3/10/14 | 15417.057 | 15116.223 |
| 3/11/14 | 15391.094 | 15150.524 |
| 3/12/14 | 15325.188 | 15205.401 |
| 3/13/14 | 15531.183 | 15362.759 |
| 3/14/14 | 15580.055 | 15207.815 |
| 3/17/14 | 15745.847 | 15277.252 |
| 3/18/14 | 15874.141 | 15417.379 |
| 3/19/14 | 16334.094 | 15924.775 |
| 3/20/14 | 16111.529 | 15829.017 |
| 3/21/14 | 16364.413 | 15929.566 |
| 3/24/14 | 16260.957 | 15821.943 |
| 3/25/14 | 16335.06 | 15821.472 |
| 3/26/14 | 16415.884 | 15927.104 |
| 3/27/14 | 16404.096 | 15864.306 |
| 3/28/14 | 15885.816 | 15576.553 |
| 3/31/14 | 15995.481 | 15514.431 |
| 4/1/14 | 16094.359 | 15596.797 |
| 4/2/14 | 16138.541 | 15488.098 |
| 4/3/14 | 16261.366 | 15539.681 |
| 4/4/14 | 16323.802 | 15503.48 |
| 4/7/14 | 16257.642 | 15302.718 |
| 4/8/14 | 16102.345 | 15122.055 |
| 4/9/14 | 16180.967 | 15184.402 |
| 4/10/14 | 16338.001 | 15343.58 |
| 4/11/14 | 15988.113 | 14975.971 |
| 4/14/14 | 15666.255 | 14639.477 |
| 4/15/14 | 15795.505 | 14743.353 |
| 4/16/14 | 15922.262 | 15006.777 |
| 4/17/14 | 16045.674 | 14969.337 |
| 4/22/14 | 16100.208 | 15047.074 |
| 4/23/14 | 16334.466 | 15383.447 |
| 4/24/14 | 16309.3 | 15375.511 |
| 4/28/14 | 16287.545 | 15241.711 |
| 4/29/14 | 16035.894 | 15041.492 |
| 4/30/14 | 16249.794 | 15272.928 |
| 5/1/14 | 16186.875 | 15312.672 |
| 5/2/14 | 16152.147 | 15461.968 |
| 5/5/14 | 16230.399 | 15530.903 |
| 5/6/14 | 16366.892 | 15752.001 |
| 5/7/14 | 16423.821 | 15656.659 |
| 5/8/14 | 16240.259 | 15684.562 |
| 5/9/14 | 16222.869 | 15610.789 |
| 5/12/14 | 16218.461 | 15450.264 |
| 5/13/14 | 16354.266 | 15583.439 |
| 5/14/14 | 16349.576 | 15626.032 |
| 5/15/14 | 16734.589 | 15868.806 |
| 5/16/14 | 16473.574 | 15645.437 |
| 5/19/14 | 16444.276 | 15676.893 |
| 5/20/14 | 16817.604 | 15908.745 |
| 5/21/14 | 16560.555 | 15627.262 |
| 5/22/14 | 17022.787 | 15940.986 |
| 5/23/14 | 17038.775 | 15960.013 |
| 5/26/14 | 17043.029 | 16005.558 |
| 5/27/14 | 16870.675 | 16041.276 |
| 5/28/14 | 16867.581 | 16081.147 |
| 5/29/14 | 17118.024 | 16188.922 |
| 5/30/14 | 17344.531 | 16255.483 |
| 6/2/14 | 17914.828 | 16680.488 |
| 6/3/14 | 18109.037 | 16725.151 |
| 6/4/14 | 18357.645 | 17042.518 |
| 6/5/14 | 18819.437 | 17418.812 |
| 6/6/14 | 18200.908 | 16966.825 |
| 6/10/14 | 17810.399 | 16750.503 |
| 6/11/14 | 18107.466 | 16575.154 |
| 6/12/14 | 19296.648 | 16354.81 |
| 6/13/14 | 18744.858 | 16148.826 |
| 6/16/14 | 18744.858 | 16089.889 |
| 6/17/14 | 18744.858 | 16088.778 |
| 6/18/14 | 18744.858 | 16200.007 |
| 6/19/14 | 18744.858 | 16072.606 |
| 6/20/14 | 18744.858 | 16035.446 |
| 6/23/14 | 18744.858 | 16045.12 |
| 6/24/14 | 18744.858 | 16046.209 |
| 6/25/14 | 18744.858 | 15991.988 |
| 6/26/14 | 18744.858 | 16078.925 |
| 6/27/14 | 18744.858 | 16131.3 |
| 6/30/14 | 18721.527 | 16001.489 |
| 7/1/14 | 18721.527 | 15926.421 |
| 7/2/14 | 18721.527 | 16026.678 |
| 7/3/14 | 18721.527 | 16085.276 |
| 7/4/14 | 18696.26 | 16079.099 |
| 7/7/14 | 18708.703 | 16046.645 |
| 7/8/14 | 18714.055 | 16074.677 |
| 7/9/14 | 18740.681 | 16062.573 |
| 7/10/14 | 18893.081 | 16159.865 |
| 7/11/14 | 18845.313 | 16179.362 |
| 7/14/14 | 18788.581 | 16212.07 |
| 7/15/14 | 18706.436 | 16210.84 |
| 7/16/14 | 18787.919 | 16196.92 |
| 7/17/14 | 18795.01 | 16160.954 |
| 7/18/14 | 18821.447 | 16132.353 |
| 7/21/14 | 18721.345 | 16112.56 |
| 7/22/14 | 18899.063 | 16262.566 |
| 7/23/14 | 18967.865 | 16362.866 |
| 7/24/14 | 18528.687 | 16088.568 |
| 7/25/14 | 18613.265 | 16086.125 |
| 7/28/14 | 18596.384 | 16130.39 |
| 7/29/14 | 18551.954 | 16074.615 |
| 7/30/14 | 18751.469 | 16297.965 |
| 7/31/14 | 18750.207 | 16331.394 |
| 8/1/14 | 18403.72 | 15939.907 |
| 8/4/14 | 18561.256 | 16084.518 |
| 8/5/14 | 18659.827 | 16113.778 |
| 8/6/14 | 18464.004 | 15950.343 |
| 8/7/14 | 18395.823 | 15910.722 |
| 8/8/14 | 18493.583 | 15829.309 |
| 8/11/14 | 18408.061 | 15806.584 |
| 8/12/14 | 18408.061 | 15928.671 |
| 8/13/14 | 18381.781 | 16087.174 |
| 8/14/14 | 18407.102 | 16126.417 |
| 8/15/14 | 18468.486 | 16069.51 |
| 8/18/14 | 18506.851 | 16180.203 |
| 8/19/14 | 18494.076 | 16293.088 |
| 8/20/14 | 18489.164 | 16313.974 |
| 8/21/14 | 18655.943 | 16287.245 |
| 8/22/14 | 18697.052 | 16376.95 |
| 8/25/14 | 18821.135 | 16415.575 |
| 8/26/14 | 18470.568 | 16040.581 |
| 8/27/14 | 18360.84 | 15951.128 |
| 8/28/14 | 18412.221 | 15907.466 |
| 8/29/14 | 18327.709 | 15864.251 |
| 9/1/14 | 18161.442 | 15846.662 |
| 9/2/14 | 18312.211 | 15959.276 |
| 9/3/14 | 18288.398 | 15930.186 |
| 9/4/14 | 18231.04 | 15887.95 |
| 9/5/14 | 18153.609 | 15792.86 |
| 9/8/14 | 18149.574 | 15759.656 |
| 9/9/14 | 18188.43 | 15811.68 |
| 9/10/14 | 18391.66 | 15925.512 |
| 9/11/14 | 18355.46 | 15873.257 |
| 9/12/14 | 18411.593 | 15815.086 |
| 9/15/14 | 18594.204 | 15949.532 |
| 9/16/14 | 18579.32 | 16098.342 |
| 9/17/14 | 18579.32 | 15949.042 |
| 9/18/14 | 18579.32 | 15940.794 |
| 9/19/14 | 18579.32 | 16202.281 |
| 9/22/14 | 18579.32 | 16058.503 |
| 9/23/14 | 18579.32 | 16114.853 |
| 9/24/14 | 18579.32 | 16087.873 |
| 9/25/14 | 18579.32 | 15927.928 |
| 9/26/14 | 18579.32 | 15965.075 |
| 9/29/14 | 18579.32 | 15832.274 |
| 9/30/14 | 18579.32 | 15909.163 |
| 10/1/14 | 18579.32 | 16071.529 |
| 10/2/14 | 18579.32 | 16488.576 |
| 10/3/14 | 18579.32 | 16660.278 |
| 10/6/14 | 18579.32 | 16708.183 |
| 10/7/14 | 18579.32 | 16698.388 |
| 10/8/14 | 18579.32 | 17539.707 |
| 10/9/14 | 18579.32 | 17106.174 |
| 10/10/14 | 18579.32 | 16595.464 |
| 10/13/14 | 18579.32 | 16575.186 |
| 10/14/14 | 18579.32 | 16505.261 |
| 10/15/14 | 18579.32 | 16431.713 |
| 10/16/14 | 18579.32 | 16562.551 |
| 10/17/14 | 18579.32 | 16537.178 |
| 10/20/14 | 18579.32 | 16613.271 |
| 10/21/14 | 18579.32 | 16651.985 |
| 10/22/14 | 18579.32 | 16779.797 |
| 10/23/14 | 18579.32 | 16720.365 |
| 10/24/14 | 18579.32 | 16711.225 |
| 10/27/14 | 18579.32 | 16750.716 |
| 10/28/14 | 18579.32 | 16662.069 |
| 10/29/14 | 18579.32 | 16544.77 |
| 10/30/14 | 18579.32 | 16567.792 |
| 10/31/14 | 18579.32 | 16685.415 |
| 11/3/14 | 18579.32 | 16751.112 |
| 11/4/14 | 18579.32 | 16885.578 |
| 11/5/14 | 18579.32 | 16991.078 |
| 11/6/14 | 18648.803 | 16919.52 |
| 11/7/14 | 18683.639 | 16982.075 |
| 11/10/14 | 18722.757 | 17073.484 |
| 11/11/14 | 18604.272 | 16991.847 |
| 11/12/14 | 18603.855 | 17002.389 |
| 11/13/14 | 18614.107 | 17007.179 |
| 11/14/14 | 18614.107 | 17102.04 |
| 11/17/14 | 18614.107 | 17258.723 |
| 11/18/14 | 18614.107 | 17219.26 |
| 11/19/14 | 18614.107 | 17337.924 |
| 11/20/14 | 18614.107 | 17188.423 |
| 11/21/14 | 18614.107 | 17042.98 |
| 11/24/14 | 18614.107 | 17155.225 |
| 11/25/14 | 18614.107 | 16993.605 |
| 11/26/14 | 18614.107 | 17015.136 |
| 11/27/14 | 18614.107 | 16984.941 |
| 11/28/14 | 18614.107 | 17012.144 |
| 12/1/14 | 18614.107 | 16930.345 |
| 12/2/14 | 18614.107 | 16871.087 |
| 12/3/14 | 18614.107 | 16862.695 |
| 12/4/14 | 18614.107 | 16951.361 |
| 12/5/14 | 18614.107 | 16995.79 |
| 12/8/14 | 18614.107 | 16885.112 |
| 12/9/14 | 18614.107 | 16788.3 |
| 12/10/14 | 18614.107 | 16793.197 |
| 12/11/14 | 18614.107 | 16722.823 |
| 12/12/14 | 18614.107 | 16780.714 |
| 12/15/14 | 18614.107 | 16774.89 |
| 12/16/14 | 18614.107 | 16810.988 |
| 12/17/14 | 18614.107 | 16855.693 |
| 12/18/14 | 18614.107 | 16835.979 |
| 12/19/14 | 18614.107 | 16965.957 |
| 12/22/14 | 18614.107 | 17139.5 |
| 12/23/14 | 18648.674 | 17170.775 |
| 12/24/14 | 18610.006 | 17203.904 |
| 12/29/14 | 18624.86 | 17305.473 |
| 12/30/14 | 18610.62 | 17321.852 |
| 12/31/14 | 18639.518 | 17357.691 |
| 1/2/15 | 18631.041 | 17289.123 |
| 1/5/15 | 18714.445 | 17348.304 |
| 1/6/15 | 18646.219 | 17238.749 |
| 1/7/15 | 18611.362 | 17297.78 |
| 1/8/15 | 18611.362 | 17287.899 |
| 1/9/15 | 18487.76 | 17232.58 |
| 1/12/15 | 18563.427 | 17238.191 |
| 1/13/15 | 18551.732 | 17310.196 |
| 1/14/15 | 18548.15 | 17283.321 |
| 1/15/15 | 18529.559 | 17267.296 |
| 1/16/15 | 18529.559 | 17315.599 |
| 1/19/15 | 18529.559 | 17293.84 |
| 1/20/15 | 18529.559 | 17188.047 |
| 1/21/15 | 18529.559 | 17239.585 |
| 1/22/15 | 18608.582 | 17093.085 |
| 1/23/15 | 18643.661 | 17191.521 |
| 1/27/15 | 18709.253 | 17417.371 |
| 1/28/15 | 18712.03 | 17437.289 |
| 1/29/15 | 18699.414 | 17501.746 |
| 1/30/15 | 18647.691 | 17465.166 |
| 2/2/15 | 18590.683 | 17485.368 |
| 2/3/15 | 18534.939 | 17654.958 |
| 2/4/15 | 18497.117 | 17794.403 |
| 2/5/15 | 18503.41 | 17823.961 |
| 2/6/15 | 18564.704 | 17979.798 |
| 2/9/15 | 18609.59 | 17997.58 |
| 2/10/15 | 18588.144 | 17963.838 |
| 2/11/15 | 18603.533 | 17987.541 |
| 2/12/15 | 18454.42 | 17782.71 |
| 2/13/15 | 18613.152 | 17993.035 |
| 2/16/15 | 18700.189 | 18010.965 |
| 2/17/15 | 18712.516 | 18113.577 |
| 2/18/15 | 18710.361 | 18060.948 |
| 2/19/15 | 18764.46 | 18189.302 |
| 2/20/15 | 18738.638 | 18255.883 |
| 2/23/15 | 18708.78 | 18200.055 |
| 2/24/15 | 18743.775 | 18051.676 |
| 2/25/15 | 18780.698 | 18183.359 |
| 2/26/15 | 18761.32 | 18070.786 |
| 2/27/15 | 18980.184 | 18164.21 |
| 3/2/15 | 18956.429 | 18341.117 |
| 3/3/15 | 18824.179 | 18270.973 |
| 3/4/15 | 18956.905 | 18160.896 |
| 3/5/15 | 19010.702 | 18228.91 |
| 3/6/15 | 19156.374 | 18364.159 |
| 3/9/15 | 19005.038 | 17965.316 |
| 3/10/15 | 18984.023 | 18066.015 |
| 3/11/15 | 19067.837 | 18081.402 |
| 3/12/15 | 19075.674 | 18161.848 |
| 3/13/15 | 19154.237 | 18394.201 |
| 3/16/15 | 19239.717 | 18321.735 |
| 3/17/15 | 19180.643 | 18299.024 |
| 3/18/15 | 19122.315 | 18111.338 |
| 3/19/15 | 19384.308 | 18277.638 |
| 3/20/15 | 19288.319 | 18445.052 |
| 3/23/15 | 19560.438 | 18436.964 |
| 3/24/15 | 19778.095 | 18495.507 |
| 3/25/15 | 20071.246 | 18553.72 |
| 3/26/15 | 19683.479 | 18338.044 |
| 3/27/15 | 19723.892 | 18321.536 |
| 3/30/15 | 19664.016 | 18226.319 |
| 3/31/15 | 20103.809 | 18302.685 |
| 4/1/15 | 20302.745 | 18290.706 |
| 4/2/15 | 20452.453 | 18461.658 |
| 4/7/15 | 20481.974 | 18548.391 |
| 4/8/15 | 20758.735 | 18841.875 |
| 4/9/15 | 20701.82 | 18796.338 |
| 4/10/15 | 20630.548 | 18858.035 |
| 4/13/15 | 20547.756 | 18902.838 |
| 4/14/15 | 20520.333 | 18744.608 |
| 4/15/15 | 20571.256 | 18756.102 |
| 4/16/15 | 20645.189 | 18726.824 |
| 4/17/15 | 20630.51 | 18598.989 |
| 4/20/15 | 20743.281 | 18561.04 |
| 4/21/15 | 20679.412 | 18514.865 |
| 4/22/15 | 20586.75 | 18572.861 |
| 4/23/15 | 20365.317 | 18554.56 |
| 4/24/15 | 20582.344 | 18597.174 |
| 4/27/15 | 20706.011 | 18741.875 |
| 4/28/15 | 20703.681 | 18614.081 |
| 4/29/15 | 20746.54 | 18489.501 |
| 4/30/15 | 21035.01 | 18427.382 |
| 5/1/15 | 21150.642 | 18582.413 |
| 5/4/15 | 21417.246 | 18737.612 |
| 5/5/15 | 21305.343 | 18770.912 |
| 5/6/15 | 21228.955 | 18694.023 |
| 5/7/15 | 21123.077 | 18472.22 |
| 5/8/15 | 21123.077 | 18624.533 |
| 5/11/15 | 21123.077 | 18622.562 |
| 5/12/15 | 21123.077 | 18535.973 |
| 5/13/15 | 21123.077 | 18531.057 |
| 5/14/15 | 21123.077 | 18539.632 |
| 5/15/15 | 21123.077 | 18609.914 |
| 5/18/15 | 21123.077 | 18670.98 |
| 5/19/15 | 21123.077 | 18697.521 |
| 5/20/15 | 21123.077 | 18704.955 |
| 5/21/15 | 21123.077 | 18547.682 |
| 5/22/15 | 21123.077 | 18597.95 |
| 5/25/15 | 21123.077 | 18555.037 |
| 5/26/15 | 21123.077 | 18579.253 |
| 5/27/15 | 21123.077 | 18571.351 |
| 5/28/15 | 21123.077 | 18560.285 |
| 5/29/15 | 21123.077 | 18631.76 |
| 6/1/15 | 21123.077 | 18487.483 |
| 6/2/15 | 21123.077 | 18461.584 |
| 6/3/15 | 21123.077 | 18435.849 |
| 6/4/15 | 21123.077 | 18384.557 |
| 6/5/15 | 21123.077 | 18381.957 |
| 6/9/15 | 21123.077 | 18326.036 |
| 6/10/15 | 21123.077 | 18288.735 |
| 6/11/15 | 21123.077 | 18266.091 |
| 6/12/15 | 21123.077 | 18215.681 |
| 6/15/15 | 21123.077 | 18167.305 |
| 6/16/15 | 21123.077 | 18133.552 |
| 6/17/15 | 21123.077 | 18170.398 |
| 6/18/15 | 21123.077 | 18163.27 |
| 6/19/15 | 21123.077 | 18175.984 |
| 6/22/15 | 21123.077 | 18273.205 |
| 6/23/15 | 21123.077 | 18323.837 |
| 6/24/15 | 21123.077 | 18293.174 |
| 6/25/15 | 21123.077 | 18258.947 |
| 6/26/15 | 21123.077 | 18228.758 |
| 6/29/15 | 21123.077 | 18209.39 |
| 6/30/15 | 21123.077 | 18143.901 |
| 7/1/15 | 21123.077 | 18137.246 |
| 7/2/15 | 21123.077 | 18157.214 |
| 7/3/15 | 21123.077 | 18137.246 |
| 7/6/15 | 21123.077 | 18143.901 |
| 7/7/15 | 21123.077 | 18183.837 |
| 7/8/15 | 21123.077 | 18157.212 |
| 7/9/15 | 21123.077 | 18117.276 |
| 7/10/15 | 21123.077 | 18157.212 |
| 7/13/15 | 21123.077 | 18163.868 |
| 7/14/15 | 21123.077 | 18163.868 |
| 7/15/15 | 21123.077 | 18170.525 |
| 7/16/15 | 21123.077 | 18170.525 |
| 7/17/15 | 21123.077 | 18143.9 |
| 7/20/15 | 21123.077 | 18170.524 |
| 7/21/15 | 21123.077 | 18183.836 |
| 7/22/15 | 21067.921 | 18169.609 |
| 7/23/15 | 21067.921 | 18240.639 |
| 7/24/15 | 21067.921 | 18196.44 |
| 7/27/15 | 21067.921 | 18225.869 |
| 7/28/15 | 21067.921 | 18188.43 |
| 7/29/15 | 21067.921 | 18175.221 |
| 7/30/15 | 21067.921 | 18174.18 |
| 7/31/15 | 21067.921 | 18191.754 |
| 8/3/15 | 21029.562 | 18181.178 |
| 8/4/15 | 21006.665 | 18228.278 |
| 8/5/15 | 21152.87 | 18345.32 |
| 8/6/15 | 21044.332 | 18263.404 |
| 8/7/15 | 21071.961 | 18128.967 |
| 8/10/15 | 21071.961 | 18165.021 |
| 8/11/15 | 21071.961 | 18099.826 |
| 8/12/15 | 21071.961 | 17971.5 |
| 8/13/15 | 21071.961 | 17954.916 |
| 8/14/15 | 21071.961 | 17961.375 |
| 8/17/15 | 21071.961 | 17954.917 |
| 8/18/15 | 21071.961 | 17924.18 |
| 8/19/15 | 21071.961 | 17970.387 |
| 8/20/15 | 21071.961 | 17893.319 |
| 8/21/15 | 21071.961 | 17855.666 |
| 8/24/15 | 21071.961 | 17710.154 |
| 8/25/15 | 21071.961 | 17652.599 |
| 8/26/15 | 21071.961 | 17663.561 |
| 8/27/15 | 21071.961 | 17597.856 |
| 8/28/15 | 21071.961 | 17580.508 |
| 8/31/15 | 21071.961 | 17609.093 |
| 9/1/15 | 21071.961 | 17562.886 |
| 9/2/15 | 21071.961 | 17617.835 |
| 9/3/15 | 21071.961 | 17543.182 |
| 9/4/15 | 21071.961 | 17587.031 |
| 9/7/15 | 21071.961 | 17606.668 |
| 9/8/15 | 21071.961 | 17648.229 |
| 9/9/15 | 21071.961 | 17687.775 |
| 9/10/15 | 21071.961 | 17753.62 |
| 9/11/15 | 21071.961 | 17775.613 |
| 9/14/15 | 21071.961 | 17863.037 |
| 9/15/15 | 21071.961 | 17884.755 |
| 9/16/15 | 21071.961 | 17898.075 |
| 9/17/15 | 21071.961 | 17854.019 |
| 9/18/15 | 21071.961 | 17919.931 |
| 9/21/15 | 21071.961 | 17906.749 |
| 9/22/15 | 21071.961 | 17950.461 |
| 9/23/15 | 21071.961 | 17891.417 |
| 9/24/15 | 21071.961 | 17862.831 |
| 9/25/15 | 21071.961 | 17906.749 |
| 9/28/15 | 21071.961 | 17869.56 |
| 9/29/15 | 21071.961 | 17854.364 |
| 9/30/15 | 21071.961 | 17821.408 |
| 10/1/15 | 21071.961 | 17834.591 |
| 10/2/15 | 21071.961 | 17858.666 |
| 10/5/15 | 21071.961 | 17884.825 |
| 10/6/15 | 21071.961 | 17891.416 |
| 10/7/15 | 21071.961 | 17878.301 |
| 10/8/15 | 21071.961 | 17882.673 |
| 10/9/15 | 21071.961 | 17904.667 |
| 10/12/15 | 21071.961 | 17961.768 |
| 10/13/15 | 21071.961 | 17944.146 |
| 10/14/15 | 21071.961 | 17968.015 |
| 10/15/15 | 21071.961 | 18059.81 |
| 10/16/15 | 21071.961 | 18044.546 |
| 10/19/15 | 21071.961 | 18184.631 |
| 10/20/15 | 21071.961 | 18145.083 |
| 10/21/15 | 21071.961 | 18094.78 |
| 10/22/15 | 21071.961 | 18023.483 |
| 10/23/15 | 21071.961 | 18112.807 |
| 10/26/15 | 21067.296 | 18108.165 |
| 10/27/15 | 21049.538 | 18097.99 |
| 10/28/15 | 20996.788 | 18077.28 |
| 10/29/15 | 20757.494 | 17816.105 |
| 10/30/15 | 20769.303 | 17884.113 |
| 11/2/15 | 20769.303 | 17905.758 |
| 11/3/15 | 20769.303 | 17912.152 |
| 11/4/15 | 20769.303 | 17924.664 |
| 11/5/15 | 20769.303 | 17904.115 |
| 11/6/15 | 20769.303 | 17905.164 |
| 11/9/15 | 20769.303 | 17940.553 |
| 11/10/15 | 20769.303 | 17972.376 |
| 11/11/15 | 20769.303 | 18112.967 |
| 11/12/15 | 20769.303 | 18068.337 |
| 11/13/15 | 20769.303 | 17839.769 |
| 11/16/15 | 20769.303 | 17907.237 |
| 11/17/15 | 20769.303 | 18052.232 |
| 11/18/15 | 20769.303 | 18035.469 |
| 11/19/15 | 20769.303 | 18168.422 |
| 11/20/15 | 20878.94 | 18356.044 |
| 11/23/15 | 20979.015 | 18426.836 |
| 11/24/15 | 21020.954 | 18401.799 |
| 11/25/15 | 20939.235 | 18310.576 |
| 11/26/15 | 21010.669 | 18620.618 |
| 11/27/15 | 20958.947 | 18498.223 |
| 11/30/15 | 21108.959 | 18594.728 |
| 12/1/15 | 21359.716 | 18696.313 |
| 12/2/15 | 21337.18 | 18686.331 |
| 12/3/15 | 21305.795 | 18592.748 |
| 12/4/15 | 21091.277 | 18393.934 |
| 12/7/15 | 21297.497 | 18462.863 |
| 12/8/15 | 21297.497 | 18368.539 |
| 12/9/15 | 21297.497 | 18483.869 |
| 12/10/15 | 21297.497 | 18413.991 |
| 12/11/15 | 21297.497 | 18425.726 |
| 12/14/15 | 21297.497 | 18322.875 |
| 12/15/15 | 21297.497 | 18296.335 |
| 12/16/15 | 21297.497 | 18390.874 |
| 12/17/15 | 21297.497 | 18461.975 |
| 12/18/15 | 21297.497 | 18547.337 |
| 12/21/15 | 21297.497 | 18577.902 |
| 12/22/15 | 21297.497 | 18572.152 |
| 12/23/15 | 21297.497 | 18639.186 |
| 12/24/15 | 21297.497 | 18630.099 |
| 12/29/15 | 21338.003 | 19023.547 |
| 12/30/15 | 21338.003 | 19260.515 |
| 12/31/15 | 21281.835 | 19036.007 |
| 1/4/16 | 21363.945 | 19235.676 |
| 1/5/16 | 21342.284 | 18881.116 |
| 1/6/16 | 21394.126 | 18525.607 |
| 1/7/16 | 21341.144 | 18301.421 |
| 1/8/16 | 21341.144 | 18310.019 |
| 1/11/16 | 21341.144 | 18213.764 |
| 1/12/16 | 21341.144 | 18208.056 |
| 1/13/16 | 21341.144 | 18205.33 |
| 1/14/16 | 21341.144 | 18070.714 |
| 1/15/16 | 21341.144 | 17952.85 |
| 1/18/16 | 21341.144 | 17739.293 |
| 1/19/16 | 21341.144 | 17895.445 |
| 1/20/16 | 21341.144 | 17743.869 |
| 1/21/16 | 21341.144 | 17862.622 |
| 1/22/16 | 21341.144 | 18001.614 |
| 1/25/16 | 21341.144 | 18099.075 |
| 1/27/16 | 21341.144 | 18023.247 |
| 1/28/16 | 21341.144 | 18016.903 |
| 1/29/16 | 21341.144 | 18028.663 |
| 2/1/16 | 21341.144 | 18157.535 |
| 2/2/16 | 21341.144 | 18072.997 |
| 2/3/16 | 21341.144 | 17932.565 |
| 2/4/16 | 21341.144 | 17989.553 |
| 2/5/16 | 21341.144 | 17960.179 |
| 2/8/16 | 21341.144 | 17227.873 |
| 2/9/16 | 21341.144 | 17180.275 |
| 2/10/16 | 21341.144 | 17148.521 |
| 2/11/16 | 21341.144 | 17230.64 |
| 2/12/16 | 21341.144 | 17180.952 |
| 2/15/16 | 21341.144 | 17164.115 |
| 2/16/16 | 21341.144 | 17274.104 |
| 2/17/16 | 21341.144 | 17231.493 |
| 2/18/16 | 21341.144 | 17343.454 |
| 2/19/16 | 21341.144 | 17807.128 |
| 2/22/16 | 21341.144 | 17885.882 |
| 2/23/16 | 21341.144 | 17996.51 |
| 2/24/16 | 21341.144 | 17871.414 |
| 2/25/16 | 21341.144 | 17764.856 |
| 2/26/16 | 21341.144 | 17951.143 |
| 2/29/16 | 21341.144 | 18032.844 |
| 3/1/16 | 21341.144 | 18163.896 |
| 3/2/16 | 21341.144 | 18325.626 |
| 3/3/16 | 21341.144 | 18381.836 |
| 3/4/16 | 21324.538 | 18380.301 |
| 3/7/16 | 21319.064 | 18360.022 |
| 3/8/16 | 21346.427 | 18516.123 |
| 3/9/16 | 21319.065 | 18470.086 |
| 3/10/16 | 21308.122 | 18390.966 |
| 3/11/16 | 21258.875 | 18295.739 |
| 3/14/16 | 21267.814 | 18298.692 |
| 3/15/16 | 21326.163 | 18320.68 |
| 3/16/16 | 21305.99 | 18302.599 |
| 3/17/16 | 21315.218 | 18297.333 |
| 3/18/16 | 21282.316 | 18252.23 |
| 3/21/16 | 21345.184 | 18364.233 |
| 3/22/16 | 21441.493 | 18400.942 |
| 3/23/16 | 21454.023 | 18453.256 |
| 3/24/16 | 21246.512 | 18254.831 |
| 3/29/16 | 21306.127 | 18315.554 |
| 3/30/16 | 21431.043 | 18408.973 |
| 3/31/16 | 21431.043 | 18833.979 |
| 4/1/16 | 21425.021 | 18684.264 |
| 4/4/16 | 21445.43 | 18702.145 |
| 4/5/16 | 21445.43 | 18674.342 |
| 4/6/16 | 21445.43 | 18722.748 |
| 4/7/16 | 21445.43 | 18787.441 |
| 4/8/16 | 21445.43 | 18778.885 |
| 4/11/16 | 21445.43 | 18787.095 |
| 4/12/16 | 21445.43 | 18900.738 |
| 4/13/16 | 21445.43 | 18862.037 |
| 4/14/16 | 21566.063 | 19012.345 |
| 4/15/16 | 21558.592 | 19014.014 |
| 4/18/16 | 21602.283 | 19137.369 |
| 4/19/16 | 21628.938 | 19119.922 |
| 4/20/16 | 21703.681 | 19217.906 |
| 4/21/16 | 21719.731 | 19294.793 |
| 4/22/16 | 21560.473 | 19042.096 |
| 4/26/16 | 21669.774 | 19101.668 |
| 4/27/16 | 21674.03 | 19081.086 |
| 4/28/16 | 21814.196 | 19193.792 |
| 4/29/16 | 21897.081 | 19262.454 |
| 5/2/16 | 21829.196 | 19143.951 |
| 5/3/16 | 21786.976 | 19322.52 |
| 5/4/16 | 21682.161 | 19209.132 |
| 5/5/16 | 21940.899 | 19618.636 |
| 5/6/16 | 22163.147 | 19682.269 |
| 5/9/16 | 22188.012 | 19915.075 |
| 5/10/16 | 22005.338 | 19853.681 |
| 5/11/16 | 22259.554 | 20130.832 |
| 5/12/16 | 22144.782 | 20188.294 |
| 5/13/16 | 22415.232 | 20202.284 |
| 5/16/16 | 22219.614 | 20020.28 |
| 5/17/16 | 22269.342 | 20058.508 |
| 5/18/16 | 21983.116 | 19965.23 |
| 5/19/16 | 21814.316 | 19891.874 |
| 5/20/16 | 21791.671 | 19914.581 |
| 5/23/16 | 21875.15 | 20033.24 |
| 5/24/16 | 21779.121 | 20191.518 |
| 5/25/16 | 21852.985 | 20428.954 |
| 5/26/16 | 21707.326 | 20523.246 |
| 5/27/16 | 21957.472 | 20420.712 |
| 5/30/16 | 22443.367 | 20538.164 |
| 5/31/16 | 22350.889 | 20476.054 |
| 6/1/16 | 22500.604 | 20427.495 |
| 6/2/16 | 22687.726 | 20735.599 |
| 6/3/16 | 23092.371 | 20806.959 |
| 6/6/16 | 23192.478 | 20855.662 |
| 6/7/16 | 23450.666 | 21082.613 |
| 6/8/16 | 23642.373 | 21237.64 |
| 6/9/16 | 24051.419 | 21400.074 |
| 6/10/16 | 24199.737 | 21367.969 |
| 6/14/16 | 23420.053 | 20884.374 |
| 6/15/16 | 23626.314 | 20705.088 |
| 6/16/16 | 23559.72 | 20670.827 |
| 6/17/16 | 23559.72 | 20916.537 |
| 6/20/16 | 23559.72 | 20601.019 |
| 6/21/16 | 23505.769 | 20753.945 |
| 6/22/16 | 23380.377 | 21009.332 |
| 6/23/16 | 23436.787 | 20906.908 |
| 6/24/16 | 23548.784 | 20317.069 |
| 6/27/16 | 24008.049 | 20521.412 |
| 6/28/16 | 24008.049 | 20379.765 |
| 6/29/16 | 24008.049 | 20639.471 |
| 6/30/16 | 24008.049 | 20572.019 |
| 7/1/16 | 23976.164 | 20957.162 |
| 7/4/16 | 24144.887 | 21359.387 |
| 7/5/16 | 23995.77 | 21176.089 |
| 7/6/16 | 23884.533 | 21299.764 |
| 7/7/16 | 23866.331 | 21475.005 |
| 7/8/16 | 23935.746 | 21574.13 |
| 7/11/16 | 24143.776 | 21634.792 |
| 7/12/16 | 24132.615 | 21579.779 |
| 7/13/16 | 24252.571 | 21626.143 |
| 7/14/16 | 24574.199 | 21570.06 |
| 7/15/16 | 24475.396 | 21591.68 |
| 7/18/16 | 24704.392 | 21663.55 |
| 7/19/16 | 24865.169 | 21909.869 |
| 7/20/16 | 25105.458 | 21952.86 |
| 7/21/16 | 24774.754 | 21903.96 |
| 7/22/16 | 24713.932 | 21858.198 |
| 7/25/16 | 24876.5 | 21909.159 |
| 7/26/16 | 24911.728 | 21947.403 |
| 7/27/16 | 25096.735 | 22100.669 |
| 7/28/16 | 25336.73 | 22472.921 |
| 7/29/16 | 25173.28 | 22615.636 |
| 8/1/16 | 25295.041 | 22880.623 |
| 8/2/16 | 25134.298 | 22487.532 |
| 8/3/16 | 24889.955 | 22195.551 |
| 8/4/16 | 25103.757 | 22206.596 |
| 8/5/16 | 24764.611 | 22259.598 |
| 8/8/16 | 25089.629 | 22444.108 |
| 8/9/16 | 24964.72 | 22481.646 |
| 8/10/16 | 25253.846 | 22674.968 |
| 8/11/16 | 25264.339 | 22374.017 |
| 8/12/16 | 25575.985 | 22471.505 |
| 8/15/16 | 25421.959 | 22564.748 |
| 8/16/16 | 25774.147 | 22203.969 |
| 8/17/16 | 25910.402 | 22083.999 |
| 8/18/16 | 25954.779 | 22152.256 |
| 8/19/16 | 25890.006 | 21901.69 |
| 8/22/16 | 25684.276 | 22104.988 |
| 8/23/16 | 25720.327 | 22264.789 |
| 8/24/16 | 25556.45 | 22107.878 |
| 8/25/16 | 25617.663 | 21976.736 |
| 8/26/16 | 25682.606 | 21841.393 |
| 8/29/16 | 25308.141 | 21909.322 |
| 8/30/16 | 25347.804 | 22111.111 |
| 8/31/16 | 25227.298 | 21935.343 |
| 9/1/16 | 25233.097 | 22129.423 |
| 9/2/16 | 25279.264 | 22269.241 |
| 9/5/16 | 25336.001 | 22422.273 |
| 9/6/16 | 25701.191 | 22514.356 |
| 9/7/16 | 26067.292 | 22611.409 |
| 9/8/16 | 26133.902 | 22579.753 |
| 9/9/16 | 25959.439 | 22324.516 |
| 9/12/16 | 25681.814 | 21798.2 |
| 9/13/16 | 25681.814 | 21985.845 |
| 9/14/16 | 25681.814 | 21905.342 |
| 9/15/16 | 25681.814 | 22155.116 |
| 9/16/16 | 25681.814 | 22221.393 |
| 9/19/16 | 25681.814 | 22146.278 |
| 9/20/16 | 25681.814 | 22292.073 |
| 9/21/16 | 25681.814 | 22252.661 |
| 9/22/16 | 25681.814 | 22353.873 |
| 9/23/16 | 25681.814 | 22250.414 |
| 9/26/16 | 25681.814 | 22088.5 |
| 9/27/16 | 25681.814 | 22175.103 |
| 9/28/16 | 25681.814 | 22615.698 |
| 9/29/16 | 25681.814 | 22884.915 |
| 9/30/16 | 25681.814 | 22613.541 |
| 10/3/16 | 25799.965 | 22919.679 |
| 10/4/16 | 25867.28 | 22958.864 |
| 10/5/16 | 25839.475 | 22776.419 |
| 10/6/16 | 25827.77 | 22736.732 |
| 10/7/16 | 25624.702 | 22642.06 |
| 10/10/16 | 25923.791 | 22695.813 |
| 10/11/16 | 25966.596 | 22842.296 |
| 10/12/16 | 25960.38 | 22853.865 |
| 10/13/16 | 26148.073 | 22961.155 |
| 10/14/16 | 25986.808 | 22799.536 |
| 10/17/16 | 25962.536 | 22547.291 |
| 10/18/16 | 26187.636 | 23169.067 |
| 10/19/16 | 26187.636 | 23493.591 |
| 10/20/16 | 26187.445 | 23624.765 |
| 10/21/16 | 26137.084 | 23507.851 |
| 10/24/16 | 26162.265 | 23516.819 |
| 10/25/16 | 26162.265 | 23265.996 |
| 10/26/16 | 26162.265 | 22953.434 |
| 10/27/16 | 26162.265 | 22496.665 |
| 10/28/16 | 26162.265 | 22229.036 |
| 10/31/16 | 26162.265 | 22016.962 |
| 11/1/16 | 26162.265 | 21736.027 |
| 11/2/16 | 26162.265 | 21339.028 |
| 11/3/16 | 26162.265 | 21203.198 |
| 11/4/16 | 26162.265 | 21190.177 |
| 11/7/16 | 26162.265 | 21369.154 |
| 11/8/16 | 26162.265 | 21315.178 |
| 11/9/16 | 26162.265 | 21168.725 |
| 11/10/16 | 26162.265 | 21320.355 |
| 11/11/16 | 26162.265 | 21315.223 |
| 11/14/16 | 26162.265 | 21308.451 |
| 11/15/16 | 26162.265 | 21221.489 |
| 11/16/16 | 26162.265 | 21170.666 |
| 11/17/16 | 26162.265 | 21199.415 |
| 11/18/16 | 26162.265 | 21136.884 |
| 11/21/16 | 26162.265 | 21201.474 |
| 11/22/16 | 26162.265 | 21172.724 |
| 11/23/16 | 26162.265 | 21151.063 |
| 11/24/16 | 26162.265 | 21028.183 |
| 11/25/16 | 26162.265 | 21021.097 |
| 11/28/16 | 26162.265 | 21021.097 |
| 11/29/16 | 26162.265 | 21028.185 |
| 11/30/16 | 26162.265 | 21035.276 |
| 12/1/16 | 26162.265 | 21028.185 |
| 12/2/16 | 26162.265 | 21028.185 |
| 12/5/16 | 26162.265 | 21028.185 |
| 12/6/16 | 26162.265 | 21028.185 |
| 12/7/16 | 26162.265 | 21042.362 |
| 12/8/16 | 26162.265 | 21042.362 |
| 12/9/16 | 26162.265 | 21049.451 |
| 12/12/16 | 26197.053 | 21077.403 |
| 12/13/16 | 26280.721 | 21144.682 |
| 12/14/16 | 26287.717 | 21150.309 |
| 12/15/16 | 26476.531 | 21302.223 |
| 12/16/16 | 26497.434 | 21319.041 |
| 12/19/16 | 26596.651 | 21398.834 |
| 12/20/16 | 26235.734 | 21108.449 |
| 12/21/16 | 26111.395 | 21008.37 |
| 12/22/16 | 26428.631 | 21263.609 |
| 12/23/16 | 26339.138 | 21191.604 |
| 12/28/16 | 26387.044 | 21230.15 |
| 12/29/16 | 26367.829 | 21214.69 |
| 12/30/16 | 26367.992 | 21214.819 |
| 1/3/17 | 26405.469 | 21244.974 |
| 1/4/17 | 26473.653 | 21299.835 |
| 1/5/17 | 26533.587 | 21348.056 |
| 1/6/17 | 26623.788 | 21420.63 |
| 1/9/17 | 26465.267 | 21293.09 |
| 1/10/17 | 26417.69 | 21254.807 |
| 1/11/17 | 26523.705 | 21340.105 |
| 1/12/17 | 26602.581 | 21403.564 |
| 1/13/17 | 26627.489 | 21423.604 |
| 1/16/17 | 26731.485 | 21507.276 |
| 1/17/17 | 26445.586 | 21277.251 |
| 1/18/17 | 26517.664 | 21335.245 |
| 1/19/17 | 26476.235 | 21301.913 |
| 1/20/17 | 26477.869 | 21303.227 |
| 1/23/17 | 26422.999 | 21259.08 |
| 1/24/17 | 26511.566 | 21330.339 |
| 1/25/17 | 26514.26 | 21332.506 |
| 1/27/17 | 26582.035 | 21387.036 |
| 1/30/17 | 26490.774 | 21313.612 |
| 1/31/17 | 26385.182 | 21228.618 |
| 2/1/17 | 26394.206 | 21235.88 |
| 2/2/17 | 26358.397 | 21207.031 |
| 2/3/17 | 26259.046 | 21127.061 |
| 2/6/17 | 26202.831 | 21108.546 |
| 2/7/17 | 26314.521 | 21139.632 |
| 2/8/17 | 26159.41 | 21030.865 |
| 2/9/17 | 26014.466 | 20919.59 |
| 2/10/17 | 26094.304 | 20946.422 |
| 2/13/17 | 26836.515 | 21559.609 |
| 2/14/17 | 27456.527 | 21994.333 |
| 2/15/17 | 27975.87 | 22342.805 |
| 2/16/17 | 27970.414 | 22397.191 |
| 2/17/17 | 28523.728 | 22821.009 |
| 2/20/17 | 28402.559 | 22776.855 |
| 2/21/17 | 28317.82 | 22746.092 |
| 2/22/17 | 27820.355 | 22233.769 |
| 2/23/17 | 28654.218 | 22635.277 |
| 2/24/17 | 28609.864 | 22587.809 |
| 2/27/17 | 28908.456 | 22838.19 |
| 2/28/17 | 28659.557 | 22654.027 |
| 3/1/17 | 28139.06 | 22488.494 |
| 3/2/17 | 28941.251 | 22839.967 |
| 3/3/17 | 28721.7 | 22649.055 |
| 3/6/17 | 28683.566 | 22535.132 |
| 3/7/17 | 28081.587 | 22287.485 |
| 3/8/17 | 28329.623 | 22335.681 |
| 3/9/17 | 27989.231 | 22325.836 |
| 3/10/17 | 27773.697 | 22124.687 |
| 3/13/17 | 27762.821 | 22201.594 |
| 3/14/17 | 27706.438 | 22096.674 |
| 3/15/17 | 27761.981 | 22225.045 |
| 3/16/17 | 27848.637 | 22326.3 |
| 3/17/17 | 27781.385 | 22296.505 |
| 3/20/17 | 27725.739 | 22236.073 |
| 3/21/17 | 27774.814 | 22333.127 |
| 3/22/17 | 27539.5 | 22072.64 |
| 3/23/17 | 27518.713 | 22070.98 |
| 3/24/17 | 27392.666 | 21952.008 |
| 3/27/17 | 27331.603 | 21896.707 |
| 3/28/17 | 27267.056 | 21857.041 |
| 3/29/17 | 27262.612 | 21847.623 |
| 3/30/17 | 27314.34 | 21949.782 |
| 3/31/17 | 27270.205 | 21976.745 |
| 4/3/17 | 27211.602 | 21953.518 |
| 4/4/17 | 27077.96 | 21881.339 |
| 4/5/17 | 27359.235 | 22055.497 |
| 4/6/17 | 27226.174 | 22011.08 |
| 4/7/17 | 27403.127 | 22166.243 |
| 4/10/17 | 27359.866 | 22244.804 |
| 4/11/17 | 27469.336 | 22390.456 |
| 4/12/17 | 27490.069 | 22440.116 |
| 4/13/17 | 27174.555 | 22243.265 |
| 4/18/17 | 27045.992 | 22131.597 |
| 4/19/17 | 27091.692 | 22225.422 |
| 4/20/17 | 26864.921 | 22029.829 |
| 4/21/17 | 26886.37 | 22029.265 |
| 4/24/17 | 26769.726 | 21995.04 |
| 4/26/17 | 26733.252 | 21919.092 |
| 4/27/17 | 26834.157 | 21858.939 |
| 4/28/17 | 26849.959 | 21864.229 |
| 5/1/17 | 27021.568 | 21867.5 |
| 5/2/17 | 26992.609 | 21776.612 |
| 5/3/17 | 27042.357 | 21735.82 |
| 5/4/17 | 27122.434 | 21768.711 |
| 5/5/17 | 27092.863 | 21750.464 |
| 5/8/17 | 27366.352 | 22026.055 |
| 5/9/17 | 27757.721 | 22125.864 |
| 5/10/17 | 27971.172 | 22299.152 |
| 5/11/17 | 28074.346 | 22268.537 |
| 5/12/17 | 27709.467 | 22032.128 |
| 5/15/17 | 27473.368 | 21828.088 |
| 5/16/17 | 27812.533 | 22026.995 |
| 5/17/17 | 27707.896 | 22043.907 |
| 5/18/17 | 27479.955 | 21928.157 |
| 5/19/17 | 27479.955 | 21884.636 |
| 5/22/17 | 27479.955 | 21940.391 |
| 5/23/17 | 27479.955 | 21955.001 |
| 5/24/17 | 27479.955 | 22228.194 |
| 5/25/17 | 27479.955 | 22301.005 |
| 5/26/17 | 27479.955 | 22297.47 |
| 5/29/17 | 27479.955 | 22169.558 |
| 5/30/17 | 27479.955 | 21839.62 |
| 5/31/17 | 27479.955 | 21798.144 |
| 6/1/17 | 27479.955 | 21695.837 |
| 6/2/17 | 27479.955 | 21873.467 |
| 6/5/17 | 27479.955 | 21969.43 |
| 6/6/17 | 27479.955 | 21759.242 |
| 6/7/17 | 27479.955 | 21791.237 |
| 6/8/17 | 27479.955 | 21719.779 |
| 6/9/17 | 27479.955 | 21701.011 |
| 6/13/17 | 27479.955 | 21651.576 |
| 6/14/17 | 27479.955 | 21562.697 |
| 6/15/17 | 27479.765 | 21455.86 |
| 6/16/17 | 27479.765 | 21363.619 |
| 6/19/17 | 27479.765 | 21245.824 |
| 6/20/17 | 27479.765 | 21201.714 |
| 6/21/17 | 27479.765 | 21025.279 |
| 6/22/17 | 27479.765 | 20918.179 |
| 6/23/17 | 27479.765 | 20968.025 |
| 6/26/17 | 27479.765 | 21014.863 |
| 6/27/17 | 27479.765 | 21022.649 |
| 6/28/17 | 27479.765 | 21163.156 |
| 6/29/17 | 27479.765 | 21404.001 |
| 6/30/17 | 27479.765 | 21298.574 |
| 7/3/17 | 27479.765 | 21321.188 |
| 7/4/17 | 27479.765 | 21365.814 |
| 7/5/17 | 27479.765 | 21200.261 |
| 7/6/17 | 27479.765 | 21176.434 |
| 7/7/17 | 27479.765 | 21055.857 |
| 7/10/17 | 27479.765 | 21062.74 |
| 7/11/17 | 27479.765 | 21088.875 |
| 7/12/17 | 27479.765 | 21021.642 |
| 7/13/17 | 27479.765 | 21026.611 |
| 7/14/17 | 27479.765 | 21075.628 |
| 7/17/17 | 27479.765 | 20923.955 |
| 7/18/17 | 27479.765 | 21040.659 |
| 7/19/17 | 27479.765 | 21066.352 |
| 7/20/17 | 27479.765 | 21100.148 |
| 7/21/17 | 27479.765 | 21141.313 |
| 7/24/17 | 27479.765 | 21173.534 |
| 7/25/17 | 27479.765 | 20979.35 |
| 7/26/17 | 27479.765 | 20998.995 |
| 7/27/17 | 27479.765 | 21041.289 |
| 7/28/17 | 27479.765 | 21021.314 |
| 7/31/17 | 27479.765 | 21115.441 |
| 8/1/17 | 27479.765 | 21091.543 |
| 8/2/17 | 27479.765 | 21086.148 |
| 8/3/17 | 27479.765 | 21104.377 |
| 8/4/17 | 27479.765 | 21135.172 |
| 8/7/17 | 27479.765 | 21100.656 |
| 8/8/17 | 27479.765 | 21135.171 |
| 8/9/17 | 27479.765 | 21129.946 |
| 8/10/17 | 27479.575 | 21175.382 |
| 8/11/17 | 27479.224 | 21108.359 |
| 8/14/17 | 27536.435 | 21144.896 |
| 8/15/17 | 27536.435 | 21120.26 |
| 8/16/17 | 27536.435 | 21103.993 |
| 8/17/17 | 27521.676 | 21205.9 |
| 8/18/17 | 27536.246 | 21285.28 |
| 8/21/17 | 27543.532 | 21343.7 |
| 8/22/17 | 27543.532 | 21376.317 |
| 8/23/17 | 27575.821 | 21443.061 |
| 8/24/17 | 27579.07 | 21524.156 |
| 8/25/17 | 27606.276 | 21598.511 |
| 8/28/17 | 27651.747 | 21470.994 |
| 8/29/17 | 27639.704 | 21535.273 |
| 8/30/17 | 27639.704 | 21744.428 |
| 8/31/17 | 27639.704 | 21854.825 |
| 9/1/17 | 27639.704 | 21855.275 |
| 9/4/17 | 27585.32 | 21744.65 |
| 9/5/17 | 27585.32 | 21740.24 |
| 9/6/17 | 27585.32 | 21647.738 |
| 9/7/17 | 27585.32 | 21647.365 |
| 9/8/17 | 27585.32 | 21631.857 |
| 9/11/17 | 27585.32 | 21678.039 |
| 9/12/17 | 27585.32 | 21842.556 |
| 9/13/17 | 27631.173 | 22268.093 |
| 9/14/17 | 27576.883 | 22356.016 |
| 9/15/17 | 27475.304 | 22436.835 |
| 9/18/17 | 27404.195 | 22451.556 |
| 9/19/17 | 27404.195 | 22426.801 |
| 9/20/17 | 27404.195 | 22503.824 |
| 9/21/17 | 27404.195 | 22589.736 |
| 9/22/17 | 27404.195 | 22440.091 |
| 9/25/17 | 27404.195 | 22460.123 |
| 9/26/17 | 27404.195 | 22309.46 |
| 9/27/17 | 27404.195 | 22318.065 |
| 9/28/17 | 27404.195 | 22280.653 |
| 9/29/17 | 27404.195 | 22462.096 |
| 10/2/17 | 27404.195 | 22785.009 |
| 10/3/17 | 27404.195 | 22676.197 |
| 10/4/17 | 27404.195 | 22594.81 |
| 10/5/17 | 27404.195 | 22578.207 |
| 10/6/17 | 27404.195 | 22760.074 |
| 10/9/17 | 27448.036 | 22890.221 |
| 10/10/17 | 27585.707 | 23191.55 |
| 10/11/17 | 27590.168 | 23110.888 |
| 10/12/17 | 27759.607 | 23413.957 |
| 10/13/17 | 28037.145 | 23402.28 |
| 10/16/17 | 28134.414 | 23567.753 |
| 10/17/17 | 28179.165 | 23580.885 |
| 10/18/17 | 28346.546 | 23542.526 |
| 10/19/17 | 27992.203 | 23288.479 |
| 10/20/17 | 27927.664 | 23218.513 |
| 10/23/17 | 27887.074 | 23286.734 |
| 10/24/17 | 27899.292 | 22959.059 |
| 10/25/17 | 28156.833 | 23246.224 |
| 10/26/17 | 28362.859 | 23400.049 |
| 10/27/17 | 28173.625 | 23098.088 |
| 10/30/17 | 28046.821 | 22836.758 |
| 10/31/17 | 28112.742 | 23036.128 |
| 11/1/17 | 28092.838 | 23312.992 |
| 11/2/17 | 28219.442 | 23294.922 |
| 11/3/17 | 28135.099 | 23554.234 |
| 11/6/17 | 28231.583 | 23453.42 |
| 11/7/17 | 28232.724 | 23561.327 |
| 11/8/17 | 28464.39 | 23758.276 |
| 11/9/17 | 28778.543 | 23908.107 |
| 11/10/17 | 28787.565 | 23827.128 |
| 11/13/17 | 28948.824 | 23505.726 |
| 11/14/17 | 28721.017 | 23259.213 |
| 11/15/17 | 28625.391 | 23440.304 |
| 11/16/17 | 28208.058 | 23373.846 |
| 11/17/17 | 28240.543 | 23196.768 |
| 11/20/17 | 28671.491 | 23323.993 |
| 11/21/17 | 28596.598 | 23455.251 |
| 11/22/17 | 28189.216 | 23223.781 |
| 11/23/17 | 28486.074 | 23364.545 |
| 11/24/17 | 28135.795 | 23001.859 |
| 11/27/17 | 28066.837 | 22928.454 |
| 11/28/17 | 28255.735 | 23158.602 |
| 11/29/17 | 28487.701 | 23351.199 |
| 11/30/17 | 28325.332 | 23152.991 |
| 12/1/17 | 28184.354 | 22949.389 |
| 12/4/17 | 28116.258 | 22736.416 |
| 12/5/17 | 27895.509 | 22775.711 |
| 12/6/17 | 27870.534 | 22769.168 |
| 12/7/17 | 28122.475 | 22823.657 |
| 12/8/17 | 28256.591 | 23049.974 |
| 12/11/17 | 28307.193 | 22898.015 |
| 12/12/17 | 28425.917 | 22844.239 |
| 12/13/17 | 28462.248 | 22902.025 |
| 12/14/17 | 28481.816 | 23067.474 |
| 12/15/17 | 28652.276 | 22980.724 |
| 12/18/17 | 28861.392 | 23127.714 |
| 12/19/17 | 29026.329 | 23405.88 |
| 12/20/17 | 29156.405 | 23492.245 |
| 12/21/17 | 29384.694 | 23334.286 |
| 12/22/17 | 29529.822 | 23400.774 |
| 12/27/17 | 29593.99 | 23265.63 |
| 12/28/17 | 29925.431 | 23594.667 |
| 12/29/17 | 30003.62 | 23368.762 |
| 1/2/18 | 30019.444 | 23400.646 |
| 1/3/18 | 30075.295 | 23503.242 |
| 1/4/18 | 30396.749 | 23632.719 |
| 1/5/18 | 30260.748 | 23676.43 |
| 1/8/18 | 30269.502 | 23834.34 |
| 1/9/18 | 30291.227 | 23772.161 |
| 1/10/18 | 30488.026 | 23849.782 |
| 1/11/18 | 30326.689 | 23732.233 |
| 1/12/18 | 30596.9 | 23972.983 |
| 1/15/18 | 30881.714 | 24038.839 |
| 1/16/18 | 31090.394 | 23966.109 |
| 1/17/18 | 31056.926 | 24022.348 |
| 1/18/18 | 31111.132 | 24029.966 |
| 1/19/18 | 31168.097 | 24083.846 |
| 1/22/18 | 30955.543 | 24111.53 |
| 1/23/18 | 31437.323 | 24360.026 |
| 1/24/18 | 31711.035 | 24373.614 |
| 1/25/18 | 31555.245 | 24334.482 |
| 1/29/18 | 31725.012 | 24405.249 |
| 1/30/18 | 31620.053 | 24263.699 |
| 1/31/18 | 31179.731 | 24094.357 |
| 2/1/18 | 31238.327 | 24166.93 |
| 2/2/18 | 31185.484 | 24308.584 |
| 2/5/18 | 29858.929 | 23589.808 |
| 2/6/18 | 28218.288 | 22539.673 |
| 2/7/18 | 29207.57 | 23045.993 |
| 2/8/18 | 29207.57 | 22994.902 |
| 2/9/18 | 29207.57 | 22742.135 |
| 2/12/18 | 29207.57 | 22551.315 |
| 2/13/18 | 29207.57 | 22897.437 |
| 2/14/18 | 29207.57 | 22799.601 |
| 2/15/18 | 29207.57 | 22869.801 |
| 2/16/18 | 29207.57 | 23014.084 |
| 2/19/18 | 29207.57 | 22917.851 |
| 2/20/18 | 29207.57 | 22775.283 |
| 2/21/18 | 29207.57 | 22987.8 |
| 2/22/18 | 29207.57 | 22869.065 |
| 2/23/18 | 29207.57 | 23145.509 |
| 2/26/18 | 29180.086 | 23298.693 |
| 2/27/18 | 29166.436 | 23454.512 |
| 2/28/18 | 29146.915 | 23678.819 |
| 3/1/18 | 29094.039 | 23419.477 |
| 3/2/18 | 29051.489 | 23197.149 |
| 3/5/18 | 29051.489 | 23116.119 |
| 3/6/18 | 29051.489 | 23368.281 |
| 3/7/18 | 29051.489 | 23392.357 |
| 3/8/18 | 29051.489 | 23773.241 |
| 3/9/18 | 29051.489 | 23958.806 |
| 3/12/18 | 29051.489 | 24310.614 |
| 3/13/18 | 29007.058 | 24007.779 |
| 3/14/18 | 29014.431 | 24163.503 |
| 3/15/18 | 29014.431 | 24187.843 |
| 3/16/18 | 29014.431 | 24303.178 |
| 3/19/18 | 29014.431 | 24405.75 |
| 3/20/18 | 29014.431 | 24489.925 |
| 3/21/18 | 29014.431 | 24398.049 |
| 3/22/18 | 29014.431 | 24477.931 |
| 3/23/18 | 29014.431 | 24215.101 |
| 3/26/18 | 29014.431 | 24390.883 |
| 3/27/18 | 29014.431 | 24706.948 |
| 3/28/18 | 29014.431 | 24603.801 |
| 3/29/18 | 29014.431 | 24213.642 |
| 4/3/18 | 29014.431 | 24035.083 |
| 4/4/18 | 29014.431 | 24079.98 |
| 4/5/18 | 29014.431 | 24082.812 |
| 4/6/18 | 29014.431 | 24142.309 |
| 4/9/18 | 29014.431 | 24244.745 |
| 4/10/18 | 29014.431 | 24382.455 |
| 4/11/18 | 29014.431 | 24457.26 |
| 4/12/18 | 29014.431 | 24392.852 |
| 4/13/18 | 29014.431 | 24307.716 |
| 4/16/18 | 29014.431 | 24304.084 |
| 4/17/18 | 29014.431 | 24184.088 |
| 4/18/18 | 29014.431 | 24229.733 |
| 4/19/18 | 29014.431 | 24282.527 |
| 4/20/18 | 29014.431 | 24220.867 |
| 4/23/18 | 29014.431 | 24017.871 |
| 4/24/18 | 29014.431 | 23896.905 |
| 4/26/18 | 29014.431 | 23945.378 |
| 4/27/18 | 29014.431 | 23962.504 |
| 4/30/18 | 29014.431 | 24051.968 |
| 5/1/18 | 29014.431 | 24180.364 |
| 5/2/18 | 29014.431 | 24180.567 |
| 5/3/18 | 29014.431 | 24238.535 |
| 5/4/18 | 29014.431 | 24335.548 |
| 5/7/18 | 29014.431 | 24552.879 |
| 5/8/18 | 29014.431 | 24646.143 |
| 5/9/18 | 29014.431 | 24537.929 |
| 5/10/18 | 28966.677 | 24559.945 |
| 5/11/18 | 28978.567 | 24614.023 |
| 5/14/18 | 28891.504 | 24624.516 |
| 5/15/18 | 28768.715 | 24568.414 |
| 5/16/18 | 28867.237 | 24823.562 |
| 5/17/18 | 28922.021 | 25142.793 |
| 5/18/18 | 29001.765 | 25147.653 |
| 5/21/18 | 28920.02 | 25035.547 |
| 5/22/18 | 29028.948 | 25026.998 |
| 5/23/18 | 29021.635 | 25114.284 |
| 5/24/18 | 29176.744 | 25215.854 |
| 5/25/18 | 29376.051 | 25416.978 |
| 5/28/18 | 28887.759 | 25409.348 |
| 5/29/18 | 28695.13 | 25585.933 |
| 5/30/18 | 28720.298 | 25773.025 |
| 5/31/18 | 29104.556 | 26043.018 |
| 6/1/18 | 29105.964 | 25995.028 |
| 6/4/18 | 29523.585 | 26103.415 |
| 6/5/18 | 29170.793 | 25887.782 |
| 6/6/18 | 29113.843 | 26247.879 |
| 6/7/18 | 29273.634 | 26398.082 |
| 6/8/18 | 29110.326 | 26216.426 |
| 6/12/18 | 29041.852 | 26153.242 |
| 6/13/18 | 28375.821 | 25704.808 |
| 6/14/18 | 28635.057 | 25847.475 |
| 6/15/18 | 28670.727 | 26153.331 |
| 6/18/18 | 28706.566 | 25907.853 |
| 6/19/18 | 28373.354 | 25661.355 |
| 6/20/18 | 28640.061 | 26146.565 |
| 6/21/18 | 28976.358 | 26579.275 |
| 6/22/18 | 27918.637 | 25855.2 |
| 6/25/18 | 28475.494 | 25959.797 |
| 6/26/18 | 28487.465 | 26238.377 |
| 6/27/18 | 28346.367 | 26406.4 |
| 6/28/18 | 28240.623 | 26015.59 |
| 6/29/18 | 28244.509 | 25937.752 |
| 7/2/18 | 28243.179 | 26159.123 |
| 7/3/18 | 28061.985 | 26280.993 |
| 7/4/18 | 27842.608 | 25846.844 |
| 7/5/18 | 27777.383 | 25932.392 |
| 7/6/18 | 27642.249 | 25757.501 |
| 7/9/18 | 27647.253 | 25624.116 |
| 7/10/18 | 27744.684 | 25673.506 |
| 7/11/18 | 27619.669 | 25870.515 |
| 7/12/18 | 27600.888 | 25863.356 |
| 7/13/18 | 27851.81 | 26022.773 |
| 7/16/18 | 28307.001 | 25550.925 |
| 7/17/18 | 28071.184 | 25671.549 |
| 7/18/18 | 28118.953 | 25902.354 |
| 7/19/18 | 27857.449 | 25974.303 |
| 7/20/18 | 28328.675 | 26432.188 |
| 7/23/18 | 28190.992 | 26325.968 |
| 7/24/18 | 28228.745 | 26441.036 |
| 7/25/18 | 28850.683 | 26736.85 |
| 7/26/18 | 28880.224 | 26492.331 |
| 7/27/18 | 28834.33 | 26564.414 |
| 7/30/18 | 29055.233 | 26499.78 |
| 7/31/18 | 29310.175 | 26335.227 |
| 8/1/18 | 29319.915 | 26261.036 |
| 8/2/18 | 29231.334 | 26094.722 |
| 8/3/18 | 29205.844 | 26082.144 |
| 8/6/18 | 29715.646 | 26167.42 |
| 8/7/18 | 29525.624 | 25961.49 |
| 8/8/18 | 29504.717 | 26160.251 |
| 8/9/18 | 29435.029 | 25863.971 |
| 8/10/18 | 29769.176 | 26130.465 |
| 8/13/18 | 29167.487 | 26220.357 |
| 8/14/18 | 29221.185 | 26140.348 |
| 8/15/18 | 29207.357 | 26357.028 |
| 8/16/18 | 28995.367 | 26116.53 |
| 8/17/18 | 29294.031 | 25994.955 |
| 8/20/18 | 29477.336 | 26180.598 |
| 8/21/18 | 29985.811 | 26710.918 |
| 8/22/18 | 29831.51 | 26591.656 |
| 8/23/18 | 29679.199 | 26397.242 |
| 8/24/18 | 29893.15 | 26425.886 |
| 8/27/18 | 30328.628 | 26700.4 |
| 8/28/18 | 30877.291 | 26441.123 |
| 8/29/18 | 30695.705 | 26435.669 |
| 8/30/18 | 31117.034 | 26789.97 |
| 8/31/18 | 31651.074 | 26644.053 |
| 9/3/18 | 31391.402 | 26724.787 |
| 9/4/18 | 31674.914 | 26631.2 |
| 9/5/18 | 31033.497 | 26203.553 |
| 9/6/18 | 30752.029 | 25944.929 |
| 9/7/18 | 30821.116 | 25928.95 |
| 9/10/18 | 30821.116 | 25902.803 |
| 9/11/18 | 30821.116 | 26056.099 |
| 9/12/18 | 30821.116 | 25992.866 |
| 9/13/18 | 30821.116 | 25919.969 |
| 9/14/18 | 30821.116 | 25908.763 |
| 9/17/18 | 30821.116 | 26063.739 |
| 9/18/18 | 30821.116 | 25855.196 |
| 9/19/18 | 30821.116 | 26098.816 |
| 9/20/18 | 30821.116 | 26086.02 |
| 9/21/18 | 30821.116 | 26125.744 |
| 9/24/18 | 30821.116 | 26049.321 |
| 9/25/18 | 30821.116 | 25995.729 |
| 9/26/18 | 30821.116 | 26191.173 |
| 9/27/18 | 30821.116 | 26248.369 |
| 9/28/18 | 30821.116 | 26270.077 |
| 10/1/18 | 30911.157 | 26561.591 |
| 10/2/18 | 30926.192 | 26144.212 |
| 10/3/18 | 30926.192 | 26173.193 |
| 10/4/18 | 30926.192 | 26281.765 |
| 10/5/18 | 30926.192 | 26101.69 |
| 10/8/18 | 30926.192 | 25920.022 |
| 10/9/18 | 30926.192 | 25528.145 |
| 10/10/18 | 30926.192 | 25367.338 |
| 10/11/18 | 30926.192 | 24855.456 |
| 10/12/18 | 30926.192 | 25080.972 |
| 10/15/18 | 30926.192 | 25024.923 |
| 10/16/18 | 30926.192 | 25040.041 |
| 10/17/18 | 30926.192 | 25080.285 |
| 10/18/18 | 30926.192 | 25191.343 |
| 10/19/18 | 30926.192 | 25068.07 |
| 10/22/18 | 30926.192 | 24842.587 |
| 10/23/18 | 30926.192 | 24718.186 |
| 10/24/18 | 30926.192 | 24758.958 |
| 10/25/18 | 30926.192 | 24572.848 |
| 10/26/18 | 30926.192 | 24519.085 |
| 10/29/18 | 30926.192 | 24395.271 |
| 10/30/18 | 30926.192 | 24453.361 |
| 10/31/18 | 30926.192 | 24509.381 |
| 11/1/18 | 30926.192 | 24547.236 |
| 11/2/18 | 30926.192 | 24673.048 |
| 11/5/18 | 30926.192 | 24667.679 |
| 11/6/18 | 30926.192 | 24783.271 |
| 11/7/18 | 30926.192 | 24787.393 |
| 11/8/18 | 30926.192 | 24880.983 |
| 11/9/18 | 30926.192 | 24872.57 |
| 11/12/18 | 30926.192 | 24835.115 |
| 11/13/18 | 30926.192 | 24806.661 |
| 11/14/18 | 30926.192 | 24810.568 |
| 11/15/18 | 30926.192 | 24836.386 |
| 11/16/18 | 30926.192 | 24813.795 |
| 11/19/18 | 30926.192 | 24865.432 |
| 11/20/18 | 30926.192 | 24810.567 |
| 11/21/18 | 30926.192 | 24536.251 |
| 11/22/18 | 30926.192 | 24526.569 |
| 11/23/18 | 30926.192 | 24510.431 |
| 11/26/18 | 30926.192 | 24365.204 |
| 11/27/18 | 30926.192 | 24365.204 |
| 11/28/18 | 30926.192 | 24365.204 |
| 11/29/18 | 30926.192 | 24365.204 |
| 11/30/18 | 30926.192 | 24365.204 |
| 12/3/18 | 30926.192 | 24365.204 |
| 12/4/18 | 30926.192 | 24365.204 |
| 12/5/18 | 30926.192 | 24365.204 |
| 12/6/18 | 30926.192 | 24365.204 |
| 12/7/18 | 30926.192 | 24365.204 |
| 12/10/18 | 30926.192 | 24365.204 |
| 12/11/18 | 30926.192 | 24365.204 |
| 12/12/18 | 30926.192 | 24365.204 |
| 12/13/18 | 30926.192 | 24365.204 |
| 12/14/18 | 30926.192 | 24365.204 |
| 12/17/18 | 30926.192 | 24365.204 |
| 12/18/18 | 30926.192 | 24365.204 |
| 12/19/18 | 30926.192 | 24365.204 |
| 12/20/18 | 30926.192 | 24365.204 |
| 12/21/18 | 30926.192 | 24365.204 |
| 12/24/18 | 30926.192 | 24365.204 |
| 12/27/18 | 30926.192 | 24365.204 |
| 12/28/18 | 30926.192 | 24365.204 |
| 12/31/18 | 30926.192 | 24365.204 |
| 1/2/19 | 30926.192 | 24365.204 |
| 1/3/19 | 30926.192 | 24365.204 |
| 1/4/19 | 30926.192 | 24365.204 |
| 1/7/19 | 30926.192 | 24365.204 |
| 1/8/19 | 30926.192 | 24365.204 |
| 1/9/19 | 30926.192 | 24365.204 |
| 1/10/19 | 30926.192 | 24365.204 |
| 1/11/19 | 30926.192 | 24365.204 |
| 1/14/19 | 30926.192 | 24365.204 |
| 1/15/19 | 30926.192 | 24365.204 |
| 1/16/19 | 30926.192 | 24365.204 |
| 1/17/19 | 30981.229 | 24408.523 |
| 1/18/19 | 31102.722 | 24504.243 |
| 1/21/19 | 31091.677 | 24495.542 |
| 1/22/19 | 31113.768 | 24512.944 |
| 1/23/19 | 31157.949 | 24547.754 |
| 1/24/19 | 31080.634 | 24486.839 |
| 1/25/19 | 31102.723 | 24504.244 |
| 1/29/19 | 31124.812 | 24521.647 |
| 1/30/19 | 31168.991 | 24556.456 |
| 1/31/19 | 31131.098 | 24526.563 |
| 2/1/19 | 31254.113 | 24623.48 |
| 2/4/19 | 31241.549 | 24613.579 |
| 2/5/19 | 31335.998 | 24687.991 |
| 2/6/19 | 31290.295 | 24651.986 |
| 2/7/19 | 31428.926 | 24761.206 |
| 2/8/19 | 31639.918 | 24927.436 |
| 2/11/19 | 31589.649 | 24887.831 |
| 2/12/19 | 31417.883 | 24752.503 |
| 2/13/19 | 31506.24 | 24822.117 |
| 2/14/19 | 31473.108 | 24796.012 |
| 2/15/19 | 31490.349 | 24809.558 |
| 2/18/19 | 31719.45 | 24990.053 |
| 2/19/19 | 31900.324 | 25132.553 |
| 2/20/19 | 31855.31 | 25097.086 |
| 2/21/19 | 31856.026 | 25097.651 |
| 2/22/19 | 31971.332 | 25188.494 |
| 2/25/19 | 32073.596 | 25269.062 |
| 2/26/19 | 32063.528 | 25261.09 |
| 2/27/19 | 32156.708 | 25334.499 |
| 2/28/19 | 32004.774 | 25214.76 |
| 3/1/19 | 32081.284 | 25275.039 |
| 3/4/19 | 32345.788 | 25483.431 |
| 3/5/19 | 32249.34 | 25407.407 |
| 3/6/19 | 32690.001 | 25754.578 |
| 3/7/19 | 32560.444 | 25652.505 |
| 3/8/19 | 32578.215 | 25666.509 |
| 3/11/19 | 32866.523 | 25893.65 |
| 3/12/19 | 32445.569 | 25562.004 |
| 3/13/19 | 32743.753 | 25796.929 |
| 3/14/19 | 33007.776 | 26004.935 |
| 3/15/19 | 32861.528 | 25889.715 |
| 3/18/19 | 33189.927 | 26148.441 |
| 3/19/19 | 33337.555 | 26264.752 |
| 3/20/19 | 33441.669 | 26346.779 |
| 3/21/19 | 33238.858 | 26186.955 |
| 3/22/19 | 33480.259 | 26377.098 |
| 3/25/19 | 33019.584 | 26014.16 |
| 3/26/19 | 32609.903 | 25691.355 |
| 3/27/19 | 32715.722 | 25774.724 |
| 3/28/19 | 33060.006 | 26045.972 |
| 3/29/19 | 32943.106 | 25953.832 |
| 4/1/19 | 33367.482 | 26288.177 |
| 4/2/19 | 33814.206 | 26640.125 |
| 4/3/19 | 34275.902 | 27003.867 |
| 4/4/19 | 34315.583 | 27035.127 |
| 4/5/19 | 34116.817 | 26878.528 |
| 4/8/19 | 34914.779 | 27507.196 |
| 4/9/19 | 35245.331 | 27767.62 |
| 4/10/19 | 35801.523 | 28205.815 |
| 4/11/19 | 36074.983 | 28421.257 |
| 4/12/19 | 36079.409 | 28424.744 |
| 4/15/19 | 36685.291 | 28902.087 |
| 4/16/19 | 36836.045 | 29020.86 |
| 4/17/19 | 35638.476 | 28077.357 |
| 4/18/19 | 35156.394 | 27697.554 |
| 4/23/19 | 35571.271 | 28024.41 |
| 4/24/19 | 36160.541 | 28488.663 |
| 4/26/19 | 36371.18 | 28654.612 |
| 4/29/19 | 36518.498 | 28770.675 |
| 4/30/19 | 37020.478 | 29213.898 |
| 5/1/19 | 37267.474 | 29396.202 |
| 5/2/19 | 36545.115 | 28817.685 |
| 5/3/19 | 36455.466 | 28550.706 |
| 5/6/19 | 35887.217 | 28218.01 |
| 5/7/19 | 36398.459 | 28601.287 |
| 5/8/19 | 36387.82 | 28600.976 |
| 5/9/19 | 36629.861 | 28832.011 |
| 5/10/19 | 36376.979 | 28573.599 |
| 5/13/19 | 36650.668 | 28937.163 |
| 5/14/19 | 36420.029 | 28686.869 |
| 5/15/19 | 36318.698 | 28687.058 |
| 5/16/19 | 37129.607 | 29142.347 |
| 5/17/19 | 37656.926 | 29542.32 |
| 5/20/19 | 37459.562 | 29546.87 |
| 5/21/19 | 37697.179 | 29685.663 |
| 5/22/19 | 38213.593 | 30042.072 |
| 5/23/19 | 37935.837 | 29876.363 |
| 5/24/19 | 37406.731 | 29547.598 |
| 5/27/19 | 37337.652 | 29673.391 |
| 5/28/19 | 37498.301 | 29865.182 |
| 5/29/19 | 37151.978 | 29712.03 |
| 5/30/19 | 37119.128 | 29590.662 |
| 5/31/19 | 36672.659 | 29261.783 |
| 6/3/19 | 35347.79 | 28226.059 |
| 6/4/19 | 35017.967 | 27957.474 |
| 6/5/19 | 35412.924 | 28305.617 |
| 6/6/19 | 35028.301 | 28098.083 |
| 6/7/19 | 35205.743 | 28125.577 |
| 6/11/19 | 35415.693 | 28323.23 |
| 6/12/19 | 35939.094 | 28755.442 |
| 6/13/19 | 35523.027 | 28396.882 |
| 6/14/19 | 35820.899 | 28652.752 |
| 6/17/19 | 35631.524 | 27952.45 |
| 6/18/19 | 35580.418 | 27924.928 |
| 6/19/19 | 37345.338 | 28818.33 |
| 6/20/19 | 37266.895 | 28567.323 |
| 6/21/19 | 37120.234 | 28123.187 |
| 6/24/19 | 36741.181 | 28063.141 |
| 6/25/19 | 36545.556 | 27907.5 |
| 6/26/19 | 36875.873 | 27956.921 |
| 6/27/19 | 36751.484 | 27914.58 |
| 6/28/19 | 36123.427 | 27831.99 |
| 7/1/19 | 36263.38 | 27938.388 |
| 7/2/19 | 36630.05 | 27962.111 |
| 7/3/19 | 36529.013 | 28170.75 |
| 7/4/19 | 36423.63 | 28266.305 |
| 7/5/19 | 36190.701 | 28345.742 |
| 7/8/19 | 36139.166 | 28443.056 |
| 7/9/19 | 36269.147 | 28186.483 |
| 7/10/19 | 36422.707 | 28159.187 |
| 7/11/19 | 37390.062 | 28818.131 |
| 7/12/19 | 37375.053 | 29052.798 |
| 7/15/19 | 37281.552 | 29019.134 |
| 7/16/19 | 37105.643 | 28807.541 |
| 7/17/19 | 37175.824 | 28964.626 |
| 7/18/19 | 37295.583 | 28962.048 |
| 7/19/19 | 38099.034 | 29590.437 |
| 7/22/19 | 38105.911 | 29592.772 |
| 7/23/19 | 38112.69 | 29546.936 |
| 7/24/19 | 37729.486 | 29196.574 |
| 7/25/19 | 38166.156 | 29166.321 |
| 7/26/19 | 38208.612 | 29184.144 |
| 7/29/19 | 38487.802 | 29283.432 |
| 7/30/19 | 38198.327 | 29389.584 |
| 7/31/19 | 38141.309 | 29446.432 |
| 8/1/19 | 38092.599 | 29378.956 |
| 8/2/19 | 38027.262 | 29268.764 |
| 8/5/19 | 36635.255 | 28107.081 |
| 8/6/19 | 35540.117 | 27330.544 |
| 8/7/19 | 35548.807 | 27377.29 |
| 8/8/19 | 35548.807 | 27792.316 |
| 8/9/19 | 35298.711 | 27653.975 |
| 8/12/19 | 35047.423 | 27815.446 |
| 8/13/19 | 34917.856 | 27400.348 |
| 8/14/19 | 34991.358 | 27675.338 |
| 8/15/19 | 35008.979 | 27433.151 |
| 8/16/19 | 34864.984 | 27350.827 |
| 8/19/19 | 34864.984 | 27654.571 |
| 8/20/19 | 34864.984 | 28373.72 |
| 8/21/19 | 34864.984 | 28843.416 |
| 8/22/19 | 34864.984 | 28135.29 |
| 8/23/19 | 34864.984 | 27862.828 |
| 8/26/19 | 34864.984 | 27452.383 |
| 8/27/19 | 34864.984 | 28137.968 |
| 8/28/19 | 34864.984 | 28859.983 |
| 8/29/19 | 34864.984 | 28643.29 |
| 8/30/19 | 34864.984 | 29253.925 |
| 9/2/19 | 34811.595 | 30029.049 |
| 9/3/19 | 34776.526 | 29857.52 |
| 9/4/19 | 34739.774 | 29874.431 |
| 9/5/19 | 34778.784 | 30057.397 |
| 9/6/19 | 34778.784 | 30063.4 |
| 9/9/19 | 34941.52 | 30394.232 |
| 9/10/19 | 34780.947 | 29836.863 |
| 9/11/19 | 34777.093 | 29715.135 |
| 9/12/19 | 34907.58 | 29575.72 |
| 9/13/19 | 35248.739 | 29437.468 |
| 9/16/19 | 35145.495 | 29078.961 |
| 9/17/19 | 35329.788 | 29415.489 |
| 9/18/19 | 35157.368 | 29550.006 |
| 9/19/19 | 34650.708 | 29280.989 |
| 9/20/19 | 34554.594 | 29645.394 |
| 9/23/19 | 34991.74 | 30096.431 |
| 9/24/19 | 35251.992 | 30141.891 |
| 9/25/19 | 35636.929 | 30212.272 |
| 9/26/19 | 35827.815 | 30386.437 |
| 9/27/19 | 36180.762 | 30621.373 |
| 9/30/19 | 36460.316 | 30494.16 |
| 10/1/19 | 36613.887 | 30894.673 |
| 10/2/19 | 36342.563 | 30665.558 |
| 10/3/19 | 35910.861 | 30404.76 |
| 10/4/19 | 36064.48 | 30804.166 |
| 10/7/19 | 36064.48 | 31133.053 |
| 10/8/19 | 36064.48 | 31118.171 |
| 10/9/19 | 36064.48 | 31074.783 |
| 10/10/19 | 36064.48 | 31051.53 |
| 10/11/19 | 36064.48 | 31413.799 |
| 10/14/19 | 36064.48 | 31324.15 |
| 10/15/19 | 36064.289 | 31394.162 |
| 10/16/19 | 36004.181 | 31768.192 |
| 10/17/19 | 36064.29 | 31966.064 |
| 10/18/19 | 36064.29 | 32137.162 |
| 10/21/19 | 36064.29 | 32201.44 |
| 10/22/19 | 36064.29 | 32529.27 |
| 10/23/19 | 36044.256 | 31820.62 |
| 10/24/19 | 36057.427 | 32093.92 |
| 10/25/19 | 36398.068 | 32579.258 |
| 10/28/19 | 36344.673 | 32585.353 |
| 10/29/19 | 37239.631 | 33419.512 |
| 10/30/19 | 37319.503 | 33156.166 |
| 10/31/19 | 37518.356 | 33467.397 |
| 11/1/19 | 37471.109 | 33348.772 |
| 11/4/19 | 37624.486 | 33457.098 |
| 11/5/19 | 37651.056 | 32941.866 |
| 11/6/19 | 37605.502 | 32876.657 |
| 11/7/19 | 37326.262 | 32892.188 |
| 11/8/19 | 37201.38 | 32916.578 |
| 11/11/19 | 37602.641 | 33142.962 |
| 11/12/19 | 37302.482 | 33133.241 |
| 11/13/19 | 37089.392 | 33040.319 |
| 11/14/19 | 37067.197 | 33193.12 |
| 11/15/19 | 36807.497 | 33434.225 |
| 11/18/19 | 36863.183 | 33833.349 |
| 11/19/19 | 37289.03 | 34119.573 |
| 11/20/19 | 37041.625 | 33989.441 |
| 11/21/19 | 36839.396 | 33433.761 |
| 11/22/19 | 37433.222 | 33466.957 |
| 11/25/19 | 37129.432 | 32924.89 |
| 11/26/19 | 37029.978 | 33316.91 |
| 11/27/19 | 37131.954 | 33221.657 |
| 11/28/19 | 37398.777 | 33639.506 |
| 11/29/19 | 37190.253 | 33664.668 |
| 12/2/19 | 37036.434 | 33223.072 |
| 12/3/19 | 36913.24 | 33060.518 |
| 12/4/19 | 36173.162 | 32477.548 |
| 12/5/19 | 36434.767 | 32893.745 |
| 12/6/19 | 36486.132 | 32524.437 |
| 12/9/19 | 36468.947 | 32744.488 |
| 12/10/19 | 36529.541 | 32985.556 |
| 12/11/19 | 36398.023 | 32750.989 |
| 12/12/19 | 36280.076 | 32611.506 |
| 12/13/19 | 36297.261 | 32866.864 |
| 12/16/19 | 36138.973 | 33134.821 |
| 12/17/19 | 36275.849 | 33327.304 |
| 12/18/19 | 36460.399 | 33559.542 |
| 12/19/19 | 36406.7 | 34100.226 |
| 12/20/19 | 36349.811 | 34199.114 |
| 12/23/19 | 36302.014 | 33943.106 |
| 12/24/19 | 36326.613 | 34039.43 |
| 12/27/19 | 36551.431 | 34122.557 |
| 12/30/19 | 36434.934 | 34316.261 |
| 12/31/19 | 36109.242 | 33762.86 |
| 1/2/20 | 36142.214 | 34041.052 |
| 1/3/20 | 36142.214 | 34458.011 |
| 1/6/20 | 35812.886 | 35017.127 |
| 1/7/20 | 35726.229 | 34948.101 |
| 1/8/20 | 35771.966 | 34629.416 |
| 1/9/20 | 36079.73 | 35500.744 |
| 1/10/20 | 35796.472 | 35061.731 |
| 1/13/20 | 35906.693 | 35362.242 |
| 1/14/20 | 35914.635 | 35519.08 |
| 1/15/20 | 35984.496 | 35440.146 |
| 1/16/20 | 36248.328 | 35509.035 |
| 1/17/20 | 35866.803 | 35076.915 |
| 1/20/20 | 36168.489 | 34890.744 |
| 1/21/20 | 36183.796 | 35248.137 |
| 1/22/20 | 36695.637 | 35927.094 |
| 1/23/20 | 36386.701 | 35861.002 |
| 1/24/20 | 36496.537 | 35838.614 |
| 1/28/20 | 36031.823 | 35438.161 |
| 1/29/20 | 36364.091 | 35675.409 |
| 1/30/20 | 35748.029 | 35239.94 |
| 1/31/20 | 36520.304 | 36014.796 |
| 2/3/20 | 35719.202 | 35701.683 |
| 2/4/20 | 35999.866 | 36287.28 |
| 2/5/20 | 36552.503 | 36469.99 |
| 2/6/20 | 36473.155 | 36083.904 |
| 2/7/20 | 36564.221 | 35912.939 |
| 2/10/20 | 36569.731 | 35752.466 |
| 2/11/20 | 36990.744 | 36175.106 |
| 2/12/20 | 37296.698 | 36109.456 |
| 2/13/20 | 37345.139 | 36131.208 |
| 2/14/20 | 37447.334 | 36020.552 |
| 2/17/20 | 37826.211 | 36129.003 |
| 2/18/20 | 37627.272 | 35931.19 |
| 2/19/20 | 37171.534 | 36218.341 |
| 2/20/20 | 37511.553 | 35906.639 |
| 2/21/20 | 37585.335 | 36672.502 |
| 2/24/20 | 37050.319 | 36028.991 |
| 2/25/20 | 36572.484 | 35674.769 |
| 2/26/20 | 36208.281 | 34623.019 |
| 2/27/20 | 36208.281 | 34309.771 |
| 2/28/20 | 36208.281 | 33178.726 |
| 3/2/20 | 36208.281 | 32573.575 |
| 3/3/20 | 36208.281 | 32768.398 |
| 3/4/20 | 36208.281 | 32433.043 |
| 3/5/20 | 36208.281 | 32620.999 |
| 3/6/20 | 36208.281 | 32445.746 |
| 3/9/20 | 36208.281 | 31642.973 |
| 3/10/20 | 36208.281 | 31382.071 |
| 3/11/20 | 36208.281 | 31391.25 |
| 3/12/20 | 36208.281 | 31299.462 |
| 3/13/20 | 36208.281 | 31317.819 |
| 3/16/20 | 36208.281 | 31326.998 |
| 3/17/20 | 36208.281 | 31326.998 |
| 3/18/20 | 36208.281 | 31336.177 |
| 3/19/20 | 36208.281 | 31409.607 |
| 3/20/20 | 36208.281 | 31391.248 |
| 3/23/20 | 36208.281 | 31372.891 |
| 3/24/20 | 36208.281 | 31372.891 |
| 3/25/20 | 36208.281 | 31372.891 |
| 3/26/20 | 36208.281 | 31372.891 |
| 3/27/20 | 36208.281 | 31372.891 |
| 3/30/20 | 36208.281 | 31372.891 |
| 3/31/20 | 36208.281 | 31372.891 |
| 4/1/20 | 36208.281 | 31372.891 |
| 4/2/20 | 36208.281 | 31372.891 |
| 4/3/20 | 36208.281 | 31372.891 |
| 4/6/20 | 36208.281 | 31372.891 |
| 4/7/20 | 36208.281 | 31372.891 |
| 4/8/20 | 36208.281 | 31372.891 |
| 4/9/20 | 36208.281 | 31372.891 |
| 4/14/20 | 36208.281 | 31372.891 |
| 4/15/20 | 36208.281 | 31372.891 |
| 4/16/20 | 36208.281 | 31372.891 |
| 4/17/20 | 36208.281 | 31372.891 |
| 4/20/20 | 36208.281 | 31372.891 |
| 4/21/20 | 36208.281 | 31372.891 |
| 4/22/20 | 36208.281 | 31372.891 |
| 4/23/20 | 36208.281 | 31372.891 |
| 4/24/20 | 36208.281 | 31372.891 |
| 4/27/20 | 36208.281 | 31372.891 |
| 4/28/20 | 36208.281 | 31372.891 |
| 4/29/20 | 36208.281 | 31372.891 |
| 4/30/20 | 36208.281 | 31372.891 |
| 5/1/20 | 36208.281 | 31372.891 |
| 5/4/20 | 36208.281 | 31372.891 |
| 5/5/20 | 36208.281 | 31372.891 |
| 5/6/20 | 36208.281 | 31372.891 |
| 5/7/20 | 36208.281 | 31372.891 |
| 5/8/20 | 36208.281 | 31372.891 |
| 5/11/20 | 36208.281 | 31372.891 |
| 5/12/20 | 36208.281 | 31372.891 |
| 5/13/20 | 36208.281 | 31372.891 |
| 5/14/20 | 36208.281 | 31372.891 |
| 5/15/20 | 36208.281 | 31372.891 |
| 5/18/20 | 36208.281 | 31372.891 |
| 5/19/20 | 36208.281 | 31372.891 |
| 5/20/20 | 36208.281 | 31372.891 |
| 5/21/20 | 36208.281 | 31372.891 |
| 5/22/20 | 36208.281 | 31372.891 |
| 5/25/20 | 36208.281 | 31372.891 |
| 5/26/20 | 36208.281 | 31372.891 |
| 5/27/20 | 36143.468 | 31316.721 |
| 5/28/20 | 36122.747 | 31298.729 |
| 5/29/20 | 36074.462 | 31256.895 |
| 6/1/20 | 36176.848 | 31345.593 |
| 6/2/20 | 36210.815 | 31375.014 |
| 6/3/20 | 36344.828 | 31491.117 |
| 6/4/20 | 36355.484 | 31500.297 |
| 6/5/20 | 36186.467 | 31353.858 |
| 6/9/20 | 36349.798 | 31495.371 |
| 6/10/20 | 36334.862 | 31482.417 |
| 6/11/20 | 35909.327 | 31113.732 |
| 6/12/20 | 35781.116 | 31002.653 |
| 6/15/20 | 35684.432 | 30918.9 |
| 6/16/20 | 36322.434 | 31471.64 |
| 6/17/20 | 36791.037 | 31877.649 |
| 6/18/20 | 36711.156 | 31808.446 |
| 6/19/20 | 37074.861 | 32123.553 |
| 6/22/20 | 36972.986 | 32035.258 |
| 6/23/20 | 37164.98 | 32201.611 |
| 6/24/20 | 37673.928 | 32642.593 |
| 6/25/20 | 36973.962 | 32036.126 |
| 6/26/20 | 37315.79 | 32332.297 |
| 6/29/20 | 37580.549 | 32561.701 |
| 6/30/20 | 37983.95 | 32911.153 |
| 7/1/20 | 38177.964 | 33079.257 |
| 7/2/20 | 38139.729 | 33046.121 |
| 7/3/20 | 38037.995 | 32957.961 |
| 7/6/20 | 37570.432 | 32552.809 |
| 7/7/20 | 37430.877 | 32431.875 |
| 7/8/20 | 36647.366 | 31753.017 |
| 7/9/20 | 37288.464 | 32308.495 |
| 7/10/20 | 36710.068 | 31807.345 |
| 7/13/20 | 36603.616 | 31715.113 |
| 7/14/20 | 35844.622 | 31057.456 |
| 7/15/20 | 37351.512 | 32497.286 |
| 7/16/20 | 37162.558 | 32266.497 |
| 7/17/20 | 37104.157 | 32282.959 |
| 7/20/20 | 37013.656 | 32258.043 |
| 7/21/20 | 38860.882 | 33245.178 |
| 7/22/20 | 38477.663 | 32890.139 |
| 7/23/20 | 38890.99 | 33250.191 |
| 7/24/20 | 39203.063 | 33420.944 |
| 7/27/20 | 39519.914 | 33559.38 |
| 7/28/20 | 38957.04 | 33265.273 |
| 7/29/20 | 38624.078 | 32930.777 |
| 7/30/20 | 39347.561 | 33603.628 |
| 7/31/20 | 38603.931 | 32882.629 |
| 8/3/20 | 38114.843 | 32675.436 |
| 8/4/20 | 38642.977 | 33257.611 |
| 8/5/20 | 38773.119 | 33416.379 |
| 8/6/20 | 38806.301 | 33429.833 |
| 8/7/20 | 38951.08 | 33375.098 |
| 8/10/20 | 38867.226 | 33415.502 |
| 8/11/20 | 38720.179 | 33353.225 |
| 8/12/20 | 37632.878 | 32568.307 |
| 8/13/20 | 37850.106 | 32702.837 |
| 8/14/20 | 38101.136 | 32807.28 |
| 8/17/20 | 38110.352 | 32771.182 |
| 8/18/20 | 38635.902 | 33243.785 |
| 8/19/20 | 38730.927 | 33452.613 |
| 8/20/20 | 38488.738 | 33334.779 |
| 8/21/20 | 38674.154 | 33483.919 |
| 8/24/20 | 39488.465 | 34310.219 |
| 8/25/20 | 38883.715 | 33893.559 |
| 8/26/20 | 38578.731 | 33819.081 |
| 8/27/20 | 39236.923 | 34581.042 |
| 8/28/20 | 38696.301 | 34156.708 |
| 8/31/20 | 38792.209 | 34195.739 |
| 9/1/20 | 39021.157 | 34317.438 |
| 9/2/20 | 40763.198 | 35591.123 |
| 9/3/20 | 40667.882 | 35836.275 |
| 9/4/20 | 39942.55 | 35210.749 |
| 9/7/20 | 40267.662 | 35529.547 |
| 9/8/20 | 40425.998 | 35646.571 |
| 9/9/20 | 39986.531 | 35502.134 |
| 9/10/20 | 40488.334 | 35887.78 |
| 9/11/20 | 40488.334 | 36073.273 |
| 9/14/20 | 40488.334 | 36102.615 |
| 9/15/20 | 40488.334 | 36270.326 |
| 9/16/20 | 40488.334 | 36690.957 |
| 9/17/20 | 40455.227 | 36411.827 |
| 9/18/20 | 40466.199 | 36629.832 |
| 9/21/20 | 40466.199 | 36281.42 |
| 9/22/20 | 40466.199 | 35919.284 |
| 9/23/20 | 40466.199 | 36191.89 |
| 9/24/20 | 40466.199 | 36156.136 |
| 9/25/20 | 40466.199 | 35971.045 |
| 9/28/20 | 40466.199 | 35921.88 |
| 9/29/20 | 40466.199 | 36020.69 |
| 9/30/20 | 40495.439 | 35863.795 |
| 10/1/20 | 40510.155 | 35894.806 |
| 10/2/20 | 40510.155 | 35441.925 |
| 10/5/20 | 40510.155 | 35515.804 |
| 10/6/20 | 40510.155 | 35701.555 |
| 10/7/20 | 40510.155 | 35796.914 |
| 10/8/20 | 39861.167 | 35361.47 |
| 10/9/20 | 40037.297 | 35782.197 |
| 10/12/20 | 40121.163 | 36199.771 |
| 10/13/20 | 39877.937 | 35910.202 |
| 10/14/20 | 39822.02 | 36322.893 |
| 10/15/20 | 40216.214 | 36625.216 |
| 10/16/20 | 40153.316 | 36583.295 |
| 10/19/20 | 39968.799 | 36742.736 |
| 10/20/20 | 40089.01 | 36458.663 |
| 10/21/20 | 39859.757 | 36469.958 |
| 10/22/20 | 40098.788 | 37254.31 |
| 10/23/20 | 39921.254 | 36792.77 |
| 10/26/20 | 40061.042 | 36535.434 |
| 10/27/20 | 39518.68 | 36203.904 |
| 10/28/20 | 39840.188 | 36248.37 |
| 10/29/20 | 39685.027 | 36076.784 |
| 10/30/20 | 39861.161 | 35800.389 |
| 11/2/20 | 39861.161 | 35505.136 |
| 11/3/20 | 39861.161 | 36034.276 |
| 11/4/20 | 39861.161 | 36109.628 |
| 11/5/20 | 39947.356 | 36572.087 |
| 11/6/20 | 40004.525 | 36652.451 |
| 11/9/20 | 40202.631 | 37343.045 |
| 11/10/20 | 39786.394 | 36371.917 |
| 11/11/20 | 40205.838 | 37004.665 |
| 11/12/20 | 40130.588 | 36931.196 |
| 11/13/20 | 40434.2 | 37255.263 |
| 11/16/20 | 40519.197 | 37473.914 |
| 11/17/20 | 40652.44 | 37563.957 |
| 11/18/20 | 40634.561 | 37697.805 |
| 11/19/20 | 40489.947 | 37504.833 |
| 11/20/20 | 40575.928 | 37638.699 |
| 11/23/20 | 41131.315 | 37866.56 |
| 11/24/20 | 40973.23 | 38130.513 |
| 11/25/20 | 41094.937 | 38047.907 |
| 11/26/20 | 40889.298 | 37913.286 |
| 11/27/20 | 41083.257 | 38101.396 |
| 11/30/20 | 41114.213 | 38252.217 |
| 12/1/20 | 41341.727 | 38280.015 |
| 12/2/20 | 41216.548 | 38331.643 |
| 12/3/20 | 41199.056 | 38142.542 |
| 12/4/20 | 41294.959 | 38327.27 |
| 12/7/20 | 41375.641 | 38546.302 |
| 12/8/20 | 41039.451 | 38386.193 |
| 12/9/20 | 41440.748 | 38847.307 |
| 12/10/20 | 40468.983 | 38292.016 |
| 12/11/20 | 40881.932 | 38578.551 |
| 12/14/20 | 42334.455 | 38942.474 |
| 12/15/20 | 41164.191 | 38916.994 |
| 12/16/20 | 41830.009 | 39356.41 |
| 12/17/20 | 42463.345 | 39903.814 |
| 12/18/20 | 42536.526 | 40129.697 |
| 12/21/20 | 42479.391 | 39883.747 |
| 12/22/20 | 41897.47 | 39284.988 |
| 12/23/20 | 42429.233 | 39600.843 |
| 12/24/20 | 43736.622 | 40022.263 |
| 12/29/20 | 45005.312 | 40253.64 |
| 12/30/20 | 46800.475 | 40452.094 |
| 12/31/20 | 45946.048 | 39852.914 |
| 1/4/21 | 47796.98 | 41103.67 |
| 1/5/21 | 47932.011 | 41017.796 |
| 1/6/21 | 48363.984 | 40681.454 |
| 1/7/21 | 48551.714 | 40975.65 |
| 1/8/21 | 48997.899 | 40654.25 |
| 1/11/21 | 48290.105 | 40097.904 |
| 1/12/21 | 48070.8 | 40266.536 |
| 1/13/21 | 49674.375 | 40840.636 |
| 1/14/21 | 49752.95 | 40626.77 |
| 1/15/21 | 49783.075 | 40570.734 |
| 1/18/21 | 48687.126 | 40341.89 |
| 1/19/21 | 48104.56 | 40238.821 |
| 1/20/21 | 48318.053 | 40548.117 |
| 1/21/21 | 50735.361 | 40904.741 |
| 1/22/21 | 50659.213 | 41457.839 |
| 1/25/21 | 50952.256 | 41295.987 |
| 1/27/21 | 50658.924 | 41139.467 |
| 1/28/21 | 48314.024 | 40380.099 |
| 1/29/21 | 47475.307 | 40301.733 |
| 2/1/21 | 47053.185 | 40364.922 |
| 2/2/21 | 49539.964 | 41665.129 |
| 2/3/21 | 49978.561 | 42554.937 |
| 2/4/21 | 50123.904 | 42741.703 |
| 2/5/21 | 50743.145 | 42964.566 |
| 2/8/21 | 51309.606 | 43190.955 |
| 2/9/21 | 51385.57 | 43053.759 |
| 2/10/21 | 51976.756 | 43257.498 |
| 2/11/21 | 52298.793 | 43004.394 |
| 2/12/21 | 52436.229 | 43386.475 |
| 2/15/21 | 53711.41 | 44039.984 |
| 2/16/21 | 55301.338 | 45693.606 |
| 2/17/21 | 55031.556 | 44636.083 |
| 2/18/21 | 54067.254 | 44949.66 |
| 2/19/21 | 53806.261 | 44636.896 |
| 2/22/21 | 54699.708 | 44706.828 |
| 2/23/21 | 54051.883 | 44528.484 |
| 2/24/21 | 53690.049 | 45407.307 |
| 2/25/21 | 54029.708 | 45449.745 |
| 2/26/21 | 54238.56 | 44955.129 |
| 3/1/21 | 54243.903 | 44347.767 |
| 3/2/21 | 55225.886 | 44272.762 |
| 3/3/21 | 56465.353 | 44669.72 |
| 3/4/21 | 56321.875 | 44630.388 |
| 3/5/21 | 54808.354 | 43424.837 |
| 3/8/21 | 55089.115 | 43550.421 |
| 3/9/21 | 55421.567 | 43213.92 |
| 3/10/21 | 54774.332 | 43397.199 |
| 3/11/21 | 55017.245 | 44198.945 |
| 3/12/21 | 55017.245 | 44631.861 |
| 3/15/21 | 54810.738 | 45083.606 |
| 3/16/21 | 54776.355 | 44514.232 |
| 3/17/21 | 54741.972 | 43692.165 |
| 3/18/21 | 54322.971 | 43384.922 |
| 3/19/21 | 54367.695 | 42720.99 |
| 3/22/21 | 54493.671 | 43065.329 |
| 3/23/21 | 54336.762 | 42948.105 |
| 3/24/21 | 54318.336 | 42829.749 |
| 3/25/21 | 54350.444 | 42872.506 |
| 3/26/21 | 54309.404 | 42899.601 |
| 3/29/21 | 54313.966 | 42852.06 |
| 3/30/21 | 54462.118 | 42945.525 |
| 3/31/21 | 54448.067 | 42528.172 |
| 4/1/21 | 54448.067 | 43073.204 |
| 4/6/21 | 54448.067 | 43415.223 |
| 4/7/21 | 54448.067 | 43495.072 |
| 4/8/21 | 54267.882 | 43920.21 |
| 4/9/21 | 54380.384 | 44147.655 |
| 4/12/21 | 54267.882 | 44197.233 |
| 4/13/21 | 54177.89 | 43863.654 |
| 4/14/21 | 54218.902 | 43856.013 |
| 4/15/21 | 54602.301 | 44024.412 |
| 4/16/21 | 54865.506 | 44138.272 |
| 4/19/21 | 54796.825 | 44033.086 |
| 4/20/21 | 54645.465 | 43941.951 |
| 4/21/21 | 54427.206 | 43627.819 |
| 4/22/21 | 54544.453 | 43624.76 |
| 4/23/21 | 54399.174 | 43683.767 |
| 4/26/21 | 54081.488 | 43608.854 |
| 4/27/21 | 53848.18 | 43688.388 |
| 4/28/21 | 53567.007 | 43840.436 |
| 4/29/21 | 53679.449 | 43931.796 |
| 4/30/21 | 54522.485 | 43706.425 |
| 5/3/21 | 54854.641 | 43829.306 |
| 5/4/21 | 54587.247 | 43645.85 |
| 5/5/21 | 54577.661 | 43705.47 |
| 5/6/21 | 54306.061 | 43521.19 |
| 5/7/21 | 54017.158 | 43423.476 |
| 5/10/21 | 53365.647 | 43382.228 |
| 5/11/21 | 53600.525 | 43297.529 |
| 5/12/21 | 54224.472 | 42985.471 |
| 5/13/21 | 54138.543 | 43159.025 |
| 5/14/21 | 54353.256 | 43384.85 |
| 5/17/21 | 54569.044 | 43119.348 |
| 5/18/21 | 54399.542 | 43059.179 |
| 5/19/21 | 54428.504 | 43099.896 |
| 5/20/21 | 55250.228 | 43310.555 |
| 5/21/21 | 55962.171 | 43388.795 |
| 5/24/21 | 56441.901 | 43599.075 |
| 5/25/21 | 56903.748 | 44071.405 |
| 5/26/21 | 56978.605 | 44265.456 |
| 5/27/21 | 57405.825 | 44061.468 |
| 5/28/21 | 57914.561 | 44231.505 |
| 5/31/21 | 58294.979 | 44417.225 |
| 6/1/21 | 58083.502 | 44451 |
| 6/2/21 | 57843.553 | 44300.102 |
| 6/3/21 | 57737.636 | 44473.833 |
| 6/4/21 | 58219.457 | 44581.273 |
| 6/7/21 | 58557.094 | 44613.127 |
| 6/8/21 | 60123.725 | 44697.495 |
| 6/9/21 | 60228.455 | 44691.724 |
| 6/10/21 | 59980.645 | 44684.797 |
| 6/11/21 | 59946.942 | 44828.628 |
| 6/15/21 | 58140.578 | 45217.956 |
| 6/16/21 | 58415.048 | 45329.084 |
| 6/17/21 | 57734.11 | 45138.525 |
| 6/18/21 | 58509.537 | 45362.764 |
| 6/21/21 | 57799.559 | 45312.366 |
| 6/22/21 | 58131.155 | 45699.356 |
| 6/23/21 | 58650.993 | 45642.291 |
| 6/24/21 | 58816.764 | 45676.455 |
| 6/25/21 | 59686.029 | 46467.461 |
| 6/28/21 | 59743.996 | 46760.104 |
| 6/29/21 | 59474.389 | 46607.152 |
| 6/30/21 | 60144.249 | 46989.242 |
| 7/1/21 | 59544.527 | 46461.576 |
| 7/2/21 | 59740.142 | 46656.659 |
| 7/5/21 | 58629.734 | 46205.881 |
| 7/6/21 | 57771.377 | 45702.699 |
| 7/7/21 | 58243.855 | 45739.809 |
| 7/8/21 | 58032.057 | 45577.438 |
| 7/9/21 | 58094.766 | 45513.442 |
| 7/12/21 | 58251.936 | 45568.85 |
| 7/13/21 | 58393.564 | 45724.874 |
| 7/14/21 | 57628.036 | 45738.065 |
| 7/15/21 | 58286.938 | 45839.508 |
| 7/16/21 | 59359.371 | 46016.136 |
| 7/19/21 | 58926.148 | 45710.046 |
| 7/20/21 | 58750.301 | 45782.255 |
| 7/21/21 | 59653.146 | 45843.401 |
| 7/22/21 | 59900.349 | 46271.171 |
| 7/23/21 | 59615.87 | 46280.291 |
| 7/26/21 | 59752.718 | 46716.14 |
| 7/27/21 | 59305.576 | 46490.323 |
| 7/28/21 | 58696.828 | 46391.759 |
| 7/29/21 | 59885.868 | 46780.202 |
| 7/30/21 | 59616.07 | 47028.165 |
| 8/2/21 | 60058.195 | 47363.316 |
| 8/3/21 | 61123.909 | 47909.643 |
| 8/4/21 | 61414.193 | 48512.461 |
| 8/5/21 | 61435.903 | 48462.197 |
| 8/6/21 | 61771.92 | 48396.831 |
| 8/9/21 | 62010.477 | 48670.273 |
| 8/10/21 | 62181.36 | 48718.428 |
| 8/11/21 | 63196.613 | 48906.471 |
| 8/12/21 | 62468.279 | 48512.461 |
| 8/13/21 | 62407.01 | 48706.555 |
| 8/16/21 | 61819.404 | 48951.958 |
| 8/17/21 | 61479.923 | 49178.365 |
| 8/18/21 | 61307.773 | 49041.232 |
| 8/19/21 | 61828.116 | 49231.237 |
| 8/20/21 | 61878.049 | 48833.931 |
| 8/23/21 | 62759.446 | 50156.867 |
| 8/24/21 | 62393.169 | 49860.028 |
| 8/25/21 | 62647.465 | 49067.887 |
| 8/26/21 | 63658.802 | 49473.389 |
| 8/27/21 | 63030.636 | 48954.428 |
| 8/30/21 | 63496.937 | 49192.444 |
| 8/31/21 | 64829.979 | 50494.829 |
| 9/1/21 | 64108.499 | 49750.939 |
| 9/2/21 | 64253.326 | 50025.679 |
| 9/3/21 | 64616.949 | 50308.994 |
| 9/6/21 | 64715.031 | 50863.404 |
| 9/7/21 | 64342.848 | 50240.897 |
| 9/8/21 | 64551.113 | 50553.632 |
| 9/9/21 | 63586.584 | 49282.567 |
| 9/10/21 | 64764.284 | 49557.303 |
| 9/13/21 | 64494.107 | 49693.02 |
| 9/14/21 | 64936.368 | 50302.714 |
| 9/15/21 | 65232.861 | 50034.967 |
| 9/16/21 | 64938.276 | 50217.925 |
| 9/17/21 | 65110.493 | 49834.853 |
| 9/20/21 | 63775.643 | 49234.517 |
| 9/21/21 | 63057.51 | 49535.769 |
| 9/22/21 | 63057.51 | 49722.781 |
| 9/23/21 | 63057.51 | 50101.122 |
| 9/24/21 | 62726.408 | 49710.634 |
| 9/27/21 | 62735.597 | 49512.263 |
| 9/28/21 | 62735.597 | 48667.797 |
| 9/29/21 | 62735.597 | 48655.051 |
| 9/30/21 | 62735.597 | 49166.357 |
| 10/1/21 | 62735.597 | 49004.388 |
| 10/4/21 | 62735.597 | 48854.822 |
| 10/5/21 | 62735.597 | 48837.493 |
| 10/6/21 | 62735.597 | 49221.991 |
| 10/7/21 | 62735.597 | 49602.501 |
| 10/8/21 | 62735.597 | 49891.104 |
| 10/11/21 | 62735.597 | 49273.517 |
| 10/12/21 | 62735.597 | 49372.951 |
| 10/13/21 | 62735.597 | 49729.626 |
| 10/14/21 | 62735.597 | 50055.141 |
| 10/15/21 | 62735.597 | 50155.131 |
| 10/18/21 | 62735.597 | 49878.601 |
| 10/19/21 | 62529.718 | 49592.522 |
| 10/20/21 | 62623.2 | 49584.478 |
| 10/21/21 | 62297.152 | 49329.336 |
| 10/22/21 | 62977.019 | 50241.771 |
| 10/25/21 | 62831.215 | 50702.227 |
| 10/26/21 | 62908.623 | 50615.389 |
| 10/27/21 | 62978.854 | 50925.459 |
| 10/28/21 | 63221.814 | 50739.067 |
| 10/29/21 | 63111.132 | 51468.903 |
| 11/1/21 | 63461.733 | 51798.19 |
| 11/2/21 | 63461.733 | 51934.047 |
| 11/3/21 | 63461.733 | 51661.938 |
| 11/4/21 | 63811.058 | 51983.26 |
| 11/5/21 | 63423.125 | 51797.42 |
| 11/8/21 | 63384.906 | 51744.39 |
| 11/9/21 | 63388.304 | 51492.348 |
| 11/10/21 | 63283.84 | 51505.432 |
| 11/11/21 | 63129.047 | 51500.652 |
| 11/12/21 | 63181.28 | 52162.956 |
| 11/15/21 | 63076.949 | 52244.972 |
| 11/16/21 | 63257.463 | 52059.889 |
| 11/17/21 | 63322.498 | 52381.426 |
| 11/18/21 | 63353.051 | 50937.543 |
| 11/19/21 | 63353.051 | 51940.671 |
| 11/22/21 | 63353.051 | 51746.745 |
| 11/23/21 | 63353.051 | 51229.842 |
| 11/24/21 | 63353.051 | 50394.898 |
| 11/25/21 | 63215.036 | 50209.47 |
| 11/26/21 | 63159.42 | 49902.821 |
| 11/29/21 | 63079.63 | 49458.042 |
| 11/30/21 | 63079.63 | 50219.231 |
| 12/1/21 | 63079.63 | 49652.215 |
| 12/2/21 | 63079.63 | 49524.018 |
| 12/3/21 | 63079.63 | 49000.787 |
| 12/6/21 | 63079.63 | 48473.485 |
| 12/7/21 | 63079.63 | 49107.659 |
| 12/8/21 | 63079.63 | 49229.058 |
| 12/9/21 | 63079.63 | 49393.522 |
| 12/10/21 | 63109.618 | 49612.459 |
| 12/13/21 | 63109.618 | 51473.854 |